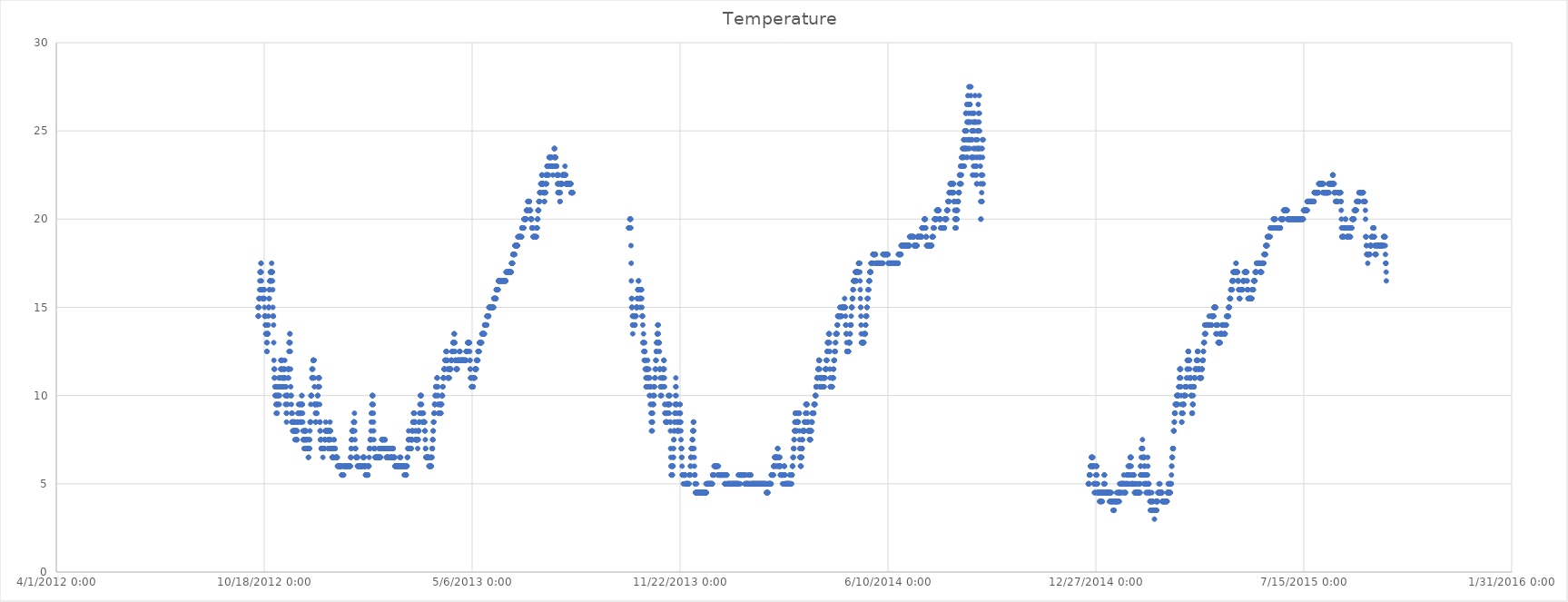
| Category | Temperature  |
|---|---|
| 41194.0 | 15 |
| 41194.166666666664 | 14.5 |
| 41194.333333333336 | 14.5 |
| 41194.5 | 14.5 |
| 41194.666666666664 | 15 |
| 41194.833333333336 | 15 |
| 41195.0 | 15.5 |
| 41195.166666666664 | 15.5 |
| 41195.333333333336 | 15.5 |
| 41195.5 | 15.5 |
| 41195.666666666664 | 16 |
| 41195.833333333336 | 16.5 |
| 41196.0 | 17 |
| 41196.166666666664 | 17 |
| 41196.333333333336 | 17 |
| 41196.5 | 17 |
| 41196.666666666664 | 17 |
| 41196.833333333336 | 17.5 |
| 41197.0 | 17.5 |
| 41197.166666666664 | 17 |
| 41197.333333333336 | 16.5 |
| 41197.5 | 16 |
| 41197.666666666664 | 16 |
| 41197.833333333336 | 16 |
| 41198.0 | 16 |
| 41198.166666666664 | 16 |
| 41198.333333333336 | 15.5 |
| 41198.5 | 15.5 |
| 41198.666666666664 | 15.5 |
| 41198.833333333336 | 16 |
| 41199.0 | 16 |
| 41199.166666666664 | 16 |
| 41199.333333333336 | 15.5 |
| 41199.5 | 15.5 |
| 41199.666666666664 | 15.5 |
| 41199.833333333336 | 16 |
| 41200.0 | 16 |
| 41200.166666666664 | 15.5 |
| 41200.333333333336 | 15 |
| 41200.5 | 14.5 |
| 41200.666666666664 | 14.5 |
| 41200.833333333336 | 14.5 |
| 41201.0 | 14.5 |
| 41201.166666666664 | 14 |
| 41201.333333333336 | 14 |
| 41201.5 | 13.5 |
| 41201.666666666664 | 13.5 |
| 41201.833333333336 | 14 |
| 41202.0 | 14 |
| 41202.166666666664 | 13.5 |
| 41202.333333333336 | 13 |
| 41202.5 | 12.5 |
| 41202.666666666664 | 12.5 |
| 41202.833333333336 | 13 |
| 41203.0 | 13.5 |
| 41203.166666666664 | 13.5 |
| 41203.333333333336 | 13.5 |
| 41203.5 | 13.5 |
| 41203.666666666664 | 13.5 |
| 41203.833333333336 | 14 |
| 41204.0 | 14.5 |
| 41204.166666666664 | 15 |
| 41204.333333333336 | 15 |
| 41204.5 | 15 |
| 41204.666666666664 | 15.5 |
| 41204.833333333336 | 15.5 |
| 41205.0 | 16 |
| 41205.166666666664 | 16 |
| 41205.333333333336 | 16.5 |
| 41205.5 | 16.5 |
| 41205.666666666664 | 16.5 |
| 41205.833333333336 | 17 |
| 41206.0 | 17 |
| 41206.166666666664 | 17 |
| 41206.333333333336 | 17 |
| 41206.5 | 16.5 |
| 41206.666666666664 | 16.5 |
| 41206.833333333336 | 17 |
| 41207.0 | 17 |
| 41207.166666666664 | 17.5 |
| 41207.333333333336 | 17 |
| 41207.5 | 17 |
| 41207.666666666664 | 17 |
| 41207.833333333336 | 17 |
| 41208.0 | 16.5 |
| 41208.166666666664 | 16 |
| 41208.333333333336 | 15 |
| 41208.5 | 14.5 |
| 41208.666666666664 | 14.5 |
| 41208.833333333336 | 14.5 |
| 41209.0 | 14 |
| 41209.166666666664 | 13 |
| 41209.333333333336 | 12 |
| 41209.5 | 11.5 |
| 41209.666666666664 | 11 |
| 41209.833333333336 | 11.5 |
| 41210.0 | 11.5 |
| 41210.166666666664 | 11 |
| 41210.333333333336 | 10.5 |
| 41210.5 | 10 |
| 41210.666666666664 | 10 |
| 41210.833333333336 | 10.5 |
| 41211.0 | 10.5 |
| 41211.166666666664 | 10 |
| 41211.333333333336 | 9.5 |
| 41211.5 | 9 |
| 41211.666666666664 | 9.5 |
| 41211.833333333336 | 10 |
| 41212.0 | 10.5 |
| 41212.166666666664 | 10 |
| 41212.333333333336 | 9.5 |
| 41212.5 | 9 |
| 41212.666666666664 | 9.5 |
| 41212.833333333336 | 10 |
| 41213.0 | 10.5 |
| 41213.166666666664 | 10.5 |
| 41213.333333333336 | 10 |
| 41213.5 | 9.5 |
| 41213.666666666664 | 10 |
| 41213.833333333336 | 10.5 |
| 41214.0 | 11 |
| 41214.166666666664 | 10.5 |
| 41214.333333333336 | 10 |
| 41214.5 | 9.5 |
| 41214.666666666664 | 10 |
| 41214.833333333336 | 10.5 |
| 41215.0 | 11 |
| 41215.166666666664 | 11 |
| 41215.333333333336 | 10.5 |
| 41215.5 | 10.5 |
| 41215.666666666664 | 10.5 |
| 41215.833333333336 | 11.5 |
| 41216.0 | 12 |
| 41216.166666666664 | 12 |
| 41216.333333333336 | 11.5 |
| 41216.5 | 11.5 |
| 41216.666666666664 | 11.5 |
| 41216.833333333336 | 12 |
| 41217.0 | 12 |
| 41217.125 | 11.5 |
| 41217.291666666664 | 11 |
| 41217.458333333336 | 10.5 |
| 41217.625 | 10.5 |
| 41217.791666666664 | 11 |
| 41217.958333333336 | 11 |
| 41218.125 | 11 |
| 41218.291666666664 | 10.5 |
| 41218.458333333336 | 10.5 |
| 41218.625 | 11 |
| 41218.791666666664 | 11.5 |
| 41218.958333333336 | 11.5 |
| 41219.125 | 11.5 |
| 41219.291666666664 | 11 |
| 41219.458333333336 | 11 |
| 41219.625 | 11 |
| 41219.791666666664 | 12 |
| 41219.958333333336 | 11.5 |
| 41220.125 | 11 |
| 41220.291666666664 | 10 |
| 41220.458333333336 | 9.5 |
| 41220.625 | 10 |
| 41220.791666666664 | 10.5 |
| 41220.958333333336 | 10.5 |
| 41221.125 | 9.5 |
| 41221.291666666664 | 9 |
| 41221.458333333336 | 8.5 |
| 41221.625 | 9 |
| 41221.791666666664 | 10 |
| 41221.958333333336 | 10 |
| 41222.125 | 10 |
| 41222.291666666664 | 10 |
| 41222.458333333336 | 9.5 |
| 41222.625 | 10 |
| 41222.791666666664 | 11 |
| 41222.958333333336 | 11.5 |
| 41223.125 | 11.5 |
| 41223.291666666664 | 11.5 |
| 41223.458333333336 | 11 |
| 41223.625 | 11.5 |
| 41223.791666666664 | 12.5 |
| 41223.958333333336 | 13 |
| 41224.125 | 13 |
| 41224.291666666664 | 13 |
| 41224.458333333336 | 13 |
| 41224.625 | 13.5 |
| 41224.791666666664 | 13.5 |
| 41224.958333333336 | 13 |
| 41225.125 | 12.5 |
| 41225.291666666664 | 11.5 |
| 41225.458333333336 | 10.5 |
| 41225.625 | 10 |
| 41225.791666666664 | 10 |
| 41225.958333333336 | 10 |
| 41226.125 | 9.5 |
| 41226.291666666664 | 9 |
| 41226.458333333336 | 8.5 |
| 41226.625 | 8.5 |
| 41226.791666666664 | 9 |
| 41226.958333333336 | 9 |
| 41227.125 | 8.5 |
| 41227.291666666664 | 8.5 |
| 41227.458333333336 | 8 |
| 41227.625 | 8 |
| 41227.791666666664 | 8.5 |
| 41227.958333333336 | 8.5 |
| 41228.125 | 8.5 |
| 41228.291666666664 | 8 |
| 41228.458333333336 | 8 |
| 41228.625 | 8 |
| 41228.791666666664 | 8.5 |
| 41228.958333333336 | 8.5 |
| 41229.125 | 8.5 |
| 41229.291666666664 | 8 |
| 41229.458333333336 | 7.5 |
| 41229.625 | 8 |
| 41229.791666666664 | 8 |
| 41229.958333333336 | 8.5 |
| 41230.125 | 8 |
| 41230.291666666664 | 8 |
| 41230.458333333336 | 7.5 |
| 41230.625 | 7.5 |
| 41230.791666666664 | 8 |
| 41230.958333333336 | 8 |
| 41231.125 | 8 |
| 41231.291666666664 | 7.5 |
| 41231.458333333336 | 7.5 |
| 41231.625 | 7.5 |
| 41231.791666666664 | 8 |
| 41231.958333333336 | 8.5 |
| 41232.125 | 8.5 |
| 41232.291666666664 | 8.5 |
| 41232.458333333336 | 9 |
| 41232.625 | 9 |
| 41232.791666666664 | 9 |
| 41232.958333333336 | 9.5 |
| 41233.125 | 9 |
| 41233.291666666664 | 9 |
| 41233.458333333336 | 9 |
| 41233.625 | 9 |
| 41233.791666666664 | 9 |
| 41233.958333333336 | 9.5 |
| 41234.125 | 9.5 |
| 41234.291666666664 | 9 |
| 41234.458333333336 | 8.5 |
| 41234.625 | 9 |
| 41234.791666666664 | 9 |
| 41234.958333333336 | 9.5 |
| 41235.125 | 9 |
| 41235.291666666664 | 9 |
| 41235.458333333336 | 8.5 |
| 41235.625 | 8.5 |
| 41235.791666666664 | 9 |
| 41235.958333333336 | 9.5 |
| 41236.125 | 10 |
| 41236.291666666664 | 10 |
| 41236.458333333336 | 9.5 |
| 41236.625 | 9.5 |
| 41236.791666666664 | 9.5 |
| 41236.958333333336 | 9 |
| 41237.125 | 8.5 |
| 41237.291666666664 | 8 |
| 41237.458333333336 | 7.5 |
| 41237.625 | 7.5 |
| 41237.791666666664 | 8 |
| 41237.958333333336 | 7.5 |
| 41238.125 | 7.5 |
| 41238.291666666664 | 7.5 |
| 41238.458333333336 | 7 |
| 41238.625 | 7 |
| 41238.791666666664 | 7.5 |
| 41238.958333333336 | 8 |
| 41239.125 | 8 |
| 41239.291666666664 | 7.5 |
| 41239.458333333336 | 7.5 |
| 41239.625 | 8 |
| 41239.791666666664 | 8 |
| 41239.958333333336 | 8 |
| 41240.125 | 7.5 |
| 41240.291666666664 | 7.5 |
| 41240.458333333336 | 7 |
| 41240.625 | 7 |
| 41240.791666666664 | 7.5 |
| 41240.958333333336 | 7.5 |
| 41241.125 | 7 |
| 41241.291666666664 | 7 |
| 41241.458333333336 | 7 |
| 41241.625 | 7 |
| 41241.791666666664 | 7 |
| 41241.958333333336 | 7 |
| 41242.125 | 7 |
| 41242.291666666664 | 7 |
| 41242.458333333336 | 6.5 |
| 41242.625 | 6.5 |
| 41242.791666666664 | 7 |
| 41242.958333333336 | 7.5 |
| 41243.125 | 7.5 |
| 41243.291666666664 | 7 |
| 41243.458333333336 | 7 |
| 41243.625 | 7 |
| 41243.791666666664 | 7.5 |
| 41243.958333333336 | 8 |
| 41244.125 | 8.5 |
| 41244.291666666664 | 8.5 |
| 41244.458333333336 | 8.5 |
| 41244.625 | 8.5 |
| 41244.791666666664 | 9.5 |
| 41244.958333333336 | 10 |
| 41245.125 | 10 |
| 41245.291666666664 | 10 |
| 41245.458333333336 | 10 |
| 41245.625 | 10 |
| 41245.791666666664 | 11 |
| 41245.958333333336 | 11.5 |
| 41246.125 | 11.5 |
| 41246.291666666664 | 11 |
| 41246.458333333336 | 11 |
| 41246.625 | 11 |
| 41246.791666666664 | 11.5 |
| 41246.958333333336 | 12 |
| 41247.125 | 12 |
| 41247.291666666664 | 12 |
| 41247.458333333336 | 12 |
| 41247.625 | 12 |
| 41247.791666666664 | 12 |
| 41247.958333333336 | 12 |
| 41248.125 | 11 |
| 41248.291666666664 | 10.5 |
| 41248.458333333336 | 9.5 |
| 41248.625 | 9.5 |
| 41248.791666666664 | 9.5 |
| 41248.958333333336 | 9.5 |
| 41249.125 | 9.5 |
| 41249.291666666664 | 9 |
| 41249.458333333336 | 8.5 |
| 41249.625 | 8.5 |
| 41249.791666666664 | 9 |
| 41249.958333333336 | 9 |
| 41250.125 | 9 |
| 41250.291666666664 | 9 |
| 41250.458333333336 | 9 |
| 41250.625 | 9 |
| 41250.791666666664 | 9.5 |
| 41250.958333333336 | 9.5 |
| 41251.125 | 9.5 |
| 41251.291666666664 | 10 |
| 41251.458333333336 | 10 |
| 41251.625 | 10 |
| 41251.791666666664 | 10.5 |
| 41251.958333333336 | 10.5 |
| 41252.125 | 11 |
| 41252.291666666664 | 11 |
| 41252.458333333336 | 11 |
| 41252.625 | 11 |
| 41252.791666666664 | 11 |
| 41252.958333333336 | 11 |
| 41253.125 | 10.5 |
| 41253.291666666664 | 9.5 |
| 41253.458333333336 | 8.5 |
| 41253.625 | 8.5 |
| 41253.791666666664 | 8 |
| 41253.958333333336 | 8 |
| 41254.125 | 7.5 |
| 41254.291666666664 | 7.5 |
| 41254.458333333336 | 7.5 |
| 41254.625 | 7.5 |
| 41254.791666666664 | 7 |
| 41254.958333333336 | 7 |
| 41255.125 | 7 |
| 41255.291666666664 | 7 |
| 41255.458333333336 | 7 |
| 41255.625 | 7 |
| 41255.791666666664 | 7 |
| 41255.958333333336 | 7 |
| 41256.125 | 7 |
| 41256.291666666664 | 7 |
| 41256.458333333336 | 6.5 |
| 41256.625 | 7 |
| 41256.791666666664 | 7 |
| 41256.958333333336 | 7 |
| 41257.125 | 7 |
| 41257.291666666664 | 7 |
| 41257.458333333336 | 7 |
| 41257.625 | 7 |
| 41257.791666666664 | 7 |
| 41257.958333333336 | 7 |
| 41258.125 | 7.5 |
| 41258.291666666664 | 7.5 |
| 41258.458333333336 | 7.5 |
| 41258.625 | 7.5 |
| 41258.791666666664 | 8 |
| 41258.958333333336 | 8 |
| 41259.125 | 8.5 |
| 41259.291666666664 | 8 |
| 41259.458333333336 | 8 |
| 41259.625 | 8 |
| 41259.791666666664 | 8 |
| 41259.958333333336 | 8 |
| 41260.125 | 8 |
| 41260.291666666664 | 8 |
| 41260.458333333336 | 8 |
| 41260.625 | 8 |
| 41260.791666666664 | 8 |
| 41260.958333333336 | 8 |
| 41261.125 | 8 |
| 41261.291666666664 | 7.5 |
| 41261.458333333336 | 7 |
| 41261.625 | 7 |
| 41261.791666666664 | 7.5 |
| 41261.958333333336 | 8 |
| 41262.125 | 8 |
| 41262.291666666664 | 7.5 |
| 41262.458333333336 | 7.5 |
| 41262.625 | 7.5 |
| 41262.791666666664 | 7.5 |
| 41262.958333333336 | 8 |
| 41263.125 | 8 |
| 41263.291666666664 | 8.5 |
| 41263.458333333336 | 8 |
| 41263.625 | 8 |
| 41263.791666666664 | 8 |
| 41263.958333333336 | 7.5 |
| 41264.125 | 7 |
| 41264.291666666664 | 7 |
| 41264.458333333336 | 7 |
| 41264.625 | 7 |
| 41264.791666666664 | 7 |
| 41264.958333333336 | 7 |
| 41265.125 | 7 |
| 41265.291666666664 | 6.5 |
| 41265.458333333336 | 6.5 |
| 41265.625 | 6.5 |
| 41265.791666666664 | 6.5 |
| 41265.958333333336 | 7 |
| 41266.125 | 7 |
| 41266.291666666664 | 6.5 |
| 41266.458333333336 | 6.5 |
| 41266.625 | 6.5 |
| 41266.791666666664 | 7 |
| 41266.958333333336 | 7 |
| 41267.125 | 7.5 |
| 41267.291666666664 | 7.5 |
| 41267.458333333336 | 7 |
| 41267.625 | 7 |
| 41267.791666666664 | 7 |
| 41267.958333333336 | 7 |
| 41268.125 | 7 |
| 41268.291666666664 | 7 |
| 41268.458333333336 | 6.5 |
| 41268.625 | 6.5 |
| 41268.791666666664 | 6.5 |
| 41268.958333333336 | 6.5 |
| 41269.125 | 6.5 |
| 41269.291666666664 | 6.5 |
| 41269.458333333336 | 6.5 |
| 41269.625 | 6.5 |
| 41269.791666666664 | 6.5 |
| 41269.958333333336 | 6.5 |
| 41270.125 | 6.5 |
| 41270.291666666664 | 6.5 |
| 41270.458333333336 | 6 |
| 41270.625 | 6 |
| 41270.791666666664 | 6 |
| 41270.958333333336 | 6 |
| 41271.125 | 6 |
| 41271.291666666664 | 6 |
| 41271.458333333336 | 6 |
| 41271.625 | 6 |
| 41271.791666666664 | 6 |
| 41271.958333333336 | 6 |
| 41272.125 | 6 |
| 41272.291666666664 | 6 |
| 41272.458333333336 | 6 |
| 41272.625 | 6 |
| 41272.791666666664 | 6 |
| 41272.958333333336 | 6 |
| 41273.125 | 6 |
| 41273.291666666664 | 6 |
| 41273.458333333336 | 6 |
| 41273.625 | 6 |
| 41273.791666666664 | 6 |
| 41273.958333333336 | 6 |
| 41274.125 | 6 |
| 41274.291666666664 | 6 |
| 41274.458333333336 | 5.5 |
| 41274.625 | 5.5 |
| 41274.791666666664 | 5.5 |
| 41274.958333333336 | 5.5 |
| 41275.125 | 5.5 |
| 41275.291666666664 | 5.5 |
| 41275.458333333336 | 5.5 |
| 41275.625 | 5.5 |
| 41275.791666666664 | 5.5 |
| 41275.958333333336 | 5.5 |
| 41276.125 | 6 |
| 41276.291666666664 | 6 |
| 41276.458333333336 | 5.5 |
| 41276.625 | 6 |
| 41276.791666666664 | 6 |
| 41276.958333333336 | 6 |
| 41277.125 | 6 |
| 41277.291666666664 | 6 |
| 41277.458333333336 | 6 |
| 41277.625 | 6 |
| 41277.791666666664 | 6 |
| 41277.958333333336 | 6 |
| 41278.125 | 6 |
| 41278.291666666664 | 6 |
| 41278.458333333336 | 6 |
| 41278.625 | 6 |
| 41278.791666666664 | 6 |
| 41278.958333333336 | 6 |
| 41279.125 | 6 |
| 41279.291666666664 | 6 |
| 41279.458333333336 | 6 |
| 41279.625 | 6 |
| 41279.791666666664 | 6 |
| 41279.958333333336 | 6 |
| 41280.125 | 6 |
| 41280.291666666664 | 6 |
| 41280.458333333336 | 6 |
| 41280.625 | 6 |
| 41280.791666666664 | 6 |
| 41280.958333333336 | 6 |
| 41281.125 | 6 |
| 41281.291666666664 | 6 |
| 41281.458333333336 | 6 |
| 41281.625 | 6 |
| 41281.791666666664 | 6 |
| 41281.958333333336 | 6 |
| 41282.125 | 6 |
| 41282.291666666664 | 6 |
| 41282.458333333336 | 6 |
| 41282.625 | 6 |
| 41282.791666666664 | 6 |
| 41282.958333333336 | 6 |
| 41283.125 | 6.5 |
| 41283.291666666664 | 6.5 |
| 41283.458333333336 | 6.5 |
| 41283.625 | 7 |
| 41283.791666666664 | 7 |
| 41283.958333333336 | 7.5 |
| 41284.125 | 7.5 |
| 41284.291666666664 | 7.5 |
| 41284.458333333336 | 8 |
| 41284.625 | 8 |
| 41284.791666666664 | 8 |
| 41284.958333333336 | 8 |
| 41285.125 | 8 |
| 41285.291666666664 | 8 |
| 41285.458333333336 | 8 |
| 41285.625 | 8 |
| 41285.791666666664 | 8 |
| 41285.958333333336 | 8.5 |
| 41286.125 | 8.5 |
| 41286.291666666664 | 8.5 |
| 41286.458333333336 | 8.5 |
| 41286.625 | 8.5 |
| 41286.791666666664 | 9 |
| 41286.958333333336 | 8.5 |
| 41287.125 | 8 |
| 41287.291666666664 | 7.5 |
| 41287.458333333336 | 7 |
| 41287.625 | 7 |
| 41287.791666666664 | 7 |
| 41287.958333333336 | 7 |
| 41288.125 | 6.5 |
| 41288.291666666664 | 6.5 |
| 41288.458333333336 | 6.5 |
| 41288.625 | 6.5 |
| 41288.791666666664 | 6.5 |
| 41288.958333333336 | 6.5 |
| 41289.125 | 6.5 |
| 41289.291666666664 | 6.5 |
| 41289.458333333336 | 6.5 |
| 41289.625 | 6 |
| 41289.791666666664 | 6 |
| 41289.958333333336 | 6.5 |
| 41290.125 | 6 |
| 41290.291666666664 | 6 |
| 41290.458333333336 | 6 |
| 41290.625 | 6 |
| 41290.791666666664 | 6 |
| 41290.958333333336 | 6 |
| 41291.125 | 6 |
| 41291.291666666664 | 6 |
| 41291.458333333336 | 6 |
| 41291.625 | 6 |
| 41291.791666666664 | 6 |
| 41291.958333333336 | 6 |
| 41292.125 | 6 |
| 41292.291666666664 | 6 |
| 41292.458333333336 | 6 |
| 41292.625 | 6 |
| 41292.791666666664 | 6 |
| 41292.958333333336 | 6 |
| 41293.125 | 6 |
| 41293.291666666664 | 6 |
| 41293.458333333336 | 6 |
| 41293.625 | 6 |
| 41293.791666666664 | 6 |
| 41293.958333333336 | 6 |
| 41294.125 | 6 |
| 41294.291666666664 | 6 |
| 41294.458333333336 | 6 |
| 41294.625 | 6 |
| 41294.791666666664 | 6 |
| 41294.958333333336 | 6.5 |
| 41295.125 | 6.5 |
| 41295.291666666664 | 6.5 |
| 41295.458333333336 | 6.5 |
| 41295.625 | 6 |
| 41295.791666666664 | 6.5 |
| 41295.958333333336 | 6.5 |
| 41296.125 | 6.5 |
| 41296.291666666664 | 6 |
| 41296.458333333336 | 6 |
| 41296.625 | 6 |
| 41296.791666666664 | 6 |
| 41296.958333333336 | 6 |
| 41297.125 | 6 |
| 41297.291666666664 | 6 |
| 41297.458333333336 | 5.5 |
| 41297.625 | 5.5 |
| 41297.791666666664 | 5.5 |
| 41297.958333333336 | 6 |
| 41298.125 | 6 |
| 41298.291666666664 | 5.5 |
| 41298.458333333336 | 5.5 |
| 41298.625 | 5.5 |
| 41298.791666666664 | 5.5 |
| 41298.958333333336 | 5.5 |
| 41299.125 | 5.5 |
| 41299.291666666664 | 5.5 |
| 41299.458333333336 | 5.5 |
| 41299.625 | 5.5 |
| 41299.791666666664 | 5.5 |
| 41299.958333333336 | 6 |
| 41300.125 | 6 |
| 41300.291666666664 | 6 |
| 41300.458333333336 | 6 |
| 41300.625 | 6 |
| 41300.791666666664 | 6 |
| 41300.958333333336 | 6.5 |
| 41301.125 | 7 |
| 41301.291666666664 | 7 |
| 41301.458333333336 | 7 |
| 41301.625 | 7 |
| 41301.791666666664 | 7 |
| 41301.958333333336 | 7.5 |
| 41302.125 | 7.5 |
| 41302.291666666664 | 7.5 |
| 41302.458333333336 | 7.5 |
| 41302.625 | 7.5 |
| 41302.791666666664 | 8 |
| 41302.958333333336 | 8.5 |
| 41303.125 | 9 |
| 41303.291666666664 | 9 |
| 41303.458333333336 | 9 |
| 41303.625 | 9.5 |
| 41303.791666666664 | 9.5 |
| 41303.958333333336 | 10 |
| 41304.125 | 10 |
| 41304.291666666664 | 10 |
| 41304.458333333336 | 10 |
| 41304.625 | 9.5 |
| 41304.791666666664 | 9.5 |
| 41304.958333333336 | 9 |
| 41305.125 | 8.5 |
| 41305.291666666664 | 8 |
| 41305.458333333336 | 7.5 |
| 41305.625 | 7 |
| 41305.791666666664 | 7 |
| 41305.958333333336 | 7 |
| 41306.125 | 7 |
| 41306.291666666664 | 7 |
| 41306.458333333336 | 7 |
| 41306.625 | 6.5 |
| 41306.791666666664 | 6.5 |
| 41306.958333333336 | 6.5 |
| 41307.125 | 6.5 |
| 41307.291666666664 | 6.5 |
| 41307.458333333336 | 6.5 |
| 41307.625 | 6.5 |
| 41307.791666666664 | 6.5 |
| 41307.958333333336 | 6.5 |
| 41308.125 | 6.5 |
| 41308.291666666664 | 6.5 |
| 41308.458333333336 | 6.5 |
| 41308.625 | 6.5 |
| 41308.791666666664 | 6.5 |
| 41308.958333333336 | 6.5 |
| 41309.125 | 6.5 |
| 41309.291666666664 | 6.5 |
| 41309.458333333336 | 6.5 |
| 41309.625 | 6.5 |
| 41309.791666666664 | 6.5 |
| 41309.958333333336 | 6.5 |
| 41310.125 | 7 |
| 41310.291666666664 | 6.5 |
| 41310.458333333336 | 6.5 |
| 41310.625 | 6.5 |
| 41310.791666666664 | 6.5 |
| 41310.958333333336 | 6.5 |
| 41311.125 | 7 |
| 41311.291666666664 | 6.5 |
| 41311.458333333336 | 6.5 |
| 41311.625 | 6.5 |
| 41311.791666666664 | 6.5 |
| 41311.958333333336 | 6.5 |
| 41312.125 | 7 |
| 41312.291666666664 | 7 |
| 41312.458333333336 | 7 |
| 41312.625 | 7 |
| 41312.791666666664 | 7 |
| 41312.958333333336 | 7 |
| 41313.125 | 7.5 |
| 41313.291666666664 | 7.5 |
| 41313.458333333336 | 7.5 |
| 41313.625 | 7.5 |
| 41313.791666666664 | 7.5 |
| 41313.958333333336 | 7.5 |
| 41314.125 | 7.5 |
| 41314.291666666664 | 7.5 |
| 41314.458333333336 | 7 |
| 41314.625 | 7 |
| 41314.791666666664 | 7 |
| 41314.958333333336 | 7.5 |
| 41315.125 | 7 |
| 41315.291666666664 | 7 |
| 41315.458333333336 | 7 |
| 41315.625 | 7 |
| 41315.791666666664 | 7.5 |
| 41315.958333333336 | 7.5 |
| 41316.125 | 7.5 |
| 41316.291666666664 | 7.5 |
| 41316.458333333336 | 7 |
| 41316.625 | 7 |
| 41316.791666666664 | 7 |
| 41316.958333333336 | 7 |
| 41317.125 | 7 |
| 41317.291666666664 | 7 |
| 41317.458333333336 | 6.5 |
| 41317.625 | 6.5 |
| 41317.791666666664 | 6.5 |
| 41317.958333333336 | 6.5 |
| 41318.125 | 6.5 |
| 41318.291666666664 | 6.5 |
| 41318.458333333336 | 6.5 |
| 41318.625 | 6.5 |
| 41318.791666666664 | 6.5 |
| 41318.958333333336 | 6.5 |
| 41319.125 | 7 |
| 41319.291666666664 | 7 |
| 41319.458333333336 | 6.5 |
| 41319.625 | 6.5 |
| 41319.791666666664 | 6.5 |
| 41319.958333333336 | 7 |
| 41320.125 | 7 |
| 41320.291666666664 | 7 |
| 41320.458333333336 | 7 |
| 41320.625 | 7 |
| 41320.791666666664 | 7 |
| 41320.958333333336 | 7 |
| 41321.125 | 7 |
| 41321.291666666664 | 6.5 |
| 41321.458333333336 | 6.5 |
| 41321.625 | 6.5 |
| 41321.791666666664 | 6.5 |
| 41321.958333333336 | 6.5 |
| 41322.125 | 6.5 |
| 41322.291666666664 | 6.5 |
| 41322.458333333336 | 6.5 |
| 41322.625 | 6.5 |
| 41322.791666666664 | 6.5 |
| 41322.958333333336 | 6.5 |
| 41323.125 | 6.5 |
| 41323.291666666664 | 7 |
| 41323.458333333336 | 7 |
| 41323.625 | 7 |
| 41323.791666666664 | 7 |
| 41323.958333333336 | 7 |
| 41324.125 | 7 |
| 41324.291666666664 | 6.5 |
| 41324.458333333336 | 6.5 |
| 41324.625 | 6.5 |
| 41324.791666666664 | 6.5 |
| 41324.958333333336 | 6.5 |
| 41325.125 | 6.5 |
| 41325.291666666664 | 6.5 |
| 41325.458333333336 | 6.5 |
| 41325.625 | 6 |
| 41325.791666666664 | 6 |
| 41325.958333333336 | 6 |
| 41326.125 | 6 |
| 41326.291666666664 | 6 |
| 41326.458333333336 | 6 |
| 41326.625 | 6 |
| 41326.791666666664 | 6 |
| 41326.958333333336 | 6 |
| 41327.125 | 6 |
| 41327.291666666664 | 6 |
| 41327.458333333336 | 6 |
| 41327.625 | 6 |
| 41327.791666666664 | 6 |
| 41327.958333333336 | 6 |
| 41328.125 | 6 |
| 41328.291666666664 | 6 |
| 41328.458333333336 | 6 |
| 41328.625 | 6 |
| 41328.791666666664 | 6 |
| 41328.958333333336 | 6 |
| 41329.125 | 6 |
| 41329.291666666664 | 6 |
| 41329.458333333336 | 6 |
| 41329.625 | 6 |
| 41329.791666666664 | 6 |
| 41329.958333333336 | 6 |
| 41330.125 | 6.5 |
| 41330.291666666664 | 6 |
| 41330.458333333336 | 6 |
| 41330.625 | 6 |
| 41330.791666666664 | 6 |
| 41330.958333333336 | 6 |
| 41331.125 | 6.5 |
| 41331.291666666664 | 6.5 |
| 41331.458333333336 | 6 |
| 41331.625 | 6 |
| 41331.791666666664 | 6 |
| 41331.958333333336 | 6 |
| 41332.125 | 6 |
| 41332.291666666664 | 6 |
| 41332.458333333336 | 6 |
| 41332.625 | 6 |
| 41332.791666666664 | 6 |
| 41332.958333333336 | 6 |
| 41333.125 | 6 |
| 41333.291666666664 | 6 |
| 41333.458333333336 | 6 |
| 41333.625 | 6 |
| 41333.791666666664 | 6 |
| 41333.958333333336 | 6 |
| 41334.125 | 6 |
| 41334.291666666664 | 6 |
| 41334.458333333336 | 6 |
| 41334.625 | 5.5 |
| 41334.791666666664 | 6 |
| 41334.958333333336 | 6 |
| 41335.125 | 6 |
| 41335.291666666664 | 6 |
| 41335.458333333336 | 5.5 |
| 41335.625 | 5.5 |
| 41335.791666666664 | 6 |
| 41335.958333333336 | 6 |
| 41336.125 | 6 |
| 41336.291666666664 | 5.5 |
| 41336.458333333336 | 5.5 |
| 41336.625 | 5.5 |
| 41336.791666666664 | 6 |
| 41336.958333333336 | 6 |
| 41337.125 | 6 |
| 41337.291666666664 | 6 |
| 41337.458333333336 | 6 |
| 41337.625 | 6.5 |
| 41337.791666666664 | 6.5 |
| 41337.958333333336 | 6.5 |
| 41338.125 | 7 |
| 41338.291666666664 | 7 |
| 41338.458333333336 | 7 |
| 41338.625 | 7.5 |
| 41338.791666666664 | 7.5 |
| 41338.958333333336 | 8 |
| 41339.125 | 7.5 |
| 41339.291666666664 | 7.5 |
| 41339.458333333336 | 7 |
| 41339.625 | 7 |
| 41339.791666666664 | 7 |
| 41339.958333333336 | 7 |
| 41340.125 | 7 |
| 41340.291666666664 | 7 |
| 41340.458333333336 | 7 |
| 41340.625 | 7 |
| 41340.791666666664 | 7 |
| 41340.958333333336 | 7 |
| 41341.125 | 7.5 |
| 41341.291666666664 | 7.5 |
| 41341.458333333336 | 7.5 |
| 41341.625 | 7 |
| 41341.791666666664 | 7.5 |
| 41341.958333333336 | 7.5 |
| 41342.125 | 7.5 |
| 41342.291666666664 | 7.5 |
| 41342.458333333336 | 8 |
| 41342.625 | 8 |
| 41342.791666666664 | 8 |
| 41342.958333333336 | 8.5 |
| 41343.166666666664 | 8.5 |
| 41343.333333333336 | 8.5 |
| 41343.5 | 8.5 |
| 41343.666666666664 | 9 |
| 41343.833333333336 | 9 |
| 41344.0 | 9 |
| 41344.166666666664 | 9 |
| 41344.333333333336 | 9 |
| 41344.5 | 8.5 |
| 41344.666666666664 | 8.5 |
| 41344.833333333336 | 8.5 |
| 41345.0 | 8.5 |
| 41345.166666666664 | 8.5 |
| 41345.333333333336 | 8 |
| 41345.5 | 7.5 |
| 41345.666666666664 | 7.5 |
| 41345.833333333336 | 7.5 |
| 41346.0 | 7.5 |
| 41346.166666666664 | 8 |
| 41346.333333333336 | 7.5 |
| 41346.5 | 7.5 |
| 41346.666666666664 | 7.5 |
| 41346.833333333336 | 7.5 |
| 41347.0 | 7.5 |
| 41347.166666666664 | 7.5 |
| 41347.333333333336 | 7.5 |
| 41347.5 | 7.5 |
| 41347.666666666664 | 7 |
| 41347.833333333336 | 7.5 |
| 41348.0 | 7.5 |
| 41348.166666666664 | 7.5 |
| 41348.333333333336 | 8 |
| 41348.5 | 8 |
| 41348.666666666664 | 8 |
| 41348.833333333336 | 8 |
| 41349.0 | 8.5 |
| 41349.166666666664 | 8.5 |
| 41349.333333333336 | 8.5 |
| 41349.5 | 9 |
| 41349.666666666664 | 9 |
| 41349.833333333336 | 9.5 |
| 41350.0 | 9.5 |
| 41350.166666666664 | 10 |
| 41350.333333333336 | 10 |
| 41350.5 | 10 |
| 41350.666666666664 | 10 |
| 41350.833333333336 | 10 |
| 41351.0 | 10 |
| 41351.166666666664 | 9.5 |
| 41351.333333333336 | 9.5 |
| 41351.5 | 9 |
| 41351.666666666664 | 9 |
| 41351.833333333336 | 9 |
| 41352.0 | 9 |
| 41352.166666666664 | 9 |
| 41352.333333333336 | 9 |
| 41352.5 | 8.5 |
| 41352.666666666664 | 8.5 |
| 41352.833333333336 | 8.5 |
| 41353.0 | 8.5 |
| 41353.166666666664 | 9 |
| 41353.333333333336 | 8.5 |
| 41353.5 | 8.5 |
| 41353.666666666664 | 8.5 |
| 41353.833333333336 | 8.5 |
| 41354.0 | 8.5 |
| 41354.166666666664 | 8.5 |
| 41354.333333333336 | 8.5 |
| 41354.5 | 8 |
| 41354.666666666664 | 8 |
| 41354.833333333336 | 8 |
| 41355.0 | 7.5 |
| 41355.166666666664 | 7 |
| 41355.333333333336 | 7 |
| 41355.5 | 6.5 |
| 41355.666666666664 | 6.5 |
| 41355.833333333336 | 6.5 |
| 41356.0 | 6.5 |
| 41356.166666666664 | 6.5 |
| 41356.333333333336 | 6.5 |
| 41356.5 | 6.5 |
| 41356.666666666664 | 6.5 |
| 41356.833333333336 | 6.5 |
| 41357.0 | 6.5 |
| 41357.166666666664 | 6.5 |
| 41357.333333333336 | 6.5 |
| 41357.5 | 6.5 |
| 41357.666666666664 | 6.5 |
| 41357.833333333336 | 6.5 |
| 41358.0 | 6.5 |
| 41358.166666666664 | 6.5 |
| 41358.333333333336 | 6.5 |
| 41358.5 | 6 |
| 41358.666666666664 | 6 |
| 41358.833333333336 | 6 |
| 41359.0 | 6 |
| 41359.166666666664 | 6 |
| 41359.333333333336 | 6 |
| 41359.5 | 6 |
| 41359.666666666664 | 6 |
| 41359.833333333336 | 6 |
| 41360.0 | 6 |
| 41360.166666666664 | 6.5 |
| 41360.333333333336 | 6.5 |
| 41360.5 | 6 |
| 41360.666666666664 | 6 |
| 41360.833333333336 | 6 |
| 41361.0 | 6.5 |
| 41361.166666666664 | 6.5 |
| 41361.333333333336 | 6.5 |
| 41361.5 | 7 |
| 41361.666666666664 | 7 |
| 41361.833333333336 | 7 |
| 41362.0 | 7.5 |
| 41362.166666666664 | 7.5 |
| 41362.333333333336 | 7.5 |
| 41362.5 | 8 |
| 41362.666666666664 | 8 |
| 41362.833333333336 | 8.5 |
| 41363.0 | 8.5 |
| 41363.166666666664 | 8.5 |
| 41363.333333333336 | 9 |
| 41363.5 | 9 |
| 41363.666666666664 | 9 |
| 41363.833333333336 | 9.5 |
| 41364.0 | 9.5 |
| 41364.166666666664 | 9.5 |
| 41364.333333333336 | 9.5 |
| 41364.5 | 10 |
| 41364.666666666664 | 10 |
| 41364.833333333336 | 10 |
| 41365.0 | 10.5 |
| 41365.166666666664 | 10.5 |
| 41365.333333333336 | 10.5 |
| 41365.5 | 10.5 |
| 41365.666666666664 | 10.5 |
| 41365.833333333336 | 10.5 |
| 41366.0 | 10.5 |
| 41366.166666666664 | 11 |
| 41366.333333333336 | 11 |
| 41366.5 | 11 |
| 41366.666666666664 | 10.5 |
| 41366.833333333336 | 10.5 |
| 41367.0 | 10 |
| 41367.166666666664 | 10 |
| 41367.333333333336 | 9.5 |
| 41367.5 | 9.5 |
| 41367.666666666664 | 9 |
| 41367.833333333336 | 9 |
| 41368.0 | 9 |
| 41368.166666666664 | 9 |
| 41368.333333333336 | 9 |
| 41368.5 | 9 |
| 41368.666666666664 | 9 |
| 41368.833333333336 | 9 |
| 41369.0 | 9.5 |
| 41369.166666666664 | 9.5 |
| 41369.333333333336 | 9.5 |
| 41369.5 | 9 |
| 41369.666666666664 | 9 |
| 41369.833333333336 | 9 |
| 41370.0 | 9 |
| 41370.166666666664 | 9.5 |
| 41370.333333333336 | 9.5 |
| 41370.5 | 9.5 |
| 41370.666666666664 | 9.5 |
| 41370.833333333336 | 10 |
| 41371.0 | 10 |
| 41371.166666666664 | 10 |
| 41371.333333333336 | 10 |
| 41371.5 | 10 |
| 41371.666666666664 | 10.5 |
| 41371.833333333336 | 10.5 |
| 41372.0 | 10.5 |
| 41372.166666666664 | 11 |
| 41372.333333333336 | 11 |
| 41372.5 | 11 |
| 41372.666666666664 | 11 |
| 41372.833333333336 | 11 |
| 41373.0 | 11.5 |
| 41373.166666666664 | 11.5 |
| 41373.333333333336 | 11.5 |
| 41373.5 | 11.5 |
| 41373.666666666664 | 11.5 |
| 41373.833333333336 | 12 |
| 41374.0 | 12 |
| 41374.166666666664 | 12 |
| 41374.333333333336 | 12 |
| 41374.5 | 12 |
| 41374.666666666664 | 12 |
| 41374.833333333336 | 12.5 |
| 41375.0 | 12.5 |
| 41375.166666666664 | 12.5 |
| 41375.333333333336 | 12.5 |
| 41375.5 | 12.5 |
| 41375.666666666664 | 12 |
| 41375.833333333336 | 12 |
| 41376.0 | 12 |
| 41376.166666666664 | 12 |
| 41376.333333333336 | 11.5 |
| 41376.5 | 11.5 |
| 41376.666666666664 | 11 |
| 41376.833333333336 | 11 |
| 41377.0 | 11 |
| 41377.166666666664 | 11 |
| 41377.333333333336 | 11.5 |
| 41377.5 | 11 |
| 41377.666666666664 | 11 |
| 41377.833333333336 | 11 |
| 41378.0 | 11 |
| 41378.166666666664 | 11.5 |
| 41378.333333333336 | 11.5 |
| 41378.5 | 11.5 |
| 41378.666666666664 | 11.5 |
| 41378.833333333336 | 11.5 |
| 41379.0 | 11.5 |
| 41379.166666666664 | 11.5 |
| 41379.333333333336 | 11.5 |
| 41379.5 | 11.5 |
| 41379.666666666664 | 12 |
| 41379.833333333336 | 12 |
| 41380.0 | 12 |
| 41380.166666666664 | 12 |
| 41380.333333333336 | 12 |
| 41380.5 | 12 |
| 41380.666666666664 | 12.5 |
| 41380.833333333336 | 12.5 |
| 41381.0 | 12.5 |
| 41381.166666666664 | 12.5 |
| 41381.333333333336 | 12.5 |
| 41381.5 | 13 |
| 41381.666666666664 | 13 |
| 41381.833333333336 | 13 |
| 41382.0 | 13 |
| 41382.166666666664 | 13 |
| 41382.333333333336 | 13 |
| 41382.5 | 13 |
| 41382.666666666664 | 13.5 |
| 41382.833333333336 | 13.5 |
| 41383.0 | 13.5 |
| 41383.166666666664 | 13 |
| 41383.333333333336 | 13 |
| 41383.5 | 12.5 |
| 41383.666666666664 | 12 |
| 41383.833333333336 | 12 |
| 41384.0 | 12 |
| 41384.166666666664 | 12 |
| 41384.333333333336 | 12 |
| 41384.5 | 12 |
| 41384.666666666664 | 11.5 |
| 41384.833333333336 | 11.5 |
| 41385.0 | 11.5 |
| 41385.166666666664 | 11.5 |
| 41385.333333333336 | 11.5 |
| 41385.5 | 11.5 |
| 41385.666666666664 | 11.5 |
| 41385.833333333336 | 12 |
| 41386.0 | 12 |
| 41386.166666666664 | 12 |
| 41386.333333333336 | 12 |
| 41386.5 | 12 |
| 41386.666666666664 | 12 |
| 41386.833333333336 | 12 |
| 41387.0 | 12 |
| 41387.166666666664 | 12 |
| 41387.333333333336 | 12 |
| 41387.5 | 12 |
| 41387.666666666664 | 12 |
| 41387.833333333336 | 12.5 |
| 41388.0 | 12.5 |
| 41388.166666666664 | 12.5 |
| 41388.333333333336 | 12.5 |
| 41388.5 | 12 |
| 41388.666666666664 | 12 |
| 41388.833333333336 | 12 |
| 41389.0 | 12 |
| 41389.166666666664 | 12 |
| 41389.333333333336 | 12 |
| 41389.5 | 12 |
| 41389.666666666664 | 12 |
| 41389.833333333336 | 12 |
| 41390.0 | 12 |
| 41390.166666666664 | 12 |
| 41390.333333333336 | 12 |
| 41390.5 | 12 |
| 41390.666666666664 | 12 |
| 41390.833333333336 | 12 |
| 41391.0 | 12 |
| 41391.166666666664 | 12 |
| 41391.333333333336 | 12 |
| 41391.5 | 12 |
| 41391.666666666664 | 12 |
| 41391.833333333336 | 12 |
| 41392.0 | 12 |
| 41392.166666666664 | 12 |
| 41392.333333333336 | 12 |
| 41392.5 | 12 |
| 41392.666666666664 | 12 |
| 41392.833333333336 | 12 |
| 41393.0 | 12 |
| 41393.166666666664 | 12 |
| 41393.333333333336 | 12 |
| 41393.5 | 12 |
| 41393.666666666664 | 12 |
| 41393.833333333336 | 12 |
| 41394.0 | 12 |
| 41394.166666666664 | 12.5 |
| 41394.333333333336 | 12.5 |
| 41394.5 | 12.5 |
| 41394.666666666664 | 12.5 |
| 41394.833333333336 | 12.5 |
| 41395.0 | 12.5 |
| 41395.166666666664 | 12.5 |
| 41395.333333333336 | 12.5 |
| 41395.5 | 12.5 |
| 41395.666666666664 | 13 |
| 41395.833333333336 | 13 |
| 41396.0 | 13 |
| 41396.166666666664 | 13 |
| 41396.333333333336 | 13 |
| 41396.5 | 13 |
| 41396.666666666664 | 13 |
| 41396.833333333336 | 13 |
| 41397.0 | 13 |
| 41397.166666666664 | 13 |
| 41397.333333333336 | 13 |
| 41397.5 | 13 |
| 41397.666666666664 | 12.5 |
| 41397.833333333336 | 12 |
| 41398.0 | 12 |
| 41398.166666666664 | 11.5 |
| 41398.333333333336 | 11.5 |
| 41398.5 | 11 |
| 41398.666666666664 | 11 |
| 41398.833333333336 | 11 |
| 41399.0 | 11 |
| 41399.166666666664 | 11 |
| 41399.333333333336 | 10.5 |
| 41399.5 | 10.5 |
| 41399.666666666664 | 10.5 |
| 41399.833333333336 | 10.5 |
| 41400.0 | 10.5 |
| 41400.166666666664 | 10.5 |
| 41400.333333333336 | 10.5 |
| 41400.5 | 10.5 |
| 41400.666666666664 | 10.5 |
| 41400.833333333336 | 10.5 |
| 41401.0 | 10.5 |
| 41401.166666666664 | 11 |
| 41401.333333333336 | 11 |
| 41401.5 | 11 |
| 41401.666666666664 | 11 |
| 41401.833333333336 | 11 |
| 41402.0 | 11 |
| 41402.166666666664 | 11 |
| 41402.333333333336 | 11 |
| 41402.5 | 11 |
| 41402.666666666664 | 11.5 |
| 41402.833333333336 | 11.5 |
| 41403.0 | 11.5 |
| 41403.166666666664 | 11.5 |
| 41403.333333333336 | 11.5 |
| 41403.5 | 11.5 |
| 41403.666666666664 | 11.5 |
| 41403.833333333336 | 11.5 |
| 41404.0 | 11.5 |
| 41404.166666666664 | 12 |
| 41404.333333333336 | 12 |
| 41404.5 | 12 |
| 41404.666666666664 | 12 |
| 41404.833333333336 | 12 |
| 41405.0 | 12 |
| 41405.166666666664 | 12 |
| 41405.333333333336 | 12 |
| 41405.5 | 12 |
| 41405.666666666664 | 12.5 |
| 41405.833333333336 | 12.5 |
| 41406.0 | 12.5 |
| 41406.166666666664 | 12.5 |
| 41406.333333333336 | 12.5 |
| 41406.5 | 12.5 |
| 41406.666666666664 | 12.5 |
| 41406.833333333336 | 12.5 |
| 41407.0 | 13 |
| 41407.166666666664 | 13 |
| 41407.333333333336 | 13 |
| 41407.5 | 13 |
| 41407.666666666664 | 13 |
| 41407.833333333336 | 13 |
| 41408.0 | 13 |
| 41408.166666666664 | 13 |
| 41408.333333333336 | 13 |
| 41408.5 | 13 |
| 41408.666666666664 | 13 |
| 41408.833333333336 | 13 |
| 41409.0 | 13 |
| 41409.166666666664 | 13 |
| 41409.333333333336 | 13.5 |
| 41409.5 | 13.5 |
| 41409.666666666664 | 13.5 |
| 41409.833333333336 | 13.5 |
| 41410.0 | 13.5 |
| 41410.166666666664 | 13.5 |
| 41410.333333333336 | 13.5 |
| 41410.5 | 13.5 |
| 41410.666666666664 | 13.5 |
| 41410.833333333336 | 13.5 |
| 41411.0 | 13.5 |
| 41411.166666666664 | 13.5 |
| 41411.333333333336 | 13.5 |
| 41411.5 | 13.5 |
| 41411.666666666664 | 13.5 |
| 41411.833333333336 | 13.5 |
| 41412.0 | 14 |
| 41412.166666666664 | 14 |
| 41412.333333333336 | 14 |
| 41412.5 | 14 |
| 41412.666666666664 | 14 |
| 41412.833333333336 | 14 |
| 41413.0 | 14 |
| 41413.166666666664 | 14 |
| 41413.333333333336 | 14 |
| 41413.5 | 14 |
| 41413.666666666664 | 14 |
| 41413.833333333336 | 14 |
| 41414.0 | 14 |
| 41414.166666666664 | 14.5 |
| 41414.333333333336 | 14.5 |
| 41414.5 | 14.5 |
| 41414.666666666664 | 14.5 |
| 41414.833333333336 | 14.5 |
| 41415.0 | 14.5 |
| 41415.166666666664 | 14.5 |
| 41415.333333333336 | 14.5 |
| 41415.5 | 14.5 |
| 41415.666666666664 | 14.5 |
| 41415.833333333336 | 14.5 |
| 41416.0 | 14.5 |
| 41416.166666666664 | 15 |
| 41416.333333333336 | 15 |
| 41416.5 | 15 |
| 41416.666666666664 | 15 |
| 41416.833333333336 | 15 |
| 41417.0 | 15 |
| 41417.166666666664 | 15 |
| 41417.333333333336 | 15 |
| 41417.5 | 15 |
| 41417.666666666664 | 15 |
| 41417.833333333336 | 15 |
| 41418.0 | 15 |
| 41418.166666666664 | 15 |
| 41418.333333333336 | 15 |
| 41418.5 | 15 |
| 41418.666666666664 | 15 |
| 41418.833333333336 | 15 |
| 41419.0 | 15 |
| 41419.166666666664 | 15 |
| 41419.333333333336 | 15 |
| 41419.5 | 15 |
| 41419.666666666664 | 15 |
| 41419.833333333336 | 15 |
| 41420.0 | 15 |
| 41420.166666666664 | 15 |
| 41420.333333333336 | 15 |
| 41420.5 | 15 |
| 41420.666666666664 | 15 |
| 41420.833333333336 | 15.5 |
| 41421.0 | 15.5 |
| 41421.166666666664 | 15.5 |
| 41421.333333333336 | 15.5 |
| 41421.5 | 15.5 |
| 41421.666666666664 | 15.5 |
| 41421.833333333336 | 15.5 |
| 41422.0 | 15.5 |
| 41422.166666666664 | 15.5 |
| 41422.333333333336 | 15.5 |
| 41422.5 | 15.5 |
| 41422.666666666664 | 15.5 |
| 41422.833333333336 | 15.5 |
| 41423.0 | 15.5 |
| 41423.166666666664 | 16 |
| 41423.333333333336 | 16 |
| 41423.5 | 16 |
| 41423.666666666664 | 16 |
| 41423.833333333336 | 16 |
| 41424.0 | 16 |
| 41424.166666666664 | 16 |
| 41424.333333333336 | 16 |
| 41424.5 | 16 |
| 41424.666666666664 | 16 |
| 41424.833333333336 | 16 |
| 41425.0 | 16 |
| 41425.166666666664 | 16.5 |
| 41425.333333333336 | 16.5 |
| 41425.5 | 16.5 |
| 41425.666666666664 | 16.5 |
| 41425.833333333336 | 16.5 |
| 41426.0 | 16.5 |
| 41426.166666666664 | 16.5 |
| 41426.333333333336 | 16.5 |
| 41426.5 | 16.5 |
| 41426.666666666664 | 16.5 |
| 41426.833333333336 | 16.5 |
| 41427.0 | 16.5 |
| 41427.166666666664 | 16.5 |
| 41427.333333333336 | 16.5 |
| 41427.5 | 16.5 |
| 41427.666666666664 | 16.5 |
| 41427.833333333336 | 16.5 |
| 41428.0 | 16.5 |
| 41428.166666666664 | 16.5 |
| 41428.333333333336 | 16.5 |
| 41428.5 | 16.5 |
| 41428.666666666664 | 16.5 |
| 41428.833333333336 | 16.5 |
| 41429.0 | 16.5 |
| 41429.166666666664 | 16.5 |
| 41429.333333333336 | 16.5 |
| 41429.5 | 16.5 |
| 41429.666666666664 | 16.5 |
| 41429.833333333336 | 16.5 |
| 41430.0 | 16.5 |
| 41430.166666666664 | 16.5 |
| 41430.333333333336 | 16.5 |
| 41430.5 | 16.5 |
| 41430.666666666664 | 16.5 |
| 41430.833333333336 | 16.5 |
| 41431.0 | 16.5 |
| 41431.166666666664 | 16.5 |
| 41431.333333333336 | 16.5 |
| 41431.5 | 16.5 |
| 41431.666666666664 | 16.5 |
| 41431.833333333336 | 16.5 |
| 41432.0 | 16.5 |
| 41432.166666666664 | 16.5 |
| 41432.333333333336 | 16.5 |
| 41432.5 | 16.5 |
| 41432.666666666664 | 17 |
| 41432.833333333336 | 17 |
| 41433.0 | 17 |
| 41433.166666666664 | 17 |
| 41433.333333333336 | 17 |
| 41433.5 | 17 |
| 41433.666666666664 | 17 |
| 41433.833333333336 | 17 |
| 41434.0 | 17 |
| 41434.166666666664 | 17 |
| 41434.333333333336 | 17 |
| 41434.5 | 17 |
| 41434.666666666664 | 17 |
| 41434.833333333336 | 17 |
| 41435.0 | 17 |
| 41435.166666666664 | 17 |
| 41435.333333333336 | 17 |
| 41435.5 | 17 |
| 41435.666666666664 | 17 |
| 41435.833333333336 | 17 |
| 41436.0 | 17 |
| 41436.166666666664 | 17 |
| 41436.333333333336 | 17 |
| 41436.5 | 17 |
| 41436.666666666664 | 17 |
| 41436.833333333336 | 17 |
| 41437.0 | 17 |
| 41437.166666666664 | 17 |
| 41437.333333333336 | 17 |
| 41437.5 | 17 |
| 41437.666666666664 | 17 |
| 41437.833333333336 | 17.5 |
| 41438.0 | 17.5 |
| 41438.166666666664 | 17.5 |
| 41438.333333333336 | 17.5 |
| 41438.5 | 17.5 |
| 41438.666666666664 | 17.5 |
| 41438.833333333336 | 17.5 |
| 41439.0 | 17.5 |
| 41439.166666666664 | 18 |
| 41439.333333333336 | 18 |
| 41439.5 | 18 |
| 41439.666666666664 | 18 |
| 41439.833333333336 | 18 |
| 41440.0 | 18 |
| 41440.166666666664 | 18 |
| 41440.333333333336 | 18 |
| 41440.5 | 18 |
| 41440.666666666664 | 18 |
| 41440.833333333336 | 18 |
| 41441.0 | 18 |
| 41441.166666666664 | 18.5 |
| 41441.333333333336 | 18.5 |
| 41441.5 | 18.5 |
| 41441.666666666664 | 18.5 |
| 41441.833333333336 | 18.5 |
| 41442.0 | 18.5 |
| 41442.166666666664 | 18.5 |
| 41442.333333333336 | 18.5 |
| 41442.5 | 18.5 |
| 41442.666666666664 | 18.5 |
| 41442.833333333336 | 18.5 |
| 41443.0 | 18.5 |
| 41443.166666666664 | 18.5 |
| 41443.333333333336 | 18.5 |
| 41443.5 | 18.5 |
| 41443.666666666664 | 18.5 |
| 41443.833333333336 | 18.5 |
| 41444.0 | 19 |
| 41444.166666666664 | 19 |
| 41444.333333333336 | 19 |
| 41444.5 | 19 |
| 41444.666666666664 | 19 |
| 41444.833333333336 | 19 |
| 41445.0 | 19 |
| 41445.166666666664 | 19 |
| 41445.333333333336 | 19 |
| 41445.5 | 19 |
| 41445.666666666664 | 19 |
| 41445.833333333336 | 19 |
| 41446.0 | 19 |
| 41446.166666666664 | 19 |
| 41446.333333333336 | 19 |
| 41446.5 | 19 |
| 41446.666666666664 | 19 |
| 41446.833333333336 | 19 |
| 41447.0 | 19 |
| 41447.166666666664 | 19 |
| 41447.333333333336 | 19 |
| 41447.5 | 19 |
| 41447.666666666664 | 19 |
| 41447.833333333336 | 19.5 |
| 41448.0 | 19.5 |
| 41448.166666666664 | 19.5 |
| 41448.333333333336 | 19.5 |
| 41448.5 | 19.5 |
| 41448.666666666664 | 19.5 |
| 41448.833333333336 | 19.5 |
| 41449.0 | 19.5 |
| 41449.166666666664 | 19.5 |
| 41449.333333333336 | 19.5 |
| 41449.5 | 19.5 |
| 41449.666666666664 | 19.5 |
| 41449.833333333336 | 20 |
| 41450.0 | 20 |
| 41450.166666666664 | 20 |
| 41450.333333333336 | 20 |
| 41450.5 | 20 |
| 41450.666666666664 | 20 |
| 41450.833333333336 | 20 |
| 41451.0 | 20 |
| 41451.166666666664 | 20 |
| 41451.333333333336 | 20 |
| 41451.5 | 20 |
| 41451.666666666664 | 20 |
| 41451.833333333336 | 20 |
| 41452.0 | 20 |
| 41452.166666666664 | 20.5 |
| 41452.333333333336 | 20.5 |
| 41452.5 | 20.5 |
| 41452.666666666664 | 20.5 |
| 41452.833333333336 | 20.5 |
| 41453.0 | 20.5 |
| 41453.166666666664 | 20.5 |
| 41453.333333333336 | 20.5 |
| 41453.5 | 21 |
| 41453.666666666664 | 21 |
| 41453.833333333336 | 21 |
| 41454.0 | 21 |
| 41454.166666666664 | 21 |
| 41454.333333333336 | 21 |
| 41454.5 | 21 |
| 41454.666666666664 | 21 |
| 41454.833333333336 | 21 |
| 41455.0 | 21 |
| 41455.166666666664 | 21 |
| 41455.333333333336 | 20.5 |
| 41455.5 | 20.5 |
| 41455.666666666664 | 20.5 |
| 41455.833333333336 | 20.5 |
| 41456.0 | 20.5 |
| 41456.166666666664 | 20.5 |
| 41456.333333333336 | 20 |
| 41456.5 | 20 |
| 41456.666666666664 | 20 |
| 41456.833333333336 | 20 |
| 41457.0 | 20 |
| 41457.166666666664 | 20 |
| 41457.333333333336 | 20 |
| 41457.5 | 19.5 |
| 41457.666666666664 | 19.5 |
| 41457.833333333336 | 19.5 |
| 41458.0 | 19.5 |
| 41458.166666666664 | 19.5 |
| 41458.333333333336 | 19.5 |
| 41458.5 | 19.5 |
| 41458.666666666664 | 19 |
| 41458.833333333336 | 19 |
| 41459.0 | 19 |
| 41459.166666666664 | 19 |
| 41459.333333333336 | 19 |
| 41459.5 | 19 |
| 41459.666666666664 | 19 |
| 41459.833333333336 | 19 |
| 41460.0 | 19 |
| 41460.166666666664 | 19 |
| 41460.333333333336 | 19 |
| 41460.5 | 19 |
| 41460.666666666664 | 19 |
| 41460.833333333336 | 19 |
| 41461.0 | 19 |
| 41461.166666666664 | 19 |
| 41461.333333333336 | 19 |
| 41461.5 | 19 |
| 41461.666666666664 | 19 |
| 41461.833333333336 | 19 |
| 41462.0 | 19.5 |
| 41462.166666666664 | 19.5 |
| 41462.333333333336 | 19.5 |
| 41462.5 | 19.5 |
| 41462.666666666664 | 19.5 |
| 41462.833333333336 | 20 |
| 41463.0 | 20 |
| 41463.166666666664 | 20 |
| 41463.333333333336 | 20.5 |
| 41463.5 | 20.5 |
| 41463.666666666664 | 20.5 |
| 41463.833333333336 | 20.5 |
| 41464.0 | 20.5 |
| 41464.166666666664 | 21 |
| 41464.333333333336 | 21 |
| 41464.5 | 21 |
| 41464.666666666664 | 21 |
| 41464.833333333336 | 21 |
| 41465.0 | 21.5 |
| 41465.166666666664 | 21.5 |
| 41465.333333333336 | 21.5 |
| 41465.5 | 21.5 |
| 41465.666666666664 | 21.5 |
| 41465.833333333336 | 21.5 |
| 41466.0 | 22 |
| 41466.166666666664 | 22 |
| 41466.333333333336 | 22 |
| 41466.5 | 22 |
| 41466.666666666664 | 22 |
| 41466.833333333336 | 22 |
| 41467.0 | 22.5 |
| 41467.166666666664 | 22.5 |
| 41467.333333333336 | 22.5 |
| 41467.5 | 22 |
| 41467.666666666664 | 22 |
| 41467.833333333336 | 22 |
| 41468.0 | 22 |
| 41468.166666666664 | 22 |
| 41468.333333333336 | 22 |
| 41468.5 | 21.5 |
| 41468.666666666664 | 21.5 |
| 41468.833333333336 | 21.5 |
| 41469.0 | 21.5 |
| 41469.166666666664 | 21.5 |
| 41469.333333333336 | 21.5 |
| 41469.5 | 21 |
| 41469.666666666664 | 21 |
| 41469.833333333336 | 21.5 |
| 41470.0 | 21.5 |
| 41470.166666666664 | 22 |
| 41470.333333333336 | 21.5 |
| 41470.5 | 21.5 |
| 41470.666666666664 | 21.5 |
| 41470.833333333336 | 22 |
| 41471.0 | 22.5 |
| 41471.166666666664 | 22.5 |
| 41471.333333333336 | 22.5 |
| 41471.5 | 22 |
| 41471.666666666664 | 22 |
| 41471.833333333336 | 22.5 |
| 41472.0 | 23 |
| 41472.166666666664 | 23 |
| 41472.333333333336 | 22.5 |
| 41472.5 | 22.5 |
| 41472.666666666664 | 22.5 |
| 41472.833333333336 | 22.5 |
| 41473.0 | 23 |
| 41473.166666666664 | 23 |
| 41473.333333333336 | 23 |
| 41473.5 | 23 |
| 41473.666666666664 | 22.5 |
| 41473.833333333336 | 23 |
| 41474.0 | 23.5 |
| 41474.166666666664 | 23.5 |
| 41474.333333333336 | 23.5 |
| 41474.5 | 23 |
| 41474.666666666664 | 23 |
| 41474.833333333336 | 23.5 |
| 41475.0 | 23.5 |
| 41475.166666666664 | 23.5 |
| 41475.333333333336 | 23 |
| 41475.5 | 23 |
| 41475.666666666664 | 23 |
| 41475.833333333336 | 23 |
| 41476.0 | 23.5 |
| 41476.166666666664 | 23.5 |
| 41476.333333333336 | 23.5 |
| 41476.5 | 23 |
| 41476.666666666664 | 23 |
| 41476.833333333336 | 23 |
| 41477.0 | 23 |
| 41477.166666666664 | 23 |
| 41477.333333333336 | 23 |
| 41477.5 | 23 |
| 41477.666666666664 | 22.5 |
| 41477.833333333336 | 23 |
| 41478.0 | 23 |
| 41478.166666666664 | 23 |
| 41478.333333333336 | 23 |
| 41478.5 | 23 |
| 41478.666666666664 | 23 |
| 41478.833333333336 | 23.5 |
| 41479.0 | 24 |
| 41479.166666666664 | 24 |
| 41479.333333333336 | 24 |
| 41479.5 | 23.5 |
| 41479.666666666664 | 23.5 |
| 41479.833333333336 | 23.5 |
| 41480.0 | 23.5 |
| 41480.166666666664 | 23.5 |
| 41480.333333333336 | 23.5 |
| 41480.5 | 23 |
| 41480.666666666664 | 23 |
| 41480.833333333336 | 23 |
| 41481.0 | 23 |
| 41481.166666666664 | 23 |
| 41481.333333333336 | 23 |
| 41481.5 | 22.5 |
| 41481.666666666664 | 22.5 |
| 41481.833333333336 | 22.5 |
| 41482.0 | 22.5 |
| 41482.166666666664 | 22 |
| 41482.333333333336 | 22 |
| 41482.5 | 21.5 |
| 41482.666666666664 | 21.5 |
| 41482.833333333336 | 22 |
| 41483.0 | 22.5 |
| 41483.166666666664 | 22.5 |
| 41483.333333333336 | 22 |
| 41483.5 | 22 |
| 41483.666666666664 | 21.5 |
| 41483.833333333336 | 21.5 |
| 41484.0 | 21.5 |
| 41484.166666666664 | 21.5 |
| 41484.333333333336 | 21.5 |
| 41484.5 | 21 |
| 41484.666666666664 | 21 |
| 41484.833333333336 | 21.5 |
| 41485.0 | 22 |
| 41485.166666666664 | 22 |
| 41485.333333333336 | 22 |
| 41485.5 | 22 |
| 41485.666666666664 | 22 |
| 41485.833333333336 | 22 |
| 41486.0 | 22 |
| 41486.166666666664 | 22 |
| 41486.333333333336 | 22 |
| 41486.5 | 22 |
| 41486.666666666664 | 22 |
| 41486.833333333336 | 22.5 |
| 41487.0 | 22.5 |
| 41487.166666666664 | 22.5 |
| 41487.333333333336 | 22.5 |
| 41487.5 | 22.5 |
| 41487.666666666664 | 22.5 |
| 41487.833333333336 | 22.5 |
| 41488.0 | 22.5 |
| 41488.166666666664 | 22.5 |
| 41488.333333333336 | 22.5 |
| 41488.5 | 22.5 |
| 41488.666666666664 | 22.5 |
| 41488.833333333336 | 22.5 |
| 41489.0 | 22.5 |
| 41489.166666666664 | 22.5 |
| 41489.333333333336 | 23 |
| 41489.5 | 22.5 |
| 41489.666666666664 | 22.5 |
| 41489.833333333336 | 22.5 |
| 41490.0 | 22.5 |
| 41490.166666666664 | 22 |
| 41490.333333333336 | 22 |
| 41490.5 | 22 |
| 41490.666666666664 | 22 |
| 41490.833333333336 | 22 |
| 41491.0 | 22 |
| 41491.166666666664 | 22 |
| 41491.333333333336 | 22 |
| 41491.5 | 22 |
| 41491.666666666664 | 22 |
| 41491.833333333336 | 22 |
| 41492.0 | 22 |
| 41492.166666666664 | 22 |
| 41492.333333333336 | 22 |
| 41492.5 | 22 |
| 41492.666666666664 | 22 |
| 41492.833333333336 | 22 |
| 41493.0 | 22 |
| 41493.166666666664 | 22 |
| 41493.333333333336 | 22 |
| 41493.5 | 22 |
| 41493.666666666664 | 22 |
| 41493.833333333336 | 22 |
| 41494.0 | 22 |
| 41494.166666666664 | 22 |
| 41494.333333333336 | 22 |
| 41494.5 | 22 |
| 41494.666666666664 | 22 |
| 41494.833333333336 | 22 |
| 41495.0 | 22 |
| 41495.166666666664 | 21.5 |
| 41495.333333333336 | 21.5 |
| 41495.5 | 21.5 |
| 41495.666666666664 | 21.5 |
| 41495.833333333336 | 21.5 |
| 41496.0 | 21.5 |
| 41496.166666666664 | 21.5 |
| 41496.333333333336 | 21.5 |
| 41496.5 | 21.5 |
| 41496.666666666664 | 21.5 |
| 41496.833333333336 | 21.5 |
| 41550.5 | 19.5 |
| 41550.666666666664 | 19.5 |
| 41550.833333333336 | 19.5 |
| 41551.0 | 19.5 |
| 41551.166666666664 | 19.5 |
| 41551.333333333336 | 19.5 |
| 41551.5 | 19.5 |
| 41551.666666666664 | 20 |
| 41551.833333333336 | 20 |
| 41552.0 | 20 |
| 41552.166666666664 | 20 |
| 41552.333333333336 | 20 |
| 41552.5 | 20 |
| 41552.666666666664 | 19.5 |
| 41552.833333333336 | 18.5 |
| 41553.0 | 17.5 |
| 41553.166666666664 | 16.5 |
| 41553.333333333336 | 15.5 |
| 41553.5 | 15 |
| 41553.666666666664 | 15 |
| 41553.833333333336 | 15.5 |
| 41554.0 | 15 |
| 41554.166666666664 | 14.5 |
| 41554.333333333336 | 14 |
| 41554.5 | 13.5 |
| 41554.666666666664 | 14 |
| 41554.833333333336 | 14.5 |
| 41555.0 | 14.5 |
| 41555.166666666664 | 14.5 |
| 41555.333333333336 | 14 |
| 41555.5 | 14 |
| 41555.666666666664 | 14.5 |
| 41555.833333333336 | 14.5 |
| 41556.0 | 14.5 |
| 41556.166666666664 | 14.5 |
| 41556.333333333336 | 14 |
| 41556.5 | 14 |
| 41556.666666666664 | 14 |
| 41556.833333333336 | 14.5 |
| 41557.0 | 14.5 |
| 41557.166666666664 | 14.5 |
| 41557.333333333336 | 14.5 |
| 41557.5 | 14.5 |
| 41557.666666666664 | 14.5 |
| 41557.833333333336 | 15 |
| 41558.0 | 15 |
| 41558.166666666664 | 15 |
| 41558.333333333336 | 15 |
| 41558.5 | 15 |
| 41558.666666666664 | 15 |
| 41558.833333333336 | 15.5 |
| 41559.0 | 15.5 |
| 41559.166666666664 | 15.5 |
| 41559.333333333336 | 16 |
| 41559.5 | 16 |
| 41559.666666666664 | 16 |
| 41559.833333333336 | 16 |
| 41560.0 | 16.5 |
| 41560.166666666664 | 16.5 |
| 41560.333333333336 | 16 |
| 41560.5 | 16 |
| 41560.666666666664 | 16 |
| 41560.833333333336 | 16 |
| 41561.0 | 16 |
| 41561.166666666664 | 15.5 |
| 41561.333333333336 | 15.5 |
| 41561.5 | 15 |
| 41561.666666666664 | 15.5 |
| 41561.833333333336 | 15.5 |
| 41562.0 | 15.5 |
| 41562.166666666664 | 15.5 |
| 41562.333333333336 | 15.5 |
| 41562.5 | 16 |
| 41562.666666666664 | 16 |
| 41562.833333333336 | 16 |
| 41563.0 | 16 |
| 41563.166666666664 | 15.5 |
| 41563.333333333336 | 15 |
| 41563.5 | 14.5 |
| 41563.666666666664 | 14.5 |
| 41563.833333333336 | 14.5 |
| 41564.0 | 14.5 |
| 41564.166666666664 | 14 |
| 41564.333333333336 | 13 |
| 41564.5 | 13 |
| 41564.666666666664 | 13 |
| 41564.833333333336 | 13.5 |
| 41565.0 | 13 |
| 41565.166666666664 | 12.5 |
| 41565.333333333336 | 12.5 |
| 41565.5 | 12 |
| 41565.666666666664 | 12.5 |
| 41565.833333333336 | 12.5 |
| 41566.0 | 13 |
| 41566.166666666664 | 12.5 |
| 41566.333333333336 | 12 |
| 41566.5 | 11.5 |
| 41566.666666666664 | 11.5 |
| 41566.833333333336 | 12 |
| 41567.0 | 11.5 |
| 41567.166666666664 | 11 |
| 41567.333333333336 | 10.5 |
| 41567.5 | 10.5 |
| 41567.666666666664 | 11 |
| 41567.833333333336 | 11 |
| 41568.0 | 11.5 |
| 41568.166666666664 | 11.5 |
| 41568.333333333336 | 11.5 |
| 41568.5 | 11.5 |
| 41568.666666666664 | 11.5 |
| 41568.833333333336 | 12 |
| 41569.0 | 11.5 |
| 41569.166666666664 | 11 |
| 41569.333333333336 | 11 |
| 41569.5 | 10.5 |
| 41569.666666666664 | 11 |
| 41569.833333333336 | 11 |
| 41570.0 | 11.5 |
| 41570.166666666664 | 11 |
| 41570.333333333336 | 10.5 |
| 41570.5 | 10 |
| 41570.666666666664 | 10.5 |
| 41570.833333333336 | 11 |
| 41571.0 | 10.5 |
| 41571.166666666664 | 10.5 |
| 41571.333333333336 | 10 |
| 41571.5 | 9.5 |
| 41571.666666666664 | 10.5 |
| 41571.833333333336 | 10.5 |
| 41572.0 | 9.5 |
| 41572.166666666664 | 9 |
| 41572.333333333336 | 8.5 |
| 41572.5 | 8 |
| 41572.666666666664 | 9 |
| 41572.833333333336 | 9 |
| 41573.0 | 9 |
| 41573.166666666664 | 8.5 |
| 41573.333333333336 | 8 |
| 41573.5 | 8.5 |
| 41573.666666666664 | 9 |
| 41573.833333333336 | 9.5 |
| 41574.0 | 9.5 |
| 41574.166666666664 | 10 |
| 41574.333333333336 | 9.5 |
| 41574.5 | 9.5 |
| 41574.666666666664 | 10 |
| 41574.833333333336 | 10.5 |
| 41575.0 | 10.5 |
| 41575.166666666664 | 10.5 |
| 41575.333333333336 | 10 |
| 41575.5 | 10.5 |
| 41575.666666666664 | 11 |
| 41575.833333333336 | 11 |
| 41576.0 | 11.5 |
| 41576.166666666664 | 11 |
| 41576.333333333336 | 11.5 |
| 41576.5 | 11.5 |
| 41576.666666666664 | 12 |
| 41576.833333333336 | 12 |
| 41577.0 | 12 |
| 41577.166666666664 | 12.5 |
| 41577.333333333336 | 12.5 |
| 41577.5 | 13 |
| 41577.666666666664 | 13 |
| 41577.833333333336 | 13 |
| 41578.0 | 13.5 |
| 41578.166666666664 | 13.5 |
| 41578.333333333336 | 13.5 |
| 41578.5 | 14 |
| 41578.666666666664 | 14 |
| 41578.833333333336 | 14 |
| 41579.0 | 14 |
| 41579.166666666664 | 13.5 |
| 41579.333333333336 | 13 |
| 41579.5 | 13 |
| 41579.666666666664 | 13 |
| 41579.833333333336 | 13 |
| 41580.0 | 13 |
| 41580.166666666664 | 12.5 |
| 41580.333333333336 | 11.5 |
| 41580.5 | 11.5 |
| 41580.666666666664 | 11.5 |
| 41580.833333333336 | 11.5 |
| 41581.0 | 11 |
| 41581.125 | 10.5 |
| 41581.291666666664 | 10 |
| 41581.458333333336 | 10 |
| 41581.625 | 10.5 |
| 41581.791666666664 | 10.5 |
| 41581.958333333336 | 10.5 |
| 41582.125 | 10.5 |
| 41582.291666666664 | 10 |
| 41582.458333333336 | 10.5 |
| 41582.625 | 10.5 |
| 41582.791666666664 | 10.5 |
| 41582.958333333336 | 11 |
| 41583.125 | 11 |
| 41583.291666666664 | 11 |
| 41583.458333333336 | 11 |
| 41583.625 | 11.5 |
| 41583.791666666664 | 11.5 |
| 41583.958333333336 | 11.5 |
| 41584.125 | 11.5 |
| 41584.291666666664 | 12 |
| 41584.458333333336 | 12 |
| 41584.625 | 12 |
| 41584.791666666664 | 11.5 |
| 41584.958333333336 | 11 |
| 41585.125 | 10.5 |
| 41585.291666666664 | 9.5 |
| 41585.458333333336 | 9 |
| 41585.625 | 9 |
| 41585.791666666664 | 9.5 |
| 41585.958333333336 | 9 |
| 41586.125 | 8.5 |
| 41586.291666666664 | 8.5 |
| 41586.458333333336 | 8.5 |
| 41586.625 | 8.5 |
| 41586.791666666664 | 9 |
| 41586.958333333336 | 9 |
| 41587.125 | 8.5 |
| 41587.291666666664 | 8.5 |
| 41587.458333333336 | 8.5 |
| 41587.625 | 8.5 |
| 41587.791666666664 | 9 |
| 41587.958333333336 | 9 |
| 41588.125 | 9.5 |
| 41588.291666666664 | 9.5 |
| 41588.458333333336 | 9.5 |
| 41588.625 | 9.5 |
| 41588.791666666664 | 10 |
| 41588.958333333336 | 10 |
| 41589.125 | 9.5 |
| 41589.291666666664 | 9 |
| 41589.458333333336 | 9 |
| 41589.625 | 9.5 |
| 41589.791666666664 | 9.5 |
| 41589.958333333336 | 10 |
| 41590.125 | 10 |
| 41590.291666666664 | 9.5 |
| 41590.458333333336 | 8.5 |
| 41590.625 | 8.5 |
| 41590.791666666664 | 8 |
| 41590.958333333336 | 7 |
| 41591.125 | 6.5 |
| 41591.291666666664 | 6 |
| 41591.458333333336 | 5.5 |
| 41591.625 | 6 |
| 41591.791666666664 | 6 |
| 41591.958333333336 | 5.5 |
| 41592.125 | 5.5 |
| 41592.291666666664 | 5.5 |
| 41592.458333333336 | 5.5 |
| 41592.625 | 5.5 |
| 41592.791666666664 | 6 |
| 41592.958333333336 | 6 |
| 41593.125 | 6 |
| 41593.291666666664 | 6 |
| 41593.458333333336 | 6.5 |
| 41593.625 | 6.5 |
| 41593.791666666664 | 7 |
| 41593.958333333336 | 7.5 |
| 41594.125 | 7.5 |
| 41594.291666666664 | 8 |
| 41594.458333333336 | 8 |
| 41594.625 | 8.5 |
| 41594.791666666664 | 8.5 |
| 41594.958333333336 | 9 |
| 41595.125 | 9 |
| 41595.291666666664 | 9.5 |
| 41595.458333333336 | 9.5 |
| 41595.625 | 10 |
| 41595.791666666664 | 10.5 |
| 41595.958333333336 | 11 |
| 41596.125 | 10.5 |
| 41596.291666666664 | 10 |
| 41596.458333333336 | 9.5 |
| 41596.625 | 9.5 |
| 41596.791666666664 | 9.5 |
| 41596.958333333336 | 9 |
| 41597.125 | 8.5 |
| 41597.291666666664 | 8 |
| 41597.458333333336 | 8 |
| 41597.625 | 8 |
| 41597.791666666664 | 8.5 |
| 41597.958333333336 | 8.5 |
| 41598.125 | 8 |
| 41598.291666666664 | 8 |
| 41598.458333333336 | 8 |
| 41598.625 | 8 |
| 41598.791666666664 | 8.5 |
| 41598.958333333336 | 8.5 |
| 41599.125 | 9 |
| 41599.291666666664 | 9 |
| 41599.458333333336 | 9 |
| 41599.625 | 9 |
| 41599.791666666664 | 9 |
| 41599.958333333336 | 9.5 |
| 41600.125 | 9.5 |
| 41600.291666666664 | 9 |
| 41600.458333333336 | 8.5 |
| 41600.625 | 8.5 |
| 41600.791666666664 | 8 |
| 41600.958333333336 | 7.5 |
| 41601.125 | 7 |
| 41601.291666666664 | 7 |
| 41601.458333333336 | 6.5 |
| 41601.625 | 7 |
| 41601.791666666664 | 6.5 |
| 41601.958333333336 | 6 |
| 41602.125 | 5.5 |
| 41602.291666666664 | 5.5 |
| 41602.458333333336 | 5.5 |
| 41602.625 | 5.5 |
| 41602.791666666664 | 5.5 |
| 41602.958333333336 | 5.5 |
| 41603.125 | 5 |
| 41603.291666666664 | 5.5 |
| 41603.458333333336 | 5.5 |
| 41603.625 | 5.5 |
| 41603.791666666664 | 5.5 |
| 41603.958333333336 | 5.5 |
| 41604.125 | 5.5 |
| 41604.291666666664 | 5.5 |
| 41604.458333333336 | 5.5 |
| 41604.625 | 5.5 |
| 41604.791666666664 | 5.5 |
| 41604.958333333336 | 5.5 |
| 41605.125 | 5 |
| 41605.291666666664 | 5 |
| 41605.458333333336 | 5 |
| 41605.625 | 5 |
| 41605.791666666664 | 5 |
| 41605.958333333336 | 5 |
| 41606.125 | 5 |
| 41606.291666666664 | 5 |
| 41606.458333333336 | 5 |
| 41606.625 | 5 |
| 41606.791666666664 | 5 |
| 41606.958333333336 | 5 |
| 41607.125 | 5 |
| 41607.291666666664 | 5 |
| 41607.458333333336 | 5 |
| 41607.625 | 5 |
| 41607.791666666664 | 5 |
| 41607.958333333336 | 5 |
| 41608.125 | 5 |
| 41608.291666666664 | 5 |
| 41608.458333333336 | 5 |
| 41608.625 | 5 |
| 41608.791666666664 | 5.5 |
| 41608.958333333336 | 5.5 |
| 41609.125 | 5.5 |
| 41609.291666666664 | 5.5 |
| 41609.458333333336 | 5.5 |
| 41609.625 | 5.5 |
| 41609.791666666664 | 5.5 |
| 41609.958333333336 | 6 |
| 41610.125 | 6 |
| 41610.291666666664 | 6.5 |
| 41610.458333333336 | 6.5 |
| 41610.625 | 6.5 |
| 41610.791666666664 | 7 |
| 41610.958333333336 | 7 |
| 41611.125 | 7 |
| 41611.291666666664 | 7 |
| 41611.458333333336 | 7 |
| 41611.625 | 7 |
| 41611.791666666664 | 7.5 |
| 41611.958333333336 | 7.5 |
| 41612.125 | 7.5 |
| 41612.291666666664 | 8 |
| 41612.458333333336 | 8 |
| 41612.625 | 8 |
| 41612.791666666664 | 8.5 |
| 41612.958333333336 | 8.5 |
| 41613.125 | 8.5 |
| 41613.291666666664 | 8 |
| 41613.458333333336 | 7 |
| 41613.625 | 6.5 |
| 41613.791666666664 | 6 |
| 41613.958333333336 | 5.5 |
| 41614.125 | 5.5 |
| 41614.291666666664 | 5.5 |
| 41614.458333333336 | 5 |
| 41614.625 | 5 |
| 41614.791666666664 | 4.5 |
| 41614.958333333336 | 4.5 |
| 41615.125 | 4.5 |
| 41615.291666666664 | 4.5 |
| 41615.458333333336 | 4.5 |
| 41615.625 | 4.5 |
| 41615.791666666664 | 4.5 |
| 41615.958333333336 | 5 |
| 41616.125 | 4.5 |
| 41616.291666666664 | 4.5 |
| 41616.458333333336 | 4.5 |
| 41616.625 | 4.5 |
| 41616.791666666664 | 4.5 |
| 41616.958333333336 | 4.5 |
| 41617.125 | 4.5 |
| 41617.291666666664 | 4.5 |
| 41617.458333333336 | 4.5 |
| 41617.625 | 4.5 |
| 41617.791666666664 | 4.5 |
| 41617.958333333336 | 4.5 |
| 41618.125 | 4.5 |
| 41618.291666666664 | 4.5 |
| 41618.458333333336 | 4.5 |
| 41618.625 | 4.5 |
| 41618.791666666664 | 4.5 |
| 41618.958333333336 | 4.5 |
| 41619.125 | 4.5 |
| 41619.291666666664 | 4.5 |
| 41619.458333333336 | 4.5 |
| 41619.625 | 4.5 |
| 41619.791666666664 | 4.5 |
| 41619.958333333336 | 4.5 |
| 41620.125 | 4.5 |
| 41620.291666666664 | 4.5 |
| 41620.458333333336 | 4.5 |
| 41620.625 | 4.5 |
| 41620.791666666664 | 4.5 |
| 41620.958333333336 | 4.5 |
| 41621.125 | 4.5 |
| 41621.291666666664 | 4.5 |
| 41621.458333333336 | 4.5 |
| 41621.625 | 4.5 |
| 41621.791666666664 | 4.5 |
| 41621.958333333336 | 4.5 |
| 41622.125 | 4.5 |
| 41622.291666666664 | 4.5 |
| 41622.458333333336 | 4.5 |
| 41622.625 | 4.5 |
| 41622.791666666664 | 4.5 |
| 41622.958333333336 | 4.5 |
| 41623.125 | 4.5 |
| 41623.291666666664 | 4.5 |
| 41623.458333333336 | 4.5 |
| 41623.625 | 4.5 |
| 41623.791666666664 | 4.5 |
| 41623.958333333336 | 4.5 |
| 41624.125 | 4.5 |
| 41624.291666666664 | 4.5 |
| 41624.458333333336 | 4.5 |
| 41624.625 | 4.5 |
| 41624.791666666664 | 4.5 |
| 41624.958333333336 | 5 |
| 41625.125 | 4.5 |
| 41625.291666666664 | 4.5 |
| 41625.458333333336 | 4.5 |
| 41625.625 | 5 |
| 41625.791666666664 | 5 |
| 41625.958333333336 | 5 |
| 41626.125 | 5 |
| 41626.291666666664 | 5 |
| 41626.458333333336 | 5 |
| 41626.625 | 5 |
| 41626.791666666664 | 5 |
| 41626.958333333336 | 5 |
| 41627.125 | 5 |
| 41627.291666666664 | 5 |
| 41627.458333333336 | 5 |
| 41627.625 | 5 |
| 41627.791666666664 | 5 |
| 41627.958333333336 | 5 |
| 41628.125 | 5 |
| 41628.291666666664 | 5 |
| 41628.458333333336 | 5 |
| 41628.625 | 5 |
| 41628.791666666664 | 5 |
| 41628.958333333336 | 5 |
| 41629.125 | 5 |
| 41629.291666666664 | 5 |
| 41629.458333333336 | 5 |
| 41629.625 | 5 |
| 41629.791666666664 | 5 |
| 41629.958333333336 | 5 |
| 41630.125 | 5 |
| 41630.291666666664 | 5 |
| 41630.458333333336 | 5 |
| 41630.625 | 5 |
| 41630.791666666664 | 5 |
| 41630.958333333336 | 5 |
| 41631.125 | 5 |
| 41631.291666666664 | 5.5 |
| 41631.458333333336 | 5.5 |
| 41631.625 | 5.5 |
| 41631.791666666664 | 5.5 |
| 41631.958333333336 | 5.5 |
| 41632.125 | 5.5 |
| 41632.291666666664 | 5.5 |
| 41632.458333333336 | 5.5 |
| 41632.625 | 5.5 |
| 41632.791666666664 | 6 |
| 41632.958333333336 | 6 |
| 41633.125 | 6 |
| 41633.291666666664 | 6 |
| 41633.458333333336 | 6 |
| 41633.625 | 6 |
| 41633.791666666664 | 6 |
| 41633.958333333336 | 6 |
| 41634.125 | 6 |
| 41634.291666666664 | 6 |
| 41634.458333333336 | 6 |
| 41634.625 | 6 |
| 41634.791666666664 | 6 |
| 41634.958333333336 | 6 |
| 41635.125 | 6 |
| 41635.291666666664 | 6 |
| 41635.458333333336 | 6 |
| 41635.625 | 6 |
| 41635.791666666664 | 6 |
| 41635.958333333336 | 6 |
| 41636.125 | 6 |
| 41636.291666666664 | 5.5 |
| 41636.458333333336 | 5.5 |
| 41636.625 | 5.5 |
| 41636.791666666664 | 5.5 |
| 41636.958333333336 | 6 |
| 41637.125 | 5.5 |
| 41637.291666666664 | 5.5 |
| 41637.458333333336 | 5.5 |
| 41637.625 | 5.5 |
| 41637.791666666664 | 5.5 |
| 41637.958333333336 | 5.5 |
| 41638.125 | 5.5 |
| 41638.291666666664 | 5.5 |
| 41638.458333333336 | 5.5 |
| 41638.625 | 5.5 |
| 41638.791666666664 | 5.5 |
| 41638.958333333336 | 5.5 |
| 41639.125 | 5.5 |
| 41639.291666666664 | 5.5 |
| 41639.458333333336 | 5.5 |
| 41639.625 | 5.5 |
| 41639.791666666664 | 5.5 |
| 41639.958333333336 | 5.5 |
| 41640.125 | 5.5 |
| 41640.291666666664 | 5.5 |
| 41640.458333333336 | 5.5 |
| 41640.625 | 5.5 |
| 41640.791666666664 | 5.5 |
| 41640.958333333336 | 5.5 |
| 41641.125 | 5.5 |
| 41641.291666666664 | 5.5 |
| 41641.458333333336 | 5.5 |
| 41641.625 | 5.5 |
| 41641.791666666664 | 5.5 |
| 41641.958333333336 | 5.5 |
| 41642.125 | 5.5 |
| 41642.291666666664 | 5.5 |
| 41642.458333333336 | 5.5 |
| 41642.625 | 5.5 |
| 41642.791666666664 | 5.5 |
| 41642.958333333336 | 5 |
| 41643.125 | 5 |
| 41643.291666666664 | 5 |
| 41643.458333333336 | 5 |
| 41643.625 | 5 |
| 41643.791666666664 | 5.5 |
| 41643.958333333336 | 5.5 |
| 41644.125 | 5.5 |
| 41644.291666666664 | 5.5 |
| 41644.458333333336 | 5.5 |
| 41644.625 | 5.5 |
| 41644.791666666664 | 5.5 |
| 41644.958333333336 | 5.5 |
| 41645.125 | 5.5 |
| 41645.291666666664 | 5 |
| 41645.458333333336 | 5 |
| 41645.625 | 5 |
| 41645.791666666664 | 5 |
| 41645.958333333336 | 5 |
| 41646.125 | 5 |
| 41646.291666666664 | 5 |
| 41646.458333333336 | 5 |
| 41646.625 | 5 |
| 41646.791666666664 | 5 |
| 41646.958333333336 | 5 |
| 41647.125 | 5 |
| 41647.291666666664 | 5 |
| 41647.458333333336 | 5 |
| 41647.625 | 5 |
| 41647.791666666664 | 5 |
| 41647.958333333336 | 5 |
| 41648.125 | 5 |
| 41648.291666666664 | 5 |
| 41648.458333333336 | 5 |
| 41648.625 | 5 |
| 41648.791666666664 | 5 |
| 41648.958333333336 | 5 |
| 41649.125 | 5 |
| 41649.291666666664 | 5 |
| 41649.458333333336 | 5 |
| 41649.625 | 5 |
| 41649.791666666664 | 5 |
| 41649.958333333336 | 5 |
| 41650.125 | 5 |
| 41650.291666666664 | 5 |
| 41650.458333333336 | 5 |
| 41650.625 | 5 |
| 41650.791666666664 | 5 |
| 41650.958333333336 | 5 |
| 41651.125 | 5 |
| 41651.291666666664 | 5 |
| 41651.458333333336 | 5 |
| 41651.625 | 5 |
| 41651.791666666664 | 5 |
| 41651.958333333336 | 5 |
| 41652.125 | 5 |
| 41652.291666666664 | 5 |
| 41652.458333333336 | 5 |
| 41652.625 | 5 |
| 41652.791666666664 | 5 |
| 41652.958333333336 | 5 |
| 41653.125 | 5 |
| 41653.291666666664 | 5 |
| 41653.458333333336 | 5 |
| 41653.625 | 5 |
| 41653.791666666664 | 5 |
| 41653.958333333336 | 5 |
| 41654.125 | 5 |
| 41654.291666666664 | 5 |
| 41654.458333333336 | 5 |
| 41654.625 | 5 |
| 41654.791666666664 | 5 |
| 41654.958333333336 | 5 |
| 41655.125 | 5 |
| 41655.291666666664 | 5 |
| 41655.458333333336 | 5 |
| 41655.625 | 5 |
| 41655.791666666664 | 5 |
| 41655.958333333336 | 5.5 |
| 41656.125 | 5 |
| 41656.291666666664 | 5 |
| 41656.458333333336 | 5 |
| 41656.625 | 5 |
| 41656.791666666664 | 5 |
| 41656.958333333336 | 5.5 |
| 41657.125 | 5.5 |
| 41657.291666666664 | 5.5 |
| 41657.458333333336 | 5.5 |
| 41657.625 | 5.5 |
| 41657.791666666664 | 5.5 |
| 41657.958333333336 | 5 |
| 41658.125 | 5.5 |
| 41658.291666666664 | 5.5 |
| 41658.458333333336 | 5.5 |
| 41658.625 | 5.5 |
| 41658.791666666664 | 5.5 |
| 41658.958333333336 | 5.5 |
| 41659.125 | 5.5 |
| 41659.291666666664 | 5.5 |
| 41659.458333333336 | 5.5 |
| 41659.625 | 5.5 |
| 41659.791666666664 | 5.5 |
| 41659.958333333336 | 5.5 |
| 41660.125 | 5.5 |
| 41660.291666666664 | 5.5 |
| 41660.458333333336 | 5.5 |
| 41660.625 | 5.5 |
| 41660.791666666664 | 5.5 |
| 41660.958333333336 | 5.5 |
| 41661.125 | 5.5 |
| 41661.291666666664 | 5.5 |
| 41661.458333333336 | 5.5 |
| 41661.625 | 5.5 |
| 41661.791666666664 | 5.5 |
| 41661.958333333336 | 5.5 |
| 41662.125 | 5.5 |
| 41662.291666666664 | 5 |
| 41662.458333333336 | 5 |
| 41662.625 | 5 |
| 41662.791666666664 | 5.5 |
| 41662.958333333336 | 5.5 |
| 41663.125 | 5 |
| 41663.291666666664 | 5 |
| 41663.458333333336 | 5 |
| 41663.625 | 5 |
| 41663.791666666664 | 5 |
| 41663.958333333336 | 5 |
| 41664.125 | 5 |
| 41664.291666666664 | 5 |
| 41664.458333333336 | 5 |
| 41664.625 | 5 |
| 41664.791666666664 | 5 |
| 41664.958333333336 | 5 |
| 41665.125 | 5 |
| 41665.291666666664 | 5 |
| 41665.458333333336 | 5 |
| 41665.625 | 5 |
| 41665.791666666664 | 5.5 |
| 41665.958333333336 | 5.5 |
| 41666.125 | 5 |
| 41666.291666666664 | 5 |
| 41666.458333333336 | 5 |
| 41666.625 | 5 |
| 41666.791666666664 | 5 |
| 41666.958333333336 | 5 |
| 41667.125 | 5.5 |
| 41667.291666666664 | 5.5 |
| 41667.458333333336 | 5.5 |
| 41667.625 | 5.5 |
| 41667.791666666664 | 5.5 |
| 41667.958333333336 | 5.5 |
| 41668.125 | 5.5 |
| 41668.291666666664 | 5 |
| 41668.458333333336 | 5 |
| 41668.625 | 5 |
| 41668.791666666664 | 5 |
| 41668.958333333336 | 5 |
| 41669.125 | 5 |
| 41669.291666666664 | 5 |
| 41669.458333333336 | 5 |
| 41669.625 | 5 |
| 41669.791666666664 | 5 |
| 41669.958333333336 | 5 |
| 41670.125 | 5 |
| 41670.291666666664 | 5 |
| 41670.458333333336 | 5 |
| 41670.625 | 5 |
| 41670.791666666664 | 5 |
| 41670.958333333336 | 5 |
| 41671.125 | 5 |
| 41671.291666666664 | 5 |
| 41671.458333333336 | 5 |
| 41671.625 | 5 |
| 41671.791666666664 | 5 |
| 41671.958333333336 | 5 |
| 41672.125 | 5 |
| 41672.291666666664 | 5 |
| 41672.458333333336 | 5 |
| 41672.625 | 5 |
| 41672.791666666664 | 5 |
| 41672.958333333336 | 5 |
| 41673.125 | 5 |
| 41673.291666666664 | 5 |
| 41673.458333333336 | 5 |
| 41673.625 | 5 |
| 41673.791666666664 | 5 |
| 41673.958333333336 | 5 |
| 41674.125 | 5 |
| 41674.291666666664 | 5 |
| 41674.458333333336 | 5 |
| 41674.625 | 5 |
| 41674.791666666664 | 5 |
| 41674.958333333336 | 5 |
| 41675.125 | 5 |
| 41675.291666666664 | 5 |
| 41675.458333333336 | 5 |
| 41675.625 | 5 |
| 41675.791666666664 | 5 |
| 41675.958333333336 | 5 |
| 41676.125 | 5 |
| 41676.291666666664 | 5 |
| 41676.458333333336 | 5 |
| 41676.625 | 5 |
| 41676.791666666664 | 5 |
| 41676.958333333336 | 5 |
| 41677.125 | 5 |
| 41677.291666666664 | 5 |
| 41677.458333333336 | 5 |
| 41677.625 | 5 |
| 41677.791666666664 | 5 |
| 41677.958333333336 | 5 |
| 41678.125 | 5 |
| 41678.291666666664 | 5 |
| 41678.458333333336 | 5 |
| 41678.625 | 5 |
| 41678.791666666664 | 5 |
| 41678.958333333336 | 5 |
| 41679.125 | 5 |
| 41679.291666666664 | 5 |
| 41679.458333333336 | 5 |
| 41679.625 | 5 |
| 41679.791666666664 | 5 |
| 41679.958333333336 | 5 |
| 41680.125 | 5 |
| 41680.291666666664 | 5 |
| 41680.458333333336 | 5 |
| 41680.625 | 5 |
| 41680.791666666664 | 5 |
| 41680.958333333336 | 5 |
| 41681.125 | 5 |
| 41681.291666666664 | 5 |
| 41681.458333333336 | 5 |
| 41681.625 | 5 |
| 41681.791666666664 | 5 |
| 41681.958333333336 | 5 |
| 41682.125 | 5 |
| 41682.291666666664 | 5 |
| 41682.458333333336 | 5 |
| 41682.625 | 5 |
| 41682.791666666664 | 5 |
| 41682.958333333336 | 5 |
| 41683.125 | 4.5 |
| 41683.291666666664 | 4.5 |
| 41683.458333333336 | 4.5 |
| 41683.625 | 4.5 |
| 41683.791666666664 | 4.5 |
| 41683.958333333336 | 4.5 |
| 41684.125 | 4.5 |
| 41684.291666666664 | 4.5 |
| 41684.458333333336 | 4.5 |
| 41684.625 | 5 |
| 41684.791666666664 | 5 |
| 41684.958333333336 | 5 |
| 41685.125 | 5 |
| 41685.291666666664 | 5 |
| 41685.458333333336 | 5 |
| 41685.625 | 5 |
| 41685.791666666664 | 5 |
| 41685.958333333336 | 5 |
| 41686.125 | 5 |
| 41686.291666666664 | 5 |
| 41686.458333333336 | 5 |
| 41686.625 | 5 |
| 41686.791666666664 | 5 |
| 41686.958333333336 | 5 |
| 41687.125 | 5 |
| 41687.291666666664 | 5 |
| 41687.458333333336 | 5 |
| 41687.625 | 5 |
| 41687.791666666664 | 5.5 |
| 41687.958333333336 | 5.5 |
| 41688.125 | 5.5 |
| 41688.291666666664 | 5.5 |
| 41688.458333333336 | 5.5 |
| 41688.625 | 5.5 |
| 41688.791666666664 | 5.5 |
| 41688.958333333336 | 5.5 |
| 41689.125 | 5.5 |
| 41689.291666666664 | 5.5 |
| 41689.458333333336 | 5.5 |
| 41689.625 | 5.5 |
| 41689.791666666664 | 5.5 |
| 41689.958333333336 | 6 |
| 41690.125 | 6 |
| 41690.291666666664 | 6 |
| 41690.458333333336 | 6 |
| 41690.625 | 6 |
| 41690.791666666664 | 6 |
| 41690.958333333336 | 6.5 |
| 41691.125 | 6.5 |
| 41691.291666666664 | 6.5 |
| 41691.458333333336 | 6.5 |
| 41691.625 | 6.5 |
| 41691.791666666664 | 6.5 |
| 41691.958333333336 | 6.5 |
| 41692.125 | 6.5 |
| 41692.291666666664 | 6.5 |
| 41692.458333333336 | 6 |
| 41692.625 | 6 |
| 41692.791666666664 | 6.5 |
| 41692.958333333336 | 6.5 |
| 41693.125 | 6.5 |
| 41693.291666666664 | 6.5 |
| 41693.458333333336 | 6.5 |
| 41693.625 | 6.5 |
| 41693.791666666664 | 7 |
| 41693.958333333336 | 7 |
| 41694.125 | 7 |
| 41694.291666666664 | 6.5 |
| 41694.458333333336 | 6 |
| 41694.625 | 6 |
| 41694.791666666664 | 6 |
| 41694.958333333336 | 6 |
| 41695.125 | 6.5 |
| 41695.291666666664 | 6.5 |
| 41695.458333333336 | 6 |
| 41695.625 | 6 |
| 41695.791666666664 | 6.5 |
| 41695.958333333336 | 6.5 |
| 41696.125 | 6 |
| 41696.291666666664 | 6 |
| 41696.458333333336 | 5.5 |
| 41696.625 | 5.5 |
| 41696.791666666664 | 6 |
| 41696.958333333336 | 5.5 |
| 41697.125 | 5.5 |
| 41697.291666666664 | 5.5 |
| 41697.458333333336 | 5.5 |
| 41697.625 | 5.5 |
| 41697.791666666664 | 5.5 |
| 41697.958333333336 | 5.5 |
| 41698.125 | 5.5 |
| 41698.291666666664 | 5.5 |
| 41698.458333333336 | 5.5 |
| 41698.625 | 5 |
| 41698.791666666664 | 5.5 |
| 41698.958333333336 | 5.5 |
| 41699.125 | 5.5 |
| 41699.291666666664 | 5.5 |
| 41699.458333333336 | 5 |
| 41699.625 | 5.5 |
| 41699.791666666664 | 5.5 |
| 41699.958333333336 | 5.5 |
| 41700.125 | 6 |
| 41700.291666666664 | 6 |
| 41700.458333333336 | 6 |
| 41700.625 | 5.5 |
| 41700.791666666664 | 5.5 |
| 41700.958333333336 | 5.5 |
| 41701.125 | 5 |
| 41701.291666666664 | 5 |
| 41701.458333333336 | 5 |
| 41701.625 | 5 |
| 41701.791666666664 | 5 |
| 41701.958333333336 | 5 |
| 41702.125 | 5 |
| 41702.291666666664 | 5 |
| 41702.458333333336 | 5 |
| 41702.625 | 5 |
| 41702.791666666664 | 5 |
| 41702.958333333336 | 5 |
| 41703.125 | 5 |
| 41703.291666666664 | 5 |
| 41703.458333333336 | 5 |
| 41703.625 | 5 |
| 41703.791666666664 | 5 |
| 41703.958333333336 | 5 |
| 41704.125 | 5 |
| 41704.291666666664 | 5 |
| 41704.458333333336 | 5 |
| 41704.625 | 5 |
| 41704.791666666664 | 5 |
| 41704.958333333336 | 5 |
| 41705.125 | 5 |
| 41705.291666666664 | 5 |
| 41705.458333333336 | 5 |
| 41705.625 | 5.5 |
| 41705.791666666664 | 5.5 |
| 41705.958333333336 | 5.5 |
| 41706.125 | 5.5 |
| 41706.291666666664 | 5 |
| 41706.458333333336 | 5 |
| 41706.625 | 5 |
| 41706.791666666664 | 5 |
| 41706.958333333336 | 5.5 |
| 41707.166666666664 | 5.5 |
| 41707.333333333336 | 5 |
| 41707.5 | 5.5 |
| 41707.666666666664 | 5.5 |
| 41707.833333333336 | 5.5 |
| 41708.0 | 6 |
| 41708.166666666664 | 6 |
| 41708.333333333336 | 6 |
| 41708.5 | 6 |
| 41708.666666666664 | 6.5 |
| 41708.833333333336 | 6.5 |
| 41709.0 | 6.5 |
| 41709.166666666664 | 7 |
| 41709.333333333336 | 7 |
| 41709.5 | 7 |
| 41709.666666666664 | 7.5 |
| 41709.833333333336 | 7.5 |
| 41710.0 | 8 |
| 41710.166666666664 | 8 |
| 41710.333333333336 | 8 |
| 41710.5 | 8.5 |
| 41710.666666666664 | 8.5 |
| 41710.833333333336 | 9 |
| 41711.0 | 9 |
| 41711.166666666664 | 9 |
| 41711.333333333336 | 9 |
| 41711.5 | 8.5 |
| 41711.666666666664 | 8 |
| 41711.833333333336 | 8 |
| 41712.0 | 8 |
| 41712.166666666664 | 8.5 |
| 41712.333333333336 | 8.5 |
| 41712.5 | 8.5 |
| 41712.666666666664 | 8.5 |
| 41712.833333333336 | 8.5 |
| 41713.0 | 8.5 |
| 41713.166666666664 | 8.5 |
| 41713.333333333336 | 8.5 |
| 41713.5 | 8.5 |
| 41713.666666666664 | 8.5 |
| 41713.833333333336 | 9 |
| 41714.0 | 9 |
| 41714.166666666664 | 9 |
| 41714.333333333336 | 9 |
| 41714.5 | 9 |
| 41714.666666666664 | 9 |
| 41714.833333333336 | 8 |
| 41715.0 | 7.5 |
| 41715.166666666664 | 7 |
| 41715.333333333336 | 6.5 |
| 41715.5 | 6.5 |
| 41715.666666666664 | 6.5 |
| 41715.833333333336 | 6 |
| 41716.0 | 6 |
| 41716.166666666664 | 6.5 |
| 41716.333333333336 | 6.5 |
| 41716.5 | 6 |
| 41716.666666666664 | 6.5 |
| 41716.833333333336 | 6.5 |
| 41717.0 | 6.5 |
| 41717.166666666664 | 7 |
| 41717.333333333336 | 7 |
| 41717.5 | 7 |
| 41717.666666666664 | 7.5 |
| 41717.833333333336 | 7.5 |
| 41718.0 | 8 |
| 41718.166666666664 | 8 |
| 41718.333333333336 | 8 |
| 41718.5 | 8 |
| 41718.666666666664 | 8 |
| 41718.833333333336 | 8 |
| 41719.0 | 8 |
| 41719.166666666664 | 8 |
| 41719.333333333336 | 8 |
| 41719.5 | 8 |
| 41719.666666666664 | 8.5 |
| 41719.833333333336 | 8.5 |
| 41720.0 | 8.5 |
| 41720.166666666664 | 8.5 |
| 41720.333333333336 | 8.5 |
| 41720.5 | 8.5 |
| 41720.666666666664 | 9 |
| 41720.833333333336 | 9 |
| 41721.0 | 9.5 |
| 41721.166666666664 | 9.5 |
| 41721.333333333336 | 9.5 |
| 41721.5 | 9.5 |
| 41721.666666666664 | 9.5 |
| 41721.833333333336 | 9.5 |
| 41722.0 | 9.5 |
| 41722.166666666664 | 9.5 |
| 41722.333333333336 | 9 |
| 41722.5 | 8.5 |
| 41722.666666666664 | 8.5 |
| 41722.833333333336 | 8.5 |
| 41723.0 | 8.5 |
| 41723.166666666664 | 8.5 |
| 41723.333333333336 | 8 |
| 41723.5 | 8 |
| 41723.666666666664 | 8 |
| 41723.833333333336 | 8 |
| 41724.0 | 8 |
| 41724.166666666664 | 8 |
| 41724.333333333336 | 8 |
| 41724.5 | 7.5 |
| 41724.666666666664 | 7.5 |
| 41724.833333333336 | 7.5 |
| 41725.0 | 7.5 |
| 41725.166666666664 | 7.5 |
| 41725.333333333336 | 7.5 |
| 41725.5 | 7.5 |
| 41725.666666666664 | 8 |
| 41725.833333333336 | 8 |
| 41726.0 | 8 |
| 41726.166666666664 | 8 |
| 41726.333333333336 | 8 |
| 41726.5 | 8.5 |
| 41726.666666666664 | 8.5 |
| 41726.833333333336 | 8.5 |
| 41727.0 | 8.5 |
| 41727.166666666664 | 9 |
| 41727.333333333336 | 9 |
| 41727.5 | 9 |
| 41727.666666666664 | 9 |
| 41727.833333333336 | 9 |
| 41728.0 | 9 |
| 41728.166666666664 | 9 |
| 41728.333333333336 | 9 |
| 41728.5 | 9 |
| 41728.666666666664 | 9 |
| 41728.833333333336 | 9.5 |
| 41729.0 | 9.5 |
| 41729.166666666664 | 9.5 |
| 41729.333333333336 | 9.5 |
| 41729.5 | 9.5 |
| 41729.666666666664 | 9.5 |
| 41729.833333333336 | 9.5 |
| 41730.0 | 10 |
| 41730.166666666664 | 10 |
| 41730.333333333336 | 10 |
| 41730.5 | 10 |
| 41730.666666666664 | 10 |
| 41730.833333333336 | 10.5 |
| 41731.0 | 10.5 |
| 41731.166666666664 | 10.5 |
| 41731.333333333336 | 10.5 |
| 41731.5 | 10.5 |
| 41731.666666666664 | 11 |
| 41731.833333333336 | 11 |
| 41732.0 | 11 |
| 41732.166666666664 | 11 |
| 41732.333333333336 | 11 |
| 41732.5 | 11 |
| 41732.666666666664 | 11.5 |
| 41732.833333333336 | 11.5 |
| 41733.0 | 11.5 |
| 41733.166666666664 | 11.5 |
| 41733.333333333336 | 11.5 |
| 41733.5 | 12 |
| 41733.666666666664 | 12 |
| 41733.833333333336 | 12 |
| 41734.0 | 12 |
| 41734.166666666664 | 12 |
| 41734.333333333336 | 11.5 |
| 41734.5 | 10.5 |
| 41734.666666666664 | 10.5 |
| 41734.833333333336 | 11 |
| 41735.0 | 11 |
| 41735.166666666664 | 11 |
| 41735.333333333336 | 11 |
| 41735.5 | 11 |
| 41735.666666666664 | 11 |
| 41735.833333333336 | 11 |
| 41736.0 | 11 |
| 41736.166666666664 | 11 |
| 41736.333333333336 | 11 |
| 41736.5 | 10.5 |
| 41736.666666666664 | 10.5 |
| 41736.833333333336 | 10.5 |
| 41737.0 | 10.5 |
| 41737.166666666664 | 10.5 |
| 41737.333333333336 | 10.5 |
| 41737.5 | 11 |
| 41737.666666666664 | 11 |
| 41737.833333333336 | 11 |
| 41738.0 | 11 |
| 41738.166666666664 | 11 |
| 41738.333333333336 | 11 |
| 41738.5 | 10.5 |
| 41738.666666666664 | 10.5 |
| 41738.833333333336 | 11 |
| 41739.0 | 11 |
| 41739.166666666664 | 11 |
| 41739.333333333336 | 11 |
| 41739.5 | 11 |
| 41739.666666666664 | 11.5 |
| 41739.833333333336 | 11.5 |
| 41740.0 | 11.5 |
| 41740.166666666664 | 11.5 |
| 41740.333333333336 | 11.5 |
| 41740.5 | 11.5 |
| 41740.666666666664 | 12 |
| 41740.833333333336 | 12 |
| 41741.0 | 12 |
| 41741.166666666664 | 12 |
| 41741.333333333336 | 12 |
| 41741.5 | 12.5 |
| 41741.666666666664 | 12.5 |
| 41741.833333333336 | 13 |
| 41742.0 | 13 |
| 41742.166666666664 | 13 |
| 41742.333333333336 | 13 |
| 41742.5 | 13 |
| 41742.666666666664 | 13 |
| 41742.833333333336 | 13 |
| 41743.0 | 13.5 |
| 41743.166666666664 | 13.5 |
| 41743.333333333336 | 13.5 |
| 41743.5 | 13.5 |
| 41743.666666666664 | 13.5 |
| 41743.833333333336 | 13 |
| 41744.0 | 12.5 |
| 41744.166666666664 | 11.5 |
| 41744.333333333336 | 11 |
| 41744.5 | 10.5 |
| 41744.666666666664 | 10.5 |
| 41744.833333333336 | 10.5 |
| 41745.0 | 10.5 |
| 41745.166666666664 | 10.5 |
| 41745.333333333336 | 10.5 |
| 41745.5 | 10.5 |
| 41745.666666666664 | 10.5 |
| 41745.833333333336 | 10.5 |
| 41746.0 | 10.5 |
| 41746.166666666664 | 10.5 |
| 41746.333333333336 | 11 |
| 41746.5 | 10.5 |
| 41746.666666666664 | 11 |
| 41746.833333333336 | 11 |
| 41747.0 | 11 |
| 41747.166666666664 | 11 |
| 41747.333333333336 | 11 |
| 41747.5 | 11 |
| 41747.666666666664 | 11.5 |
| 41747.833333333336 | 11.5 |
| 41748.0 | 12 |
| 41748.166666666664 | 12 |
| 41748.333333333336 | 12 |
| 41748.5 | 12 |
| 41748.666666666664 | 12.5 |
| 41748.833333333336 | 12.5 |
| 41749.0 | 12.5 |
| 41749.166666666664 | 12.5 |
| 41749.333333333336 | 12.5 |
| 41749.5 | 13 |
| 41749.666666666664 | 13 |
| 41749.833333333336 | 13.5 |
| 41750.0 | 13.5 |
| 41750.166666666664 | 13.5 |
| 41750.333333333336 | 13.5 |
| 41750.5 | 13.5 |
| 41750.666666666664 | 13.5 |
| 41750.833333333336 | 13.5 |
| 41751.0 | 13.5 |
| 41751.166666666664 | 14 |
| 41751.333333333336 | 14 |
| 41751.5 | 14 |
| 41751.666666666664 | 14.5 |
| 41751.833333333336 | 14.5 |
| 41752.0 | 14.5 |
| 41752.166666666664 | 14.5 |
| 41752.333333333336 | 14.5 |
| 41752.5 | 14.5 |
| 41752.666666666664 | 14.5 |
| 41752.833333333336 | 14.5 |
| 41753.0 | 14.5 |
| 41753.166666666664 | 14.5 |
| 41753.333333333336 | 14.5 |
| 41753.5 | 14.5 |
| 41753.666666666664 | 14.5 |
| 41753.833333333336 | 15 |
| 41754.0 | 15 |
| 41754.166666666664 | 14.5 |
| 41754.333333333336 | 14.5 |
| 41754.5 | 14.5 |
| 41754.666666666664 | 14.5 |
| 41754.833333333336 | 14.5 |
| 41755.0 | 14.5 |
| 41755.166666666664 | 14.5 |
| 41755.333333333336 | 14.5 |
| 41755.5 | 14.5 |
| 41755.666666666664 | 15 |
| 41755.833333333336 | 15 |
| 41756.0 | 15 |
| 41756.166666666664 | 15 |
| 41756.333333333336 | 15 |
| 41756.5 | 15 |
| 41756.666666666664 | 15 |
| 41756.833333333336 | 15 |
| 41757.0 | 15 |
| 41757.166666666664 | 15 |
| 41757.333333333336 | 15 |
| 41757.5 | 15 |
| 41757.666666666664 | 15 |
| 41757.833333333336 | 15 |
| 41758.0 | 15 |
| 41758.166666666664 | 15 |
| 41758.333333333336 | 15.5 |
| 41758.5 | 15 |
| 41758.666666666664 | 15 |
| 41758.833333333336 | 15 |
| 41759.0 | 15 |
| 41759.166666666664 | 14.5 |
| 41759.333333333336 | 14 |
| 41759.5 | 14 |
| 41759.666666666664 | 14 |
| 41759.833333333336 | 13.5 |
| 41760.0 | 13.5 |
| 41760.166666666664 | 13.5 |
| 41760.333333333336 | 13 |
| 41760.5 | 12.5 |
| 41760.666666666664 | 12.5 |
| 41760.833333333336 | 12.5 |
| 41761.0 | 12.5 |
| 41761.166666666664 | 12.5 |
| 41761.333333333336 | 12.5 |
| 41761.5 | 12.5 |
| 41761.666666666664 | 12.5 |
| 41761.833333333336 | 12.5 |
| 41762.0 | 12.5 |
| 41762.166666666664 | 12.5 |
| 41762.333333333336 | 13 |
| 41762.5 | 13 |
| 41762.666666666664 | 13 |
| 41762.833333333336 | 13 |
| 41763.0 | 13 |
| 41763.166666666664 | 13 |
| 41763.333333333336 | 13 |
| 41763.5 | 13.5 |
| 41763.666666666664 | 13.5 |
| 41763.833333333336 | 14 |
| 41764.0 | 14 |
| 41764.166666666664 | 14 |
| 41764.333333333336 | 14 |
| 41764.5 | 14 |
| 41764.666666666664 | 14.5 |
| 41764.833333333336 | 15 |
| 41765.0 | 15 |
| 41765.166666666664 | 15 |
| 41765.333333333336 | 15 |
| 41765.5 | 15 |
| 41765.666666666664 | 15.5 |
| 41765.833333333336 | 15.5 |
| 41766.0 | 15.5 |
| 41766.166666666664 | 15.5 |
| 41766.333333333336 | 16 |
| 41766.5 | 16 |
| 41766.666666666664 | 16 |
| 41766.833333333336 | 16.5 |
| 41767.0 | 16.5 |
| 41767.166666666664 | 16.5 |
| 41767.333333333336 | 16.5 |
| 41767.5 | 16.5 |
| 41767.666666666664 | 16.5 |
| 41767.833333333336 | 16.5 |
| 41768.0 | 16.5 |
| 41768.166666666664 | 16.5 |
| 41768.333333333336 | 16.5 |
| 41768.5 | 16.5 |
| 41768.666666666664 | 17 |
| 41768.833333333336 | 17 |
| 41769.0 | 17 |
| 41769.166666666664 | 17 |
| 41769.333333333336 | 16.5 |
| 41769.5 | 16.5 |
| 41769.666666666664 | 17 |
| 41769.833333333336 | 17 |
| 41770.0 | 17 |
| 41770.166666666664 | 17 |
| 41770.333333333336 | 17 |
| 41770.5 | 17 |
| 41770.666666666664 | 17 |
| 41770.833333333336 | 17 |
| 41771.0 | 17 |
| 41771.166666666664 | 17 |
| 41771.333333333336 | 17 |
| 41771.5 | 17 |
| 41771.666666666664 | 17.5 |
| 41771.833333333336 | 17.5 |
| 41772.0 | 17.5 |
| 41772.166666666664 | 17.5 |
| 41772.333333333336 | 17.5 |
| 41772.5 | 17.5 |
| 41772.666666666664 | 17.5 |
| 41772.833333333336 | 17.5 |
| 41773.0 | 17 |
| 41773.166666666664 | 16.5 |
| 41773.333333333336 | 16 |
| 41773.5 | 15.5 |
| 41773.666666666664 | 15 |
| 41773.833333333336 | 15 |
| 41774.0 | 14.5 |
| 41774.166666666664 | 14 |
| 41774.333333333336 | 13.5 |
| 41774.5 | 13 |
| 41774.666666666664 | 13 |
| 41774.833333333336 | 13 |
| 41775.0 | 13 |
| 41775.166666666664 | 13 |
| 41775.333333333336 | 13 |
| 41775.5 | 13 |
| 41775.666666666664 | 13 |
| 41775.833333333336 | 13 |
| 41776.0 | 13 |
| 41776.166666666664 | 13 |
| 41776.333333333336 | 13 |
| 41776.5 | 13 |
| 41776.666666666664 | 13 |
| 41776.833333333336 | 13 |
| 41777.0 | 13.5 |
| 41777.166666666664 | 13.5 |
| 41777.333333333336 | 13.5 |
| 41777.5 | 13.5 |
| 41777.666666666664 | 13.5 |
| 41777.833333333336 | 13.5 |
| 41778.0 | 13.5 |
| 41778.166666666664 | 13.5 |
| 41778.333333333336 | 13.5 |
| 41778.5 | 14 |
| 41778.666666666664 | 14 |
| 41778.833333333336 | 14.5 |
| 41779.0 | 14.5 |
| 41779.166666666664 | 14.5 |
| 41779.333333333336 | 14.5 |
| 41779.5 | 14.5 |
| 41779.666666666664 | 15 |
| 41779.833333333336 | 15 |
| 41780.0 | 15 |
| 41780.166666666664 | 15.5 |
| 41780.333333333336 | 15.5 |
| 41780.5 | 15.5 |
| 41780.666666666664 | 15.5 |
| 41780.833333333336 | 16 |
| 41781.0 | 16 |
| 41781.166666666664 | 16 |
| 41781.333333333336 | 16 |
| 41781.5 | 16 |
| 41781.666666666664 | 16.5 |
| 41781.833333333336 | 16.5 |
| 41782.0 | 16.5 |
| 41782.166666666664 | 16.5 |
| 41782.333333333336 | 16.5 |
| 41782.5 | 17 |
| 41782.666666666664 | 17 |
| 41782.833333333336 | 17 |
| 41783.0 | 17 |
| 41783.166666666664 | 17 |
| 41783.333333333336 | 17 |
| 41783.5 | 17 |
| 41783.666666666664 | 17.5 |
| 41783.833333333336 | 17.5 |
| 41784.0 | 17.5 |
| 41784.166666666664 | 17.5 |
| 41784.333333333336 | 17.5 |
| 41784.5 | 17.5 |
| 41784.666666666664 | 17.5 |
| 41784.833333333336 | 17.5 |
| 41785.0 | 17.5 |
| 41785.166666666664 | 17.5 |
| 41785.333333333336 | 17.5 |
| 41785.5 | 18 |
| 41785.666666666664 | 18 |
| 41785.833333333336 | 18 |
| 41786.0 | 18 |
| 41786.166666666664 | 18 |
| 41786.333333333336 | 18 |
| 41786.5 | 18 |
| 41786.666666666664 | 18 |
| 41786.833333333336 | 18 |
| 41787.0 | 18 |
| 41787.166666666664 | 18 |
| 41787.333333333336 | 18 |
| 41787.5 | 18 |
| 41787.666666666664 | 18 |
| 41787.833333333336 | 18 |
| 41788.0 | 18 |
| 41788.166666666664 | 17.5 |
| 41788.333333333336 | 17.5 |
| 41788.5 | 17.5 |
| 41788.666666666664 | 17.5 |
| 41788.833333333336 | 17.5 |
| 41789.0 | 17.5 |
| 41789.166666666664 | 17.5 |
| 41789.333333333336 | 17.5 |
| 41789.5 | 17.5 |
| 41789.666666666664 | 17.5 |
| 41789.833333333336 | 17.5 |
| 41790.0 | 17.5 |
| 41790.166666666664 | 17.5 |
| 41790.333333333336 | 17.5 |
| 41790.5 | 17.5 |
| 41790.666666666664 | 17.5 |
| 41790.833333333336 | 17.5 |
| 41791.0 | 17.5 |
| 41791.166666666664 | 17.5 |
| 41791.333333333336 | 17.5 |
| 41791.5 | 17.5 |
| 41791.666666666664 | 17.5 |
| 41791.833333333336 | 17.5 |
| 41792.0 | 17.5 |
| 41792.166666666664 | 17.5 |
| 41792.333333333336 | 17.5 |
| 41792.5 | 17.5 |
| 41792.666666666664 | 17.5 |
| 41792.833333333336 | 17.5 |
| 41793.0 | 17.5 |
| 41793.166666666664 | 17.5 |
| 41793.333333333336 | 17.5 |
| 41793.5 | 17.5 |
| 41793.666666666664 | 17.5 |
| 41793.833333333336 | 17.5 |
| 41794.0 | 17.5 |
| 41794.166666666664 | 17.5 |
| 41794.333333333336 | 17.5 |
| 41794.5 | 17.5 |
| 41794.666666666664 | 17.5 |
| 41794.833333333336 | 17.5 |
| 41795.0 | 17.5 |
| 41795.166666666664 | 18 |
| 41795.333333333336 | 18 |
| 41795.5 | 18 |
| 41795.666666666664 | 18 |
| 41795.833333333336 | 18 |
| 41796.0 | 18 |
| 41796.166666666664 | 18 |
| 41796.333333333336 | 18 |
| 41796.5 | 18 |
| 41796.666666666664 | 18 |
| 41796.833333333336 | 18 |
| 41797.0 | 18 |
| 41797.166666666664 | 18 |
| 41797.333333333336 | 18 |
| 41797.5 | 18 |
| 41797.666666666664 | 18 |
| 41797.833333333336 | 18 |
| 41798.0 | 18 |
| 41798.166666666664 | 18 |
| 41798.333333333336 | 18 |
| 41798.5 | 18 |
| 41798.666666666664 | 18 |
| 41798.833333333336 | 18 |
| 41799.0 | 18 |
| 41799.166666666664 | 18 |
| 41799.333333333336 | 18 |
| 41799.5 | 18 |
| 41799.666666666664 | 18 |
| 41799.833333333336 | 18 |
| 41800.0 | 18 |
| 41800.166666666664 | 17.5 |
| 41800.333333333336 | 17.5 |
| 41800.5 | 17.5 |
| 41800.666666666664 | 17.5 |
| 41800.833333333336 | 17.5 |
| 41801.0 | 17.5 |
| 41801.166666666664 | 17.5 |
| 41801.333333333336 | 17.5 |
| 41801.5 | 17.5 |
| 41801.666666666664 | 17.5 |
| 41801.833333333336 | 17.5 |
| 41802.0 | 17.5 |
| 41802.166666666664 | 17.5 |
| 41802.333333333336 | 17.5 |
| 41802.5 | 17.5 |
| 41802.666666666664 | 17.5 |
| 41802.833333333336 | 17.5 |
| 41803.0 | 17.5 |
| 41803.166666666664 | 17.5 |
| 41803.333333333336 | 17.5 |
| 41803.5 | 17.5 |
| 41803.666666666664 | 17.5 |
| 41803.833333333336 | 17.5 |
| 41804.0 | 17.5 |
| 41804.166666666664 | 17.5 |
| 41804.333333333336 | 17.5 |
| 41804.5 | 17.5 |
| 41804.666666666664 | 17.5 |
| 41804.833333333336 | 17.5 |
| 41805.0 | 17.5 |
| 41805.166666666664 | 17.5 |
| 41805.333333333336 | 17.5 |
| 41805.5 | 17.5 |
| 41805.666666666664 | 17.5 |
| 41805.833333333336 | 17.5 |
| 41806.0 | 17.5 |
| 41806.166666666664 | 17.5 |
| 41806.333333333336 | 17.5 |
| 41806.5 | 17.5 |
| 41806.666666666664 | 17.5 |
| 41806.833333333336 | 17.5 |
| 41807.0 | 17.5 |
| 41807.166666666664 | 17.5 |
| 41807.333333333336 | 17.5 |
| 41807.5 | 17.5 |
| 41807.666666666664 | 17.5 |
| 41807.833333333336 | 17.5 |
| 41808.0 | 17.5 |
| 41808.166666666664 | 17.5 |
| 41808.333333333336 | 17.5 |
| 41808.5 | 17.5 |
| 41808.666666666664 | 17.5 |
| 41808.833333333336 | 17.5 |
| 41809.0 | 17.5 |
| 41809.166666666664 | 17.5 |
| 41809.333333333336 | 17.5 |
| 41809.5 | 17.5 |
| 41809.666666666664 | 17.5 |
| 41809.833333333336 | 17.5 |
| 41810.0 | 18 |
| 41810.166666666664 | 18 |
| 41810.333333333336 | 18 |
| 41810.5 | 18 |
| 41810.666666666664 | 18 |
| 41810.833333333336 | 18 |
| 41811.0 | 18 |
| 41811.166666666664 | 18 |
| 41811.333333333336 | 18 |
| 41811.5 | 18 |
| 41811.666666666664 | 18 |
| 41811.833333333336 | 18 |
| 41812.0 | 18 |
| 41812.166666666664 | 18 |
| 41812.333333333336 | 18 |
| 41812.5 | 18 |
| 41812.666666666664 | 18.5 |
| 41812.833333333336 | 18.5 |
| 41813.0 | 18.5 |
| 41813.166666666664 | 18.5 |
| 41813.333333333336 | 18.5 |
| 41813.5 | 18.5 |
| 41813.666666666664 | 18.5 |
| 41813.833333333336 | 18.5 |
| 41814.0 | 18.5 |
| 41814.166666666664 | 18.5 |
| 41814.333333333336 | 18.5 |
| 41814.5 | 18.5 |
| 41814.666666666664 | 18.5 |
| 41814.833333333336 | 18.5 |
| 41815.0 | 18.5 |
| 41815.166666666664 | 18.5 |
| 41815.333333333336 | 18.5 |
| 41815.5 | 18.5 |
| 41815.666666666664 | 18.5 |
| 41815.833333333336 | 18.5 |
| 41816.0 | 18.5 |
| 41816.166666666664 | 18.5 |
| 41816.333333333336 | 18.5 |
| 41816.5 | 18.5 |
| 41816.666666666664 | 18.5 |
| 41816.833333333336 | 18.5 |
| 41817.0 | 18.5 |
| 41817.166666666664 | 18.5 |
| 41817.333333333336 | 18.5 |
| 41817.5 | 18.5 |
| 41817.666666666664 | 18.5 |
| 41817.833333333336 | 18.5 |
| 41818.0 | 18.5 |
| 41818.166666666664 | 18.5 |
| 41818.333333333336 | 18.5 |
| 41818.5 | 18.5 |
| 41818.666666666664 | 18.5 |
| 41818.833333333336 | 18.5 |
| 41819.0 | 18.5 |
| 41819.166666666664 | 18.5 |
| 41819.333333333336 | 18.5 |
| 41819.5 | 18.5 |
| 41819.666666666664 | 18.5 |
| 41819.833333333336 | 18.5 |
| 41820.0 | 18.5 |
| 41820.166666666664 | 18.5 |
| 41820.333333333336 | 18.5 |
| 41820.5 | 18.5 |
| 41820.666666666664 | 18.5 |
| 41820.833333333336 | 19 |
| 41821.0 | 19 |
| 41821.166666666664 | 19 |
| 41821.333333333336 | 19 |
| 41821.5 | 19 |
| 41821.666666666664 | 19 |
| 41821.833333333336 | 19 |
| 41822.0 | 19 |
| 41822.166666666664 | 19 |
| 41822.333333333336 | 19 |
| 41822.5 | 19 |
| 41822.666666666664 | 19 |
| 41822.833333333336 | 19 |
| 41823.0 | 19 |
| 41823.166666666664 | 19 |
| 41823.333333333336 | 19 |
| 41823.5 | 19 |
| 41823.666666666664 | 19 |
| 41823.833333333336 | 19 |
| 41824.0 | 19 |
| 41824.166666666664 | 19 |
| 41824.333333333336 | 19 |
| 41824.5 | 19 |
| 41824.666666666664 | 19 |
| 41824.833333333336 | 19 |
| 41825.0 | 18.5 |
| 41825.166666666664 | 18.5 |
| 41825.333333333336 | 18.5 |
| 41825.5 | 18.5 |
| 41825.666666666664 | 18.5 |
| 41825.833333333336 | 18.5 |
| 41826.0 | 18.5 |
| 41826.166666666664 | 18.5 |
| 41826.333333333336 | 18.5 |
| 41826.5 | 18.5 |
| 41826.666666666664 | 18.5 |
| 41826.833333333336 | 18.5 |
| 41827.0 | 18.5 |
| 41827.166666666664 | 18.5 |
| 41827.333333333336 | 18.5 |
| 41827.5 | 18.5 |
| 41827.666666666664 | 18.5 |
| 41827.833333333336 | 18.5 |
| 41828.0 | 18.5 |
| 41828.166666666664 | 19 |
| 41828.333333333336 | 19 |
| 41828.5 | 19 |
| 41828.666666666664 | 19 |
| 41828.833333333336 | 19 |
| 41829.0 | 19 |
| 41829.166666666664 | 19 |
| 41829.333333333336 | 19 |
| 41829.5 | 19 |
| 41829.666666666664 | 19 |
| 41829.833333333336 | 19 |
| 41830.0 | 19 |
| 41830.166666666664 | 19 |
| 41830.333333333336 | 19 |
| 41830.5 | 19 |
| 41830.666666666664 | 19 |
| 41830.833333333336 | 19 |
| 41831.0 | 19 |
| 41831.166666666664 | 19 |
| 41831.333333333336 | 19 |
| 41831.5 | 19 |
| 41831.666666666664 | 19 |
| 41831.833333333336 | 19 |
| 41832.0 | 19 |
| 41832.166666666664 | 19 |
| 41832.333333333336 | 19 |
| 41832.5 | 19 |
| 41832.666666666664 | 19.5 |
| 41832.833333333336 | 19.5 |
| 41833.0 | 19.5 |
| 41833.166666666664 | 19.5 |
| 41833.333333333336 | 19.5 |
| 41833.5 | 19.5 |
| 41833.666666666664 | 19.5 |
| 41833.833333333336 | 19.5 |
| 41834.0 | 19.5 |
| 41834.166666666664 | 19.5 |
| 41834.333333333336 | 19.5 |
| 41834.5 | 19.5 |
| 41834.666666666664 | 19.5 |
| 41834.833333333336 | 20 |
| 41835.0 | 20 |
| 41835.166666666664 | 20 |
| 41835.333333333336 | 20 |
| 41835.5 | 20 |
| 41835.666666666664 | 20 |
| 41835.833333333336 | 20 |
| 41836.0 | 20 |
| 41836.166666666664 | 19.5 |
| 41836.333333333336 | 19.5 |
| 41836.5 | 19 |
| 41836.666666666664 | 19 |
| 41836.833333333336 | 19 |
| 41837.0 | 19 |
| 41837.166666666664 | 18.5 |
| 41837.333333333336 | 18.5 |
| 41837.5 | 18.5 |
| 41837.666666666664 | 18.5 |
| 41837.833333333336 | 18.5 |
| 41838.0 | 18.5 |
| 41838.166666666664 | 18.5 |
| 41838.333333333336 | 18.5 |
| 41838.5 | 18.5 |
| 41838.666666666664 | 18.5 |
| 41838.833333333336 | 18.5 |
| 41839.0 | 18.5 |
| 41839.166666666664 | 18.5 |
| 41839.333333333336 | 18.5 |
| 41839.5 | 18.5 |
| 41839.666666666664 | 18.5 |
| 41839.833333333336 | 18.5 |
| 41840.0 | 18.5 |
| 41840.166666666664 | 18.5 |
| 41840.333333333336 | 18.5 |
| 41840.5 | 18.5 |
| 41840.666666666664 | 18.5 |
| 41840.833333333336 | 18.5 |
| 41841.0 | 18.5 |
| 41841.166666666664 | 18.5 |
| 41841.333333333336 | 18.5 |
| 41841.5 | 18.5 |
| 41841.666666666664 | 18.5 |
| 41841.833333333336 | 18.5 |
| 41842.0 | 18.5 |
| 41842.166666666664 | 18.5 |
| 41842.333333333336 | 19 |
| 41842.5 | 19 |
| 41842.666666666664 | 19 |
| 41842.833333333336 | 19 |
| 41843.0 | 19 |
| 41843.166666666664 | 19 |
| 41843.333333333336 | 19 |
| 41843.5 | 19 |
| 41843.666666666664 | 19.5 |
| 41843.833333333336 | 19.5 |
| 41844.0 | 19.5 |
| 41844.166666666664 | 19.5 |
| 41844.333333333336 | 19.5 |
| 41844.5 | 19.5 |
| 41844.666666666664 | 20 |
| 41844.833333333336 | 20 |
| 41845.0 | 20 |
| 41845.166666666664 | 20 |
| 41845.333333333336 | 20 |
| 41845.5 | 20 |
| 41845.666666666664 | 20 |
| 41845.833333333336 | 20 |
| 41846.0 | 20 |
| 41846.166666666664 | 20 |
| 41846.333333333336 | 20 |
| 41846.5 | 20 |
| 41846.666666666664 | 20 |
| 41846.833333333336 | 20.5 |
| 41847.0 | 20.5 |
| 41847.166666666664 | 20.5 |
| 41847.333333333336 | 20.5 |
| 41847.5 | 20.5 |
| 41847.666666666664 | 20.5 |
| 41847.833333333336 | 20.5 |
| 41848.0 | 20.5 |
| 41848.166666666664 | 20.5 |
| 41848.333333333336 | 20.5 |
| 41848.5 | 20.5 |
| 41848.666666666664 | 20.5 |
| 41848.833333333336 | 20.5 |
| 41849.0 | 20.5 |
| 41849.166666666664 | 20.5 |
| 41849.333333333336 | 20 |
| 41849.5 | 20 |
| 41849.666666666664 | 20 |
| 41849.833333333336 | 20 |
| 41850.0 | 20 |
| 41850.166666666664 | 20 |
| 41850.333333333336 | 20 |
| 41850.5 | 20 |
| 41850.666666666664 | 19.5 |
| 41850.833333333336 | 19.5 |
| 41851.0 | 19.5 |
| 41851.166666666664 | 19.5 |
| 41851.333333333336 | 19.5 |
| 41851.5 | 19.5 |
| 41851.666666666664 | 19.5 |
| 41851.833333333336 | 19.5 |
| 41852.0 | 19.5 |
| 41852.166666666664 | 19.5 |
| 41852.333333333336 | 19.5 |
| 41852.5 | 19.5 |
| 41852.666666666664 | 19.5 |
| 41852.833333333336 | 19.5 |
| 41853.0 | 19.5 |
| 41853.166666666664 | 19.5 |
| 41853.333333333336 | 19.5 |
| 41853.5 | 19.5 |
| 41853.666666666664 | 19.5 |
| 41853.833333333336 | 19.5 |
| 41854.0 | 19.5 |
| 41854.166666666664 | 19.5 |
| 41854.333333333336 | 19.5 |
| 41854.5 | 20 |
| 41854.666666666664 | 20 |
| 41854.833333333336 | 20 |
| 41855.0 | 20 |
| 41855.166666666664 | 20 |
| 41855.333333333336 | 20 |
| 41855.5 | 20 |
| 41855.666666666664 | 20 |
| 41855.833333333336 | 20 |
| 41856.0 | 20 |
| 41856.166666666664 | 20 |
| 41856.333333333336 | 20 |
| 41856.5 | 20.5 |
| 41856.666666666664 | 20.5 |
| 41856.833333333336 | 20.5 |
| 41857.0 | 20.5 |
| 41857.166666666664 | 20.5 |
| 41857.333333333336 | 20.5 |
| 41857.5 | 20.5 |
| 41857.666666666664 | 21 |
| 41857.833333333336 | 21 |
| 41858.0 | 21 |
| 41858.166666666664 | 21 |
| 41858.333333333336 | 21 |
| 41858.5 | 21 |
| 41858.666666666664 | 21 |
| 41858.833333333336 | 21.5 |
| 41859.0 | 21.5 |
| 41859.166666666664 | 21.5 |
| 41859.333333333336 | 21.5 |
| 41859.5 | 21.5 |
| 41859.666666666664 | 21.5 |
| 41859.833333333336 | 22 |
| 41860.0 | 22 |
| 41860.166666666664 | 22 |
| 41860.333333333336 | 22 |
| 41860.5 | 22 |
| 41860.666666666664 | 22 |
| 41860.833333333336 | 22 |
| 41861.0 | 22 |
| 41861.166666666664 | 22 |
| 41861.333333333336 | 21.5 |
| 41861.5 | 21.5 |
| 41861.666666666664 | 21.5 |
| 41861.833333333336 | 21.5 |
| 41862.0 | 21.5 |
| 41862.166666666664 | 21.5 |
| 41862.333333333336 | 21.5 |
| 41862.5 | 21.5 |
| 41862.666666666664 | 22 |
| 41862.833333333336 | 22 |
| 41863.0 | 22 |
| 41863.166666666664 | 22 |
| 41863.333333333336 | 21.5 |
| 41863.5 | 21 |
| 41863.666666666664 | 21 |
| 41863.833333333336 | 21 |
| 41864.0 | 21 |
| 41864.166666666664 | 20.5 |
| 41864.333333333336 | 20 |
| 41864.5 | 19.5 |
| 41864.666666666664 | 20 |
| 41864.833333333336 | 20 |
| 41865.0 | 20.5 |
| 41865.166666666664 | 20 |
| 41865.333333333336 | 19.5 |
| 41865.5 | 19.5 |
| 41865.666666666664 | 20 |
| 41865.833333333336 | 20 |
| 41866.0 | 20.5 |
| 41866.166666666664 | 20.5 |
| 41866.333333333336 | 20 |
| 41866.5 | 20 |
| 41866.666666666664 | 20.5 |
| 41866.833333333336 | 20.5 |
| 41867.0 | 21 |
| 41867.166666666664 | 21 |
| 41867.333333333336 | 21 |
| 41867.5 | 21 |
| 41867.666666666664 | 21 |
| 41867.833333333336 | 21.5 |
| 41868.0 | 21.5 |
| 41868.166666666664 | 21.5 |
| 41868.333333333336 | 21.5 |
| 41868.5 | 21.5 |
| 41868.666666666664 | 22 |
| 41868.833333333336 | 22.5 |
| 41869.0 | 22.5 |
| 41869.166666666664 | 22.5 |
| 41869.333333333336 | 22 |
| 41869.5 | 22 |
| 41869.666666666664 | 22.5 |
| 41869.833333333336 | 23 |
| 41870.0 | 23 |
| 41870.166666666664 | 23 |
| 41870.333333333336 | 22.5 |
| 41870.5 | 22 |
| 41870.666666666664 | 22.5 |
| 41870.833333333336 | 23.5 |
| 41871.0 | 23.5 |
| 41871.166666666664 | 23.5 |
| 41871.333333333336 | 23 |
| 41871.5 | 23 |
| 41871.666666666664 | 23.5 |
| 41871.833333333336 | 24 |
| 41872.0 | 24 |
| 41872.166666666664 | 23.5 |
| 41872.333333333336 | 23 |
| 41872.5 | 23 |
| 41872.666666666664 | 23.5 |
| 41872.833333333336 | 24.5 |
| 41873.0 | 24.5 |
| 41873.166666666664 | 24 |
| 41873.333333333336 | 23.5 |
| 41873.5 | 23 |
| 41873.666666666664 | 24 |
| 41873.833333333336 | 25 |
| 41874.0 | 25 |
| 41874.166666666664 | 24.5 |
| 41874.333333333336 | 24 |
| 41874.5 | 24 |
| 41874.666666666664 | 25 |
| 41874.833333333336 | 26 |
| 41875.0 | 26 |
| 41875.166666666664 | 25 |
| 41875.333333333336 | 24 |
| 41875.5 | 23.5 |
| 41875.666666666664 | 25 |
| 41875.833333333336 | 26.5 |
| 41876.0 | 25.5 |
| 41876.166666666664 | 24.5 |
| 41876.333333333336 | 24 |
| 41876.5 | 23.5 |
| 41876.666666666664 | 25.5 |
| 41876.833333333336 | 27 |
| 41877.0 | 26.5 |
| 41877.166666666664 | 25.5 |
| 41877.333333333336 | 24.5 |
| 41877.5 | 24 |
| 41877.666666666664 | 26 |
| 41877.833333333336 | 27.5 |
| 41878.0 | 26.5 |
| 41878.166666666664 | 25.5 |
| 41878.333333333336 | 24.5 |
| 41878.5 | 24 |
| 41878.666666666664 | 26.5 |
| 41878.833333333336 | 27.5 |
| 41879.0 | 26.5 |
| 41879.166666666664 | 25.5 |
| 41879.333333333336 | 24.5 |
| 41879.5 | 24.5 |
| 41879.666666666664 | 27 |
| 41879.833333333336 | 27.5 |
| 41880.0 | 26 |
| 41880.166666666664 | 24.5 |
| 41880.333333333336 | 23.5 |
| 41880.5 | 23.5 |
| 41880.666666666664 | 25 |
| 41880.833333333336 | 25 |
| 41881.0 | 24.5 |
| 41881.166666666664 | 23.5 |
| 41881.333333333336 | 22.5 |
| 41881.5 | 23.5 |
| 41881.666666666664 | 25.5 |
| 41881.833333333336 | 26 |
| 41882.0 | 25 |
| 41882.166666666664 | 24 |
| 41882.333333333336 | 23 |
| 41882.5 | 23.5 |
| 41882.666666666664 | 25.5 |
| 41882.833333333336 | 26 |
| 41883.0 | 25 |
| 41883.166666666664 | 24 |
| 41883.333333333336 | 23 |
| 41883.5 | 22.5 |
| 41883.666666666664 | 25.5 |
| 41883.833333333336 | 27 |
| 41884.0 | 25.5 |
| 41884.166666666664 | 24.5 |
| 41884.333333333336 | 24 |
| 41884.5 | 23 |
| 41884.666666666664 | 23 |
| 41884.833333333336 | 23.5 |
| 41885.0 | 23 |
| 41885.166666666664 | 22.5 |
| 41885.333333333336 | 22 |
| 41885.5 | 22 |
| 41885.666666666664 | 24 |
| 41885.833333333336 | 25.5 |
| 41886.0 | 25 |
| 41886.166666666664 | 24.5 |
| 41886.333333333336 | 24 |
| 41886.5 | 23.5 |
| 41886.666666666664 | 25 |
| 41886.833333333336 | 26.5 |
| 41887.0 | 26 |
| 41887.166666666664 | 25 |
| 41887.333333333336 | 24 |
| 41887.5 | 24 |
| 41887.666666666664 | 25.5 |
| 41887.833333333336 | 27 |
| 41888.0 | 26 |
| 41888.166666666664 | 25 |
| 41888.333333333336 | 24 |
| 41888.5 | 23.5 |
| 41888.666666666664 | 23.5 |
| 41888.833333333336 | 23 |
| 41889.0 | 22 |
| 41889.166666666664 | 21 |
| 41889.333333333336 | 20 |
| 41889.5 | 20 |
| 41889.666666666664 | 22.5 |
| 41889.833333333336 | 24 |
| 41890.0 | 22.5 |
| 41890.166666666664 | 21.5 |
| 41890.333333333336 | 21 |
| 41890.5 | 21 |
| 41890.666666666664 | 24 |
| 41890.833333333336 | 24.5 |
| 41891.0 | 23.5 |
| 41891.166666666664 | 22.5 |
| 41891.333333333336 | 22 |
| 41891.5 | 22 |
| 41891.666666666664 | 24.5 |
| 41992.666666666664 | 5 |
| 41992.833333333336 | 5 |
| 41993.0 | 5 |
| 41993.166666666664 | 5 |
| 41993.333333333336 | 5 |
| 41993.5 | 5 |
| 41993.666666666664 | 5.5 |
| 41993.833333333336 | 5.5 |
| 41994.0 | 5.5 |
| 41994.166666666664 | 5.5 |
| 41994.333333333336 | 5.5 |
| 41994.5 | 5.5 |
| 41994.666666666664 | 6 |
| 41994.833333333336 | 6 |
| 41995.0 | 6 |
| 41995.166666666664 | 6 |
| 41995.333333333336 | 6 |
| 41995.5 | 6 |
| 41995.666666666664 | 6.5 |
| 41995.833333333336 | 6.5 |
| 41996.0 | 6.5 |
| 41996.166666666664 | 6.5 |
| 41996.333333333336 | 6 |
| 41996.5 | 6 |
| 41996.666666666664 | 6.5 |
| 41996.833333333336 | 6.5 |
| 41997.0 | 6.5 |
| 41997.166666666664 | 6 |
| 41997.333333333336 | 6 |
| 41997.5 | 6 |
| 41997.666666666664 | 6 |
| 41997.833333333336 | 6 |
| 41998.0 | 6 |
| 41998.166666666664 | 5 |
| 41998.333333333336 | 5 |
| 41998.5 | 4.5 |
| 41998.666666666664 | 5 |
| 41998.833333333336 | 5 |
| 41999.0 | 5 |
| 41999.166666666664 | 5 |
| 41999.333333333336 | 4.5 |
| 41999.5 | 4.5 |
| 41999.666666666664 | 5 |
| 41999.833333333336 | 5 |
| 42000.0 | 5.5 |
| 42000.166666666664 | 5.5 |
| 42000.333333333336 | 6 |
| 42000.5 | 6 |
| 42000.666666666664 | 6 |
| 42000.833333333336 | 6 |
| 42001.0 | 5.5 |
| 42001.166666666664 | 5 |
| 42001.333333333336 | 4.5 |
| 42001.5 | 4.5 |
| 42001.666666666664 | 5 |
| 42001.833333333336 | 4.5 |
| 42002.0 | 4.5 |
| 42002.166666666664 | 4.5 |
| 42002.333333333336 | 4.5 |
| 42002.5 | 4.5 |
| 42002.666666666664 | 4.5 |
| 42002.833333333336 | 4.5 |
| 42003.0 | 4.5 |
| 42003.166666666664 | 4.5 |
| 42003.333333333336 | 4.5 |
| 42003.5 | 4 |
| 42003.666666666664 | 4.5 |
| 42003.833333333336 | 4.5 |
| 42004.0 | 4 |
| 42004.166666666664 | 4 |
| 42004.333333333336 | 4 |
| 42004.5 | 4 |
| 42004.666666666664 | 4.5 |
| 42004.833333333336 | 4.5 |
| 42005.0 | 4 |
| 42005.166666666664 | 4.5 |
| 42005.333333333336 | 4 |
| 42005.5 | 4 |
| 42005.666666666664 | 4.5 |
| 42005.833333333336 | 4.5 |
| 42006.0 | 4.5 |
| 42006.166666666664 | 4.5 |
| 42006.333333333336 | 4 |
| 42006.5 | 4.5 |
| 42006.666666666664 | 4.5 |
| 42006.833333333336 | 4.5 |
| 42007.0 | 4.5 |
| 42007.166666666664 | 4.5 |
| 42007.333333333336 | 4.5 |
| 42007.5 | 4.5 |
| 42007.666666666664 | 5 |
| 42007.833333333336 | 5 |
| 42008.0 | 5.5 |
| 42008.166666666664 | 5.5 |
| 42008.333333333336 | 5.5 |
| 42008.5 | 5 |
| 42008.666666666664 | 5 |
| 42008.833333333336 | 4.5 |
| 42009.0 | 4.5 |
| 42009.166666666664 | 4.5 |
| 42009.333333333336 | 4.5 |
| 42009.5 | 4.5 |
| 42009.666666666664 | 4.5 |
| 42009.833333333336 | 4.5 |
| 42010.0 | 4.5 |
| 42010.166666666664 | 4.5 |
| 42010.333333333336 | 4.5 |
| 42010.5 | 4.5 |
| 42010.666666666664 | 4.5 |
| 42010.833333333336 | 4.5 |
| 42011.0 | 4.5 |
| 42011.166666666664 | 4.5 |
| 42011.333333333336 | 4.5 |
| 42011.5 | 4.5 |
| 42011.666666666664 | 4.5 |
| 42011.833333333336 | 4.5 |
| 42012.0 | 4.5 |
| 42012.166666666664 | 4.5 |
| 42012.333333333336 | 4.5 |
| 42012.5 | 4.5 |
| 42012.666666666664 | 4.5 |
| 42012.833333333336 | 4.5 |
| 42013.0 | 4.5 |
| 42013.166666666664 | 4 |
| 42013.333333333336 | 4 |
| 42013.5 | 4 |
| 42013.666666666664 | 4.5 |
| 42013.833333333336 | 4.5 |
| 42014.0 | 4.5 |
| 42014.166666666664 | 4 |
| 42014.333333333336 | 4 |
| 42014.5 | 4 |
| 42014.666666666664 | 4.5 |
| 42014.833333333336 | 4.5 |
| 42015.0 | 4 |
| 42015.166666666664 | 4 |
| 42015.333333333336 | 4 |
| 42015.5 | 4 |
| 42015.666666666664 | 4 |
| 42015.833333333336 | 4 |
| 42016.0 | 4 |
| 42016.166666666664 | 4 |
| 42016.333333333336 | 4 |
| 42016.5 | 3.5 |
| 42016.666666666664 | 4 |
| 42016.833333333336 | 4 |
| 42017.0 | 3.5 |
| 42017.166666666664 | 3.5 |
| 42017.333333333336 | 3.5 |
| 42017.5 | 3.5 |
| 42017.666666666664 | 4 |
| 42017.833333333336 | 4 |
| 42018.0 | 4 |
| 42018.166666666664 | 4 |
| 42018.333333333336 | 4 |
| 42018.5 | 4 |
| 42018.666666666664 | 4 |
| 42018.833333333336 | 4 |
| 42019.0 | 4 |
| 42019.166666666664 | 4 |
| 42019.333333333336 | 4 |
| 42019.5 | 4 |
| 42019.666666666664 | 4 |
| 42019.833333333336 | 4.5 |
| 42020.0 | 4 |
| 42020.166666666664 | 4 |
| 42020.333333333336 | 4 |
| 42020.5 | 4 |
| 42020.666666666664 | 4 |
| 42020.833333333336 | 4.5 |
| 42021.0 | 4.5 |
| 42021.166666666664 | 4 |
| 42021.333333333336 | 4 |
| 42021.5 | 4 |
| 42021.666666666664 | 4 |
| 42021.833333333336 | 4.5 |
| 42022.0 | 4.5 |
| 42022.166666666664 | 4.5 |
| 42022.333333333336 | 4 |
| 42022.5 | 4 |
| 42022.666666666664 | 4.5 |
| 42022.833333333336 | 5 |
| 42023.0 | 4.5 |
| 42023.166666666664 | 4.5 |
| 42023.333333333336 | 4.5 |
| 42023.5 | 4.5 |
| 42023.666666666664 | 5 |
| 42023.833333333336 | 5 |
| 42024.0 | 5 |
| 42024.166666666664 | 5 |
| 42024.333333333336 | 5 |
| 42024.5 | 5 |
| 42024.666666666664 | 5 |
| 42024.833333333336 | 5 |
| 42025.0 | 5 |
| 42025.166666666664 | 5 |
| 42025.333333333336 | 4.5 |
| 42025.5 | 4.5 |
| 42025.666666666664 | 5 |
| 42025.833333333336 | 5 |
| 42026.0 | 5 |
| 42026.166666666664 | 5 |
| 42026.333333333336 | 5 |
| 42026.5 | 5 |
| 42026.666666666664 | 5 |
| 42026.833333333336 | 5.5 |
| 42027.0 | 5 |
| 42027.166666666664 | 5 |
| 42027.333333333336 | 4.5 |
| 42027.5 | 4.5 |
| 42027.666666666664 | 5 |
| 42027.833333333336 | 5 |
| 42028.0 | 5 |
| 42028.166666666664 | 4.5 |
| 42028.333333333336 | 4.5 |
| 42028.5 | 4.5 |
| 42028.666666666664 | 5 |
| 42028.833333333336 | 5 |
| 42029.0 | 5 |
| 42029.166666666664 | 5 |
| 42029.333333333336 | 5 |
| 42029.5 | 5 |
| 42029.666666666664 | 5.5 |
| 42029.833333333336 | 5.5 |
| 42030.0 | 5.5 |
| 42030.166666666664 | 5 |
| 42030.333333333336 | 5 |
| 42030.5 | 5 |
| 42030.666666666664 | 5.5 |
| 42030.833333333336 | 5.5 |
| 42031.0 | 6 |
| 42031.166666666664 | 5.5 |
| 42031.333333333336 | 5 |
| 42031.5 | 5 |
| 42031.666666666664 | 5.5 |
| 42031.833333333336 | 6 |
| 42032.0 | 6 |
| 42032.166666666664 | 5.5 |
| 42032.333333333336 | 5.5 |
| 42032.5 | 5 |
| 42032.666666666664 | 6 |
| 42032.833333333336 | 6 |
| 42033.0 | 6.5 |
| 42033.166666666664 | 6.5 |
| 42033.333333333336 | 6.5 |
| 42033.5 | 6.5 |
| 42033.666666666664 | 6.5 |
| 42033.833333333336 | 6.5 |
| 42034.0 | 6 |
| 42034.166666666664 | 5 |
| 42034.333333333336 | 5 |
| 42034.5 | 5 |
| 42034.666666666664 | 5.5 |
| 42034.833333333336 | 5.5 |
| 42035.0 | 5 |
| 42035.166666666664 | 5 |
| 42035.333333333336 | 5 |
| 42035.5 | 5 |
| 42035.666666666664 | 5 |
| 42035.833333333336 | 5.5 |
| 42036.0 | 5.5 |
| 42036.166666666664 | 5.5 |
| 42036.333333333336 | 5 |
| 42036.5 | 5.5 |
| 42036.666666666664 | 5.5 |
| 42036.833333333336 | 5 |
| 42037.0 | 5 |
| 42037.166666666664 | 4.5 |
| 42037.333333333336 | 4.5 |
| 42037.5 | 4.5 |
| 42037.666666666664 | 5 |
| 42037.833333333336 | 4.5 |
| 42038.0 | 4.5 |
| 42038.166666666664 | 4.5 |
| 42038.333333333336 | 4.5 |
| 42038.5 | 4.5 |
| 42038.666666666664 | 5 |
| 42038.833333333336 | 5 |
| 42039.0 | 4.5 |
| 42039.166666666664 | 4.5 |
| 42039.333333333336 | 4.5 |
| 42039.5 | 4.5 |
| 42039.666666666664 | 4.5 |
| 42039.833333333336 | 4.5 |
| 42040.0 | 4.5 |
| 42040.166666666664 | 4.5 |
| 42040.333333333336 | 4.5 |
| 42040.5 | 4.5 |
| 42040.666666666664 | 5 |
| 42040.833333333336 | 4.5 |
| 42041.0 | 4.5 |
| 42041.166666666664 | 4.5 |
| 42041.333333333336 | 4.5 |
| 42041.5 | 4.5 |
| 42041.666666666664 | 5 |
| 42041.833333333336 | 5 |
| 42042.0 | 4.5 |
| 42042.166666666664 | 4.5 |
| 42042.333333333336 | 4.5 |
| 42042.5 | 4.5 |
| 42042.666666666664 | 5 |
| 42042.833333333336 | 5.5 |
| 42043.0 | 6 |
| 42043.166666666664 | 6 |
| 42043.333333333336 | 5.5 |
| 42043.5 | 5.5 |
| 42043.666666666664 | 6.5 |
| 42043.833333333336 | 7 |
| 42044.0 | 7 |
| 42044.166666666664 | 7 |
| 42044.333333333336 | 7 |
| 42044.5 | 7 |
| 42044.666666666664 | 7 |
| 42044.833333333336 | 7.5 |
| 42045.0 | 7 |
| 42045.166666666664 | 6.5 |
| 42045.333333333336 | 5.5 |
| 42045.5 | 5.5 |
| 42045.666666666664 | 6.5 |
| 42045.833333333336 | 6.5 |
| 42046.0 | 6.5 |
| 42046.166666666664 | 5.5 |
| 42046.333333333336 | 5 |
| 42046.5 | 5 |
| 42046.666666666664 | 6 |
| 42046.833333333336 | 6.5 |
| 42047.0 | 6 |
| 42047.166666666664 | 5 |
| 42047.333333333336 | 5 |
| 42047.5 | 5 |
| 42047.666666666664 | 5.5 |
| 42047.833333333336 | 5.5 |
| 42048.0 | 5 |
| 42048.166666666664 | 5 |
| 42048.333333333336 | 4.5 |
| 42048.5 | 4.5 |
| 42048.666666666664 | 5 |
| 42048.833333333336 | 5.5 |
| 42049.0 | 5.5 |
| 42049.166666666664 | 5 |
| 42049.333333333336 | 4.5 |
| 42049.5 | 4.5 |
| 42049.666666666664 | 5.5 |
| 42049.833333333336 | 6.5 |
| 42050.0 | 6 |
| 42050.166666666664 | 5 |
| 42050.333333333336 | 5 |
| 42050.5 | 5 |
| 42050.666666666664 | 5 |
| 42050.833333333336 | 5 |
| 42051.0 | 5 |
| 42051.166666666664 | 4.5 |
| 42051.333333333336 | 4.5 |
| 42051.5 | 4.5 |
| 42051.666666666664 | 4.5 |
| 42051.833333333336 | 4.5 |
| 42052.0 | 4 |
| 42052.166666666664 | 4 |
| 42052.333333333336 | 3.5 |
| 42052.5 | 4 |
| 42052.666666666664 | 4 |
| 42052.833333333336 | 4 |
| 42053.0 | 4 |
| 42053.166666666664 | 4 |
| 42053.333333333336 | 3.5 |
| 42053.5 | 3.5 |
| 42053.666666666664 | 4 |
| 42053.833333333336 | 4.5 |
| 42054.0 | 4 |
| 42054.166666666664 | 4 |
| 42054.333333333336 | 3.5 |
| 42054.5 | 4 |
| 42054.666666666664 | 4 |
| 42054.833333333336 | 4 |
| 42055.0 | 4 |
| 42055.166666666664 | 3.5 |
| 42055.333333333336 | 3.5 |
| 42055.5 | 3.5 |
| 42055.666666666664 | 3.5 |
| 42055.833333333336 | 3.5 |
| 42056.0 | 3.5 |
| 42056.166666666664 | 3.5 |
| 42056.333333333336 | 3 |
| 42056.5 | 3.5 |
| 42056.666666666664 | 3.5 |
| 42056.833333333336 | 3.5 |
| 42057.0 | 3.5 |
| 42057.166666666664 | 3.5 |
| 42057.333333333336 | 3.5 |
| 42057.5 | 3.5 |
| 42057.666666666664 | 4 |
| 42057.833333333336 | 4 |
| 42058.0 | 4 |
| 42058.166666666664 | 3.5 |
| 42058.333333333336 | 3.5 |
| 42058.5 | 3.5 |
| 42058.666666666664 | 4 |
| 42058.833333333336 | 4 |
| 42059.0 | 4 |
| 42059.166666666664 | 4 |
| 42059.333333333336 | 4 |
| 42059.5 | 4 |
| 42059.666666666664 | 4.5 |
| 42059.833333333336 | 4.5 |
| 42060.0 | 4.5 |
| 42060.166666666664 | 4.5 |
| 42060.333333333336 | 4.5 |
| 42060.5 | 4.5 |
| 42060.666666666664 | 5 |
| 42060.833333333336 | 4.5 |
| 42061.0 | 4.5 |
| 42061.166666666664 | 4.5 |
| 42061.333333333336 | 4.5 |
| 42061.5 | 4.5 |
| 42061.666666666664 | 5 |
| 42061.833333333336 | 4.5 |
| 42062.0 | 4.5 |
| 42062.166666666664 | 4.5 |
| 42062.333333333336 | 4.5 |
| 42062.5 | 4.5 |
| 42062.666666666664 | 4.5 |
| 42062.833333333336 | 4.5 |
| 42063.0 | 4.5 |
| 42063.166666666664 | 4.5 |
| 42063.333333333336 | 4.5 |
| 42063.5 | 4.5 |
| 42063.666666666664 | 4.5 |
| 42063.833333333336 | 4 |
| 42064.0 | 4 |
| 42064.166666666664 | 4 |
| 42064.333333333336 | 4 |
| 42064.5 | 4 |
| 42064.666666666664 | 4 |
| 42064.833333333336 | 4 |
| 42065.0 | 4 |
| 42065.166666666664 | 4 |
| 42065.333333333336 | 4 |
| 42065.5 | 4 |
| 42065.666666666664 | 4 |
| 42065.833333333336 | 4 |
| 42066.0 | 4 |
| 42066.166666666664 | 4 |
| 42066.333333333336 | 4 |
| 42066.5 | 4 |
| 42066.666666666664 | 4 |
| 42066.833333333336 | 4 |
| 42067.0 | 4 |
| 42067.166666666664 | 4 |
| 42067.333333333336 | 4 |
| 42067.5 | 4 |
| 42067.666666666664 | 4 |
| 42067.833333333336 | 4 |
| 42068.0 | 4 |
| 42068.166666666664 | 4 |
| 42068.333333333336 | 4 |
| 42068.5 | 4 |
| 42068.666666666664 | 4.5 |
| 42068.833333333336 | 4.5 |
| 42069.0 | 4.5 |
| 42069.166666666664 | 4.5 |
| 42069.333333333336 | 4.5 |
| 42069.5 | 4.5 |
| 42069.666666666664 | 5 |
| 42069.833333333336 | 5 |
| 42070.0 | 4.5 |
| 42070.166666666664 | 4.5 |
| 42070.333333333336 | 4.5 |
| 42070.5 | 4.5 |
| 42070.666666666664 | 5 |
| 42070.833333333336 | 5 |
| 42071.0 | 5 |
| 42071.208333333336 | 4.5 |
| 42071.375 | 4.5 |
| 42071.541666666664 | 4.5 |
| 42071.708333333336 | 4.5 |
| 42071.875 | 5 |
| 42072.041666666664 | 5 |
| 42072.208333333336 | 5 |
| 42072.375 | 5 |
| 42072.541666666664 | 5 |
| 42072.708333333336 | 5.5 |
| 42072.875 | 6 |
| 42073.041666666664 | 6 |
| 42073.208333333336 | 6.5 |
| 42073.375 | 6.5 |
| 42073.541666666664 | 6.5 |
| 42073.708333333336 | 6.5 |
| 42073.875 | 7 |
| 42074.041666666664 | 7 |
| 42074.208333333336 | 7 |
| 42074.375 | 7 |
| 42074.541666666664 | 7 |
| 42074.708333333336 | 8 |
| 42074.875 | 8 |
| 42075.041666666664 | 8 |
| 42075.208333333336 | 8 |
| 42075.375 | 8.5 |
| 42075.541666666664 | 8.5 |
| 42075.708333333336 | 9 |
| 42075.875 | 9 |
| 42076.041666666664 | 9 |
| 42076.208333333336 | 9 |
| 42076.375 | 9.5 |
| 42076.541666666664 | 9.5 |
| 42076.708333333336 | 9.5 |
| 42076.875 | 9.5 |
| 42077.041666666664 | 9.5 |
| 42077.208333333336 | 9.5 |
| 42077.375 | 9.5 |
| 42077.541666666664 | 9.5 |
| 42077.708333333336 | 10 |
| 42077.875 | 10 |
| 42078.041666666664 | 10 |
| 42078.208333333336 | 10 |
| 42078.375 | 9.5 |
| 42078.541666666664 | 9.5 |
| 42078.708333333336 | 10 |
| 42078.875 | 10 |
| 42079.041666666664 | 10 |
| 42079.208333333336 | 10 |
| 42079.375 | 10 |
| 42079.541666666664 | 10 |
| 42079.708333333336 | 10.5 |
| 42079.875 | 10.5 |
| 42080.041666666664 | 10.5 |
| 42080.208333333336 | 10.5 |
| 42080.375 | 11 |
| 42080.541666666664 | 11 |
| 42080.708333333336 | 11.5 |
| 42080.875 | 11.5 |
| 42081.041666666664 | 11.5 |
| 42081.208333333336 | 11.5 |
| 42081.375 | 11.5 |
| 42081.541666666664 | 11.5 |
| 42081.708333333336 | 11 |
| 42081.875 | 10.5 |
| 42082.041666666664 | 10 |
| 42082.208333333336 | 9.5 |
| 42082.375 | 9 |
| 42082.541666666664 | 8.5 |
| 42082.708333333336 | 8.5 |
| 42082.875 | 9 |
| 42083.041666666664 | 9 |
| 42083.208333333336 | 9 |
| 42083.375 | 9 |
| 42083.541666666664 | 9 |
| 42083.708333333336 | 9 |
| 42083.875 | 9.5 |
| 42084.041666666664 | 9.5 |
| 42084.208333333336 | 9.5 |
| 42084.375 | 9.5 |
| 42084.541666666664 | 9.5 |
| 42084.708333333336 | 10 |
| 42084.875 | 10 |
| 42085.041666666664 | 10 |
| 42085.208333333336 | 10 |
| 42085.375 | 10 |
| 42085.541666666664 | 10 |
| 42085.708333333336 | 10.5 |
| 42085.875 | 10.5 |
| 42086.041666666664 | 10.5 |
| 42086.208333333336 | 10.5 |
| 42086.375 | 10.5 |
| 42086.541666666664 | 10 |
| 42086.708333333336 | 10.5 |
| 42086.875 | 10.5 |
| 42087.041666666664 | 10.5 |
| 42087.208333333336 | 10.5 |
| 42087.375 | 11 |
| 42087.541666666664 | 11 |
| 42087.708333333336 | 11.5 |
| 42087.875 | 12 |
| 42088.041666666664 | 12 |
| 42088.208333333336 | 11.5 |
| 42088.375 | 12 |
| 42088.541666666664 | 12 |
| 42088.708333333336 | 12.5 |
| 42088.875 | 12.5 |
| 42089.041666666664 | 12.5 |
| 42089.208333333336 | 12.5 |
| 42089.375 | 12 |
| 42089.541666666664 | 12 |
| 42089.708333333336 | 12 |
| 42089.875 | 12 |
| 42090.041666666664 | 12 |
| 42090.208333333336 | 11.5 |
| 42090.375 | 11 |
| 42090.541666666664 | 10.5 |
| 42090.708333333336 | 11 |
| 42090.875 | 11 |
| 42091.041666666664 | 11 |
| 42091.208333333336 | 11 |
| 42091.375 | 10.5 |
| 42091.541666666664 | 10 |
| 42091.708333333336 | 10 |
| 42091.875 | 10.5 |
| 42092.041666666664 | 10.5 |
| 42092.208333333336 | 10 |
| 42092.375 | 9 |
| 42092.541666666664 | 9 |
| 42092.708333333336 | 9 |
| 42092.875 | 9 |
| 42093.041666666664 | 9.5 |
| 42093.208333333336 | 9.5 |
| 42093.375 | 9.5 |
| 42093.541666666664 | 9.5 |
| 42093.708333333336 | 10 |
| 42093.875 | 10.5 |
| 42094.041666666664 | 10.5 |
| 42094.208333333336 | 10.5 |
| 42094.375 | 10.5 |
| 42094.541666666664 | 10.5 |
| 42094.708333333336 | 11 |
| 42094.875 | 11 |
| 42095.041666666664 | 11 |
| 42095.208333333336 | 11 |
| 42095.375 | 11 |
| 42095.541666666664 | 11.5 |
| 42095.708333333336 | 11.5 |
| 42095.875 | 11.5 |
| 42096.041666666664 | 11.5 |
| 42096.208333333336 | 11.5 |
| 42096.375 | 11.5 |
| 42096.541666666664 | 11.5 |
| 42096.708333333336 | 12 |
| 42096.875 | 12 |
| 42097.041666666664 | 12 |
| 42097.208333333336 | 12 |
| 42097.375 | 12 |
| 42097.541666666664 | 12 |
| 42097.708333333336 | 12.5 |
| 42097.875 | 12.5 |
| 42098.041666666664 | 12.5 |
| 42098.208333333336 | 12.5 |
| 42098.375 | 12 |
| 42098.541666666664 | 11.5 |
| 42098.708333333336 | 11.5 |
| 42098.875 | 11.5 |
| 42099.041666666664 | 11.5 |
| 42099.208333333336 | 11.5 |
| 42099.375 | 11.5 |
| 42099.541666666664 | 11 |
| 42099.708333333336 | 11 |
| 42099.875 | 11 |
| 42100.041666666664 | 11 |
| 42100.208333333336 | 11 |
| 42100.375 | 11 |
| 42100.541666666664 | 11 |
| 42100.708333333336 | 11 |
| 42100.875 | 11 |
| 42101.041666666664 | 11 |
| 42101.208333333336 | 11 |
| 42101.375 | 11 |
| 42101.541666666664 | 11 |
| 42101.708333333336 | 11.5 |
| 42101.875 | 11.5 |
| 42102.041666666664 | 11.5 |
| 42102.208333333336 | 11.5 |
| 42102.375 | 11.5 |
| 42102.541666666664 | 12 |
| 42102.708333333336 | 12 |
| 42102.875 | 12 |
| 42103.041666666664 | 12 |
| 42103.208333333336 | 12 |
| 42103.375 | 12.5 |
| 42103.541666666664 | 12.5 |
| 42103.708333333336 | 13 |
| 42103.875 | 13 |
| 42104.041666666664 | 13 |
| 42104.208333333336 | 13 |
| 42104.375 | 13 |
| 42104.541666666664 | 13.5 |
| 42104.708333333336 | 14 |
| 42104.875 | 14 |
| 42105.041666666664 | 13.5 |
| 42105.208333333336 | 13.5 |
| 42105.375 | 13.5 |
| 42105.541666666664 | 13.5 |
| 42105.708333333336 | 14 |
| 42105.875 | 14 |
| 42106.041666666664 | 14 |
| 42106.208333333336 | 14 |
| 42106.375 | 14 |
| 42106.541666666664 | 14 |
| 42106.708333333336 | 14 |
| 42106.875 | 14 |
| 42107.041666666664 | 14 |
| 42107.208333333336 | 14 |
| 42107.375 | 14 |
| 42107.541666666664 | 14 |
| 42107.708333333336 | 14 |
| 42107.875 | 14 |
| 42108.041666666664 | 14 |
| 42108.208333333336 | 14 |
| 42108.375 | 14 |
| 42108.541666666664 | 14 |
| 42108.708333333336 | 14 |
| 42108.875 | 14.5 |
| 42109.041666666664 | 14 |
| 42109.208333333336 | 14 |
| 42109.375 | 14 |
| 42109.541666666664 | 14 |
| 42109.708333333336 | 14 |
| 42109.875 | 14 |
| 42110.041666666664 | 14 |
| 42110.208333333336 | 14 |
| 42110.375 | 14 |
| 42110.541666666664 | 14 |
| 42110.708333333336 | 14 |
| 42110.875 | 14.5 |
| 42111.041666666664 | 14 |
| 42111.208333333336 | 14 |
| 42111.375 | 14 |
| 42111.541666666664 | 14.5 |
| 42111.708333333336 | 14.5 |
| 42111.875 | 14.5 |
| 42112.041666666664 | 14.5 |
| 42112.208333333336 | 14.5 |
| 42112.375 | 14.5 |
| 42112.541666666664 | 14.5 |
| 42112.708333333336 | 14.5 |
| 42112.875 | 14.5 |
| 42113.041666666664 | 14.5 |
| 42113.208333333336 | 14.5 |
| 42113.375 | 14.5 |
| 42113.541666666664 | 15 |
| 42113.708333333336 | 15 |
| 42113.875 | 15 |
| 42114.041666666664 | 15 |
| 42114.208333333336 | 15 |
| 42114.375 | 15 |
| 42114.541666666664 | 15 |
| 42114.708333333336 | 15 |
| 42114.875 | 15 |
| 42115.041666666664 | 15 |
| 42115.208333333336 | 15 |
| 42115.375 | 14 |
| 42115.541666666664 | 13.5 |
| 42115.708333333336 | 13.5 |
| 42115.875 | 14 |
| 42116.041666666664 | 14 |
| 42116.208333333336 | 14 |
| 42116.375 | 14 |
| 42116.541666666664 | 14 |
| 42116.708333333336 | 14 |
| 42116.875 | 14 |
| 42117.041666666664 | 14 |
| 42117.208333333336 | 14 |
| 42117.375 | 13.5 |
| 42117.541666666664 | 13 |
| 42117.708333333336 | 13 |
| 42117.875 | 13 |
| 42118.041666666664 | 13 |
| 42118.208333333336 | 13 |
| 42118.375 | 13 |
| 42118.541666666664 | 13 |
| 42118.708333333336 | 13 |
| 42118.875 | 13 |
| 42119.041666666664 | 13 |
| 42119.208333333336 | 13 |
| 42119.375 | 13 |
| 42119.541666666664 | 13 |
| 42119.708333333336 | 13.5 |
| 42119.875 | 13.5 |
| 42120.041666666664 | 13.5 |
| 42120.208333333336 | 13.5 |
| 42120.375 | 13.5 |
| 42120.541666666664 | 13.5 |
| 42120.708333333336 | 13.5 |
| 42120.875 | 13.5 |
| 42121.041666666664 | 13.5 |
| 42121.208333333336 | 13.5 |
| 42121.375 | 14 |
| 42121.541666666664 | 14 |
| 42121.708333333336 | 14 |
| 42121.875 | 14 |
| 42122.041666666664 | 14 |
| 42122.208333333336 | 14 |
| 42122.375 | 14 |
| 42122.541666666664 | 14 |
| 42122.708333333336 | 14 |
| 42122.875 | 14 |
| 42123.041666666664 | 14 |
| 42123.208333333336 | 14 |
| 42123.375 | 13.5 |
| 42123.541666666664 | 13.5 |
| 42123.708333333336 | 13.5 |
| 42123.875 | 13.5 |
| 42124.041666666664 | 13.5 |
| 42124.208333333336 | 13.5 |
| 42124.375 | 13.5 |
| 42124.541666666664 | 14 |
| 42124.708333333336 | 14 |
| 42124.875 | 14 |
| 42125.041666666664 | 14 |
| 42125.208333333336 | 14 |
| 42125.375 | 14 |
| 42125.541666666664 | 14 |
| 42125.708333333336 | 14.5 |
| 42125.875 | 14.5 |
| 42126.041666666664 | 14.5 |
| 42126.208333333336 | 14.5 |
| 42126.375 | 14.5 |
| 42126.541666666664 | 14.5 |
| 42126.708333333336 | 14.5 |
| 42126.875 | 14.5 |
| 42127.041666666664 | 14.5 |
| 42127.208333333336 | 14.5 |
| 42127.375 | 14.5 |
| 42127.541666666664 | 14.5 |
| 42127.708333333336 | 15 |
| 42127.875 | 15 |
| 42128.041666666664 | 15 |
| 42128.208333333336 | 15 |
| 42128.375 | 15 |
| 42128.541666666664 | 15 |
| 42128.708333333336 | 15.5 |
| 42128.875 | 15.5 |
| 42129.041666666664 | 15.5 |
| 42129.208333333336 | 15.5 |
| 42129.375 | 15.5 |
| 42129.541666666664 | 15.5 |
| 42129.708333333336 | 16 |
| 42129.875 | 16 |
| 42130.041666666664 | 16 |
| 42130.208333333336 | 16 |
| 42130.375 | 16 |
| 42130.541666666664 | 16 |
| 42130.708333333336 | 16 |
| 42130.875 | 16.5 |
| 42131.041666666664 | 16.5 |
| 42131.208333333336 | 16 |
| 42131.375 | 16.5 |
| 42131.541666666664 | 16.5 |
| 42131.708333333336 | 16.5 |
| 42131.875 | 17 |
| 42132.041666666664 | 16.5 |
| 42132.208333333336 | 16.5 |
| 42132.375 | 16.5 |
| 42132.541666666664 | 17 |
| 42132.708333333336 | 17 |
| 42132.875 | 17 |
| 42133.041666666664 | 17 |
| 42133.208333333336 | 17 |
| 42133.375 | 17 |
| 42133.541666666664 | 17 |
| 42133.708333333336 | 17 |
| 42133.875 | 17 |
| 42134.041666666664 | 17 |
| 42134.208333333336 | 17 |
| 42134.375 | 17 |
| 42134.541666666664 | 17 |
| 42134.708333333336 | 17.5 |
| 42134.875 | 17.5 |
| 42135.041666666664 | 17 |
| 42135.208333333336 | 17 |
| 42135.375 | 17 |
| 42135.541666666664 | 17 |
| 42135.708333333336 | 17 |
| 42135.875 | 17 |
| 42136.041666666664 | 17 |
| 42136.208333333336 | 17 |
| 42136.375 | 17 |
| 42136.541666666664 | 16.5 |
| 42136.708333333336 | 16.5 |
| 42136.875 | 16.5 |
| 42137.041666666664 | 16.5 |
| 42137.208333333336 | 16.5 |
| 42137.375 | 16 |
| 42137.541666666664 | 16 |
| 42137.708333333336 | 16 |
| 42137.875 | 16 |
| 42138.041666666664 | 15.5 |
| 42138.208333333336 | 15.5 |
| 42138.375 | 15.5 |
| 42138.541666666664 | 15.5 |
| 42138.708333333336 | 16 |
| 42138.875 | 16 |
| 42139.041666666664 | 16 |
| 42139.208333333336 | 16 |
| 42139.375 | 16 |
| 42139.541666666664 | 16 |
| 42139.708333333336 | 16 |
| 42139.875 | 16 |
| 42140.041666666664 | 16 |
| 42140.208333333336 | 16 |
| 42140.375 | 16 |
| 42140.541666666664 | 16 |
| 42140.708333333336 | 16 |
| 42140.875 | 16 |
| 42141.041666666664 | 16 |
| 42141.208333333336 | 16 |
| 42141.375 | 16.5 |
| 42141.541666666664 | 16.5 |
| 42141.708333333336 | 16.5 |
| 42141.875 | 16.5 |
| 42142.041666666664 | 16.5 |
| 42142.208333333336 | 16.5 |
| 42142.375 | 16.5 |
| 42142.541666666664 | 16.5 |
| 42142.708333333336 | 16.5 |
| 42142.875 | 17 |
| 42143.041666666664 | 17 |
| 42143.208333333336 | 17 |
| 42143.375 | 17 |
| 42143.541666666664 | 17 |
| 42143.708333333336 | 17 |
| 42143.875 | 17 |
| 42144.041666666664 | 17 |
| 42144.208333333336 | 17 |
| 42144.375 | 17 |
| 42144.541666666664 | 17 |
| 42144.708333333336 | 17 |
| 42144.875 | 17 |
| 42145.041666666664 | 17 |
| 42145.208333333336 | 17 |
| 42145.375 | 16.5 |
| 42145.541666666664 | 16.5 |
| 42145.708333333336 | 16 |
| 42145.875 | 16 |
| 42146.041666666664 | 16 |
| 42146.208333333336 | 16 |
| 42146.375 | 15.5 |
| 42146.541666666664 | 15.5 |
| 42146.708333333336 | 15.5 |
| 42146.875 | 15.5 |
| 42147.041666666664 | 15.5 |
| 42147.208333333336 | 15.5 |
| 42147.375 | 15.5 |
| 42147.541666666664 | 15.5 |
| 42147.708333333336 | 15.5 |
| 42147.875 | 15.5 |
| 42148.041666666664 | 15.5 |
| 42148.208333333336 | 15.5 |
| 42148.375 | 15.5 |
| 42148.541666666664 | 15.5 |
| 42148.708333333336 | 15.5 |
| 42148.875 | 15.5 |
| 42149.041666666664 | 15.5 |
| 42149.208333333336 | 15.5 |
| 42149.375 | 15.5 |
| 42149.541666666664 | 15.5 |
| 42149.708333333336 | 15.5 |
| 42149.875 | 15.5 |
| 42150.041666666664 | 15.5 |
| 42150.208333333336 | 16 |
| 42150.375 | 16 |
| 42150.541666666664 | 16 |
| 42150.708333333336 | 16 |
| 42150.875 | 16 |
| 42151.041666666664 | 16 |
| 42151.208333333336 | 16 |
| 42151.375 | 16 |
| 42151.541666666664 | 16 |
| 42151.708333333336 | 16.5 |
| 42151.875 | 16.5 |
| 42152.041666666664 | 16.5 |
| 42152.208333333336 | 16.5 |
| 42152.375 | 16.5 |
| 42152.541666666664 | 16.5 |
| 42152.708333333336 | 16.5 |
| 42152.875 | 16.5 |
| 42153.041666666664 | 16.5 |
| 42153.208333333336 | 17 |
| 42153.375 | 17 |
| 42153.541666666664 | 17 |
| 42153.708333333336 | 17 |
| 42153.875 | 17 |
| 42154.041666666664 | 17 |
| 42154.208333333336 | 17 |
| 42154.375 | 17 |
| 42154.541666666664 | 17.5 |
| 42154.708333333336 | 17.5 |
| 42154.875 | 17.5 |
| 42155.041666666664 | 17.5 |
| 42155.208333333336 | 17.5 |
| 42155.375 | 17.5 |
| 42155.541666666664 | 17.5 |
| 42155.708333333336 | 17.5 |
| 42155.875 | 17.5 |
| 42156.041666666664 | 17.5 |
| 42156.208333333336 | 17.5 |
| 42156.375 | 17.5 |
| 42156.541666666664 | 17.5 |
| 42156.708333333336 | 17.5 |
| 42156.875 | 17.5 |
| 42157.041666666664 | 17.5 |
| 42157.208333333336 | 17.5 |
| 42157.375 | 17.5 |
| 42157.541666666664 | 17.5 |
| 42157.708333333336 | 17.5 |
| 42157.875 | 17.5 |
| 42158.041666666664 | 17 |
| 42158.208333333336 | 17 |
| 42158.375 | 17 |
| 42158.541666666664 | 17 |
| 42158.708333333336 | 17 |
| 42158.875 | 17.5 |
| 42159.041666666664 | 17 |
| 42159.208333333336 | 17 |
| 42159.375 | 17 |
| 42159.541666666664 | 17.5 |
| 42159.708333333336 | 17.5 |
| 42159.875 | 17.5 |
| 42160.041666666664 | 17.5 |
| 42160.208333333336 | 17.5 |
| 42160.375 | 17.5 |
| 42160.541666666664 | 17.5 |
| 42160.708333333336 | 17.5 |
| 42160.875 | 17.5 |
| 42161.041666666664 | 17.5 |
| 42161.208333333336 | 17.5 |
| 42161.375 | 17.5 |
| 42161.541666666664 | 17.5 |
| 42161.708333333336 | 18 |
| 42161.875 | 18 |
| 42162.041666666664 | 18 |
| 42162.208333333336 | 18 |
| 42162.375 | 18 |
| 42162.541666666664 | 18 |
| 42162.708333333336 | 18 |
| 42162.875 | 18 |
| 42163.041666666664 | 18 |
| 42163.208333333336 | 18 |
| 42163.375 | 18.5 |
| 42163.541666666664 | 18.5 |
| 42163.708333333336 | 18.5 |
| 42163.875 | 18.5 |
| 42164.041666666664 | 18.5 |
| 42164.208333333336 | 18.5 |
| 42164.375 | 18.5 |
| 42164.541666666664 | 18.5 |
| 42164.708333333336 | 18.5 |
| 42164.875 | 19 |
| 42165.041666666664 | 19 |
| 42165.208333333336 | 19 |
| 42165.375 | 19 |
| 42165.541666666664 | 19 |
| 42165.708333333336 | 19 |
| 42165.875 | 19 |
| 42166.041666666664 | 19 |
| 42166.208333333336 | 19 |
| 42166.375 | 19 |
| 42166.541666666664 | 19 |
| 42166.708333333336 | 19 |
| 42166.875 | 19 |
| 42167.041666666664 | 19 |
| 42167.208333333336 | 19 |
| 42167.375 | 19 |
| 42167.541666666664 | 19 |
| 42167.708333333336 | 19.5 |
| 42167.875 | 19.5 |
| 42168.041666666664 | 19.5 |
| 42168.208333333336 | 19.5 |
| 42168.375 | 19.5 |
| 42168.541666666664 | 19.5 |
| 42168.708333333336 | 19.5 |
| 42168.875 | 19.5 |
| 42169.041666666664 | 19.5 |
| 42169.208333333336 | 19.5 |
| 42169.375 | 19.5 |
| 42169.541666666664 | 19.5 |
| 42169.708333333336 | 19.5 |
| 42169.875 | 19.5 |
| 42170.041666666664 | 19.5 |
| 42170.208333333336 | 19.5 |
| 42170.375 | 19.5 |
| 42170.541666666664 | 19.5 |
| 42170.708333333336 | 20 |
| 42170.875 | 20 |
| 42171.041666666664 | 20 |
| 42171.208333333336 | 20 |
| 42171.375 | 20 |
| 42171.541666666664 | 20 |
| 42171.708333333336 | 20 |
| 42171.875 | 20 |
| 42172.041666666664 | 20 |
| 42172.208333333336 | 19.5 |
| 42172.375 | 19.5 |
| 42172.541666666664 | 20 |
| 42172.708333333336 | 20 |
| 42172.875 | 19.5 |
| 42173.041666666664 | 19.5 |
| 42173.208333333336 | 19.5 |
| 42173.375 | 19.5 |
| 42173.541666666664 | 19.5 |
| 42173.708333333336 | 19.5 |
| 42173.875 | 19.5 |
| 42174.041666666664 | 19.5 |
| 42174.208333333336 | 19.5 |
| 42174.375 | 19.5 |
| 42174.541666666664 | 19.5 |
| 42174.708333333336 | 19.5 |
| 42174.875 | 19.5 |
| 42175.041666666664 | 19.5 |
| 42175.208333333336 | 19.5 |
| 42175.375 | 19.5 |
| 42175.541666666664 | 19.5 |
| 42175.708333333336 | 19.5 |
| 42175.875 | 19.5 |
| 42176.041666666664 | 19.5 |
| 42176.208333333336 | 19.5 |
| 42176.375 | 19.5 |
| 42176.541666666664 | 19.5 |
| 42176.708333333336 | 19.5 |
| 42176.875 | 19.5 |
| 42177.041666666664 | 19.5 |
| 42177.208333333336 | 19.5 |
| 42177.375 | 19.5 |
| 42177.541666666664 | 19.5 |
| 42177.708333333336 | 20 |
| 42177.875 | 20 |
| 42178.041666666664 | 20 |
| 42178.208333333336 | 20 |
| 42178.375 | 20 |
| 42178.541666666664 | 20 |
| 42178.708333333336 | 20 |
| 42178.875 | 20 |
| 42179.041666666664 | 20 |
| 42179.208333333336 | 20 |
| 42179.375 | 20 |
| 42179.541666666664 | 20 |
| 42179.708333333336 | 20 |
| 42179.875 | 20 |
| 42180.041666666664 | 20 |
| 42180.208333333336 | 20 |
| 42180.375 | 20 |
| 42180.541666666664 | 20.5 |
| 42180.708333333336 | 20.5 |
| 42180.875 | 20.5 |
| 42181.041666666664 | 20.5 |
| 42181.208333333336 | 20.5 |
| 42181.375 | 20.5 |
| 42181.541666666664 | 20.5 |
| 42181.708333333336 | 20.5 |
| 42181.875 | 20.5 |
| 42182.041666666664 | 20.5 |
| 42182.208333333336 | 20.5 |
| 42182.375 | 20.5 |
| 42182.541666666664 | 20.5 |
| 42182.708333333336 | 20.5 |
| 42182.875 | 20.5 |
| 42183.041666666664 | 20.5 |
| 42183.208333333336 | 20.5 |
| 42183.375 | 20.5 |
| 42183.541666666664 | 20.5 |
| 42183.708333333336 | 20.5 |
| 42183.875 | 20.5 |
| 42184.041666666664 | 20.5 |
| 42184.208333333336 | 20 |
| 42184.375 | 20 |
| 42184.541666666664 | 20 |
| 42184.708333333336 | 20 |
| 42184.875 | 20 |
| 42185.041666666664 | 20 |
| 42185.208333333336 | 20 |
| 42185.375 | 20 |
| 42185.541666666664 | 20 |
| 42185.708333333336 | 20 |
| 42185.875 | 20 |
| 42186.041666666664 | 20 |
| 42186.208333333336 | 20 |
| 42186.375 | 20 |
| 42186.541666666664 | 20 |
| 42186.708333333336 | 20 |
| 42186.875 | 20 |
| 42187.041666666664 | 20 |
| 42187.208333333336 | 20 |
| 42187.375 | 20 |
| 42187.541666666664 | 20 |
| 42187.708333333336 | 20 |
| 42187.875 | 20 |
| 42188.041666666664 | 20 |
| 42188.208333333336 | 20 |
| 42188.375 | 20 |
| 42188.541666666664 | 20 |
| 42188.708333333336 | 20 |
| 42188.875 | 20 |
| 42189.041666666664 | 20 |
| 42189.208333333336 | 20 |
| 42189.375 | 20 |
| 42189.541666666664 | 20 |
| 42189.708333333336 | 20 |
| 42189.875 | 20 |
| 42190.041666666664 | 20 |
| 42190.208333333336 | 20 |
| 42190.375 | 20 |
| 42190.541666666664 | 20 |
| 42190.708333333336 | 20 |
| 42190.875 | 20 |
| 42191.041666666664 | 20 |
| 42191.208333333336 | 20 |
| 42191.375 | 20 |
| 42191.541666666664 | 20 |
| 42191.708333333336 | 20 |
| 42191.875 | 20 |
| 42192.041666666664 | 20 |
| 42192.208333333336 | 20 |
| 42192.375 | 20 |
| 42192.541666666664 | 20 |
| 42192.708333333336 | 20 |
| 42192.875 | 20 |
| 42193.041666666664 | 20 |
| 42193.208333333336 | 20 |
| 42193.375 | 20 |
| 42193.541666666664 | 20 |
| 42193.708333333336 | 20 |
| 42193.875 | 20 |
| 42194.041666666664 | 20 |
| 42194.208333333336 | 20 |
| 42194.375 | 20 |
| 42194.541666666664 | 20 |
| 42194.708333333336 | 20 |
| 42194.875 | 20 |
| 42195.041666666664 | 20 |
| 42195.208333333336 | 20 |
| 42195.375 | 20 |
| 42195.541666666664 | 20 |
| 42195.708333333336 | 20 |
| 42195.875 | 20 |
| 42196.041666666664 | 20 |
| 42196.208333333336 | 20 |
| 42196.375 | 20 |
| 42196.541666666664 | 20 |
| 42196.708333333336 | 20 |
| 42196.875 | 20 |
| 42197.041666666664 | 20 |
| 42197.208333333336 | 20 |
| 42197.375 | 20 |
| 42197.541666666664 | 20 |
| 42197.708333333336 | 20 |
| 42197.875 | 20 |
| 42198.041666666664 | 20 |
| 42198.208333333336 | 20 |
| 42198.375 | 20 |
| 42198.541666666664 | 20 |
| 42198.708333333336 | 20 |
| 42198.875 | 20 |
| 42199.041666666664 | 20 |
| 42199.208333333336 | 20 |
| 42199.375 | 20 |
| 42199.541666666664 | 20 |
| 42199.708333333336 | 20.5 |
| 42199.875 | 20.5 |
| 42200.041666666664 | 20.5 |
| 42200.208333333336 | 20.5 |
| 42200.375 | 20.5 |
| 42200.541666666664 | 20.5 |
| 42200.708333333336 | 20.5 |
| 42200.875 | 20.5 |
| 42201.041666666664 | 20.5 |
| 42201.208333333336 | 20.5 |
| 42201.375 | 20.5 |
| 42201.541666666664 | 20.5 |
| 42201.708333333336 | 20.5 |
| 42201.875 | 20.5 |
| 42202.041666666664 | 20.5 |
| 42202.208333333336 | 20.5 |
| 42202.375 | 20.5 |
| 42202.541666666664 | 20.5 |
| 42202.708333333336 | 20.5 |
| 42202.875 | 20.5 |
| 42203.041666666664 | 20.5 |
| 42203.208333333336 | 21 |
| 42203.375 | 20.5 |
| 42203.541666666664 | 21 |
| 42203.708333333336 | 21 |
| 42203.875 | 21 |
| 42204.041666666664 | 21 |
| 42204.208333333336 | 21 |
| 42204.375 | 21 |
| 42204.541666666664 | 21 |
| 42204.708333333336 | 21 |
| 42204.875 | 21 |
| 42205.041666666664 | 21 |
| 42205.208333333336 | 21 |
| 42205.375 | 21 |
| 42205.541666666664 | 21 |
| 42205.708333333336 | 21 |
| 42205.875 | 21 |
| 42206.041666666664 | 21 |
| 42206.208333333336 | 21 |
| 42206.375 | 21 |
| 42206.541666666664 | 21 |
| 42206.708333333336 | 21 |
| 42206.875 | 21 |
| 42207.041666666664 | 21 |
| 42207.208333333336 | 21 |
| 42207.375 | 21 |
| 42207.541666666664 | 21 |
| 42207.708333333336 | 21 |
| 42207.875 | 21 |
| 42208.041666666664 | 21 |
| 42208.208333333336 | 21 |
| 42208.375 | 21 |
| 42208.541666666664 | 21 |
| 42208.708333333336 | 21 |
| 42208.875 | 21 |
| 42209.041666666664 | 21 |
| 42209.208333333336 | 21 |
| 42209.375 | 21 |
| 42209.541666666664 | 21 |
| 42209.708333333336 | 21 |
| 42209.875 | 21 |
| 42210.041666666664 | 21.5 |
| 42210.208333333336 | 21.5 |
| 42210.375 | 21.5 |
| 42210.541666666664 | 21.5 |
| 42210.708333333336 | 21.5 |
| 42210.875 | 21.5 |
| 42211.041666666664 | 21.5 |
| 42211.208333333336 | 21.5 |
| 42211.375 | 21.5 |
| 42211.541666666664 | 21.5 |
| 42211.708333333336 | 21.5 |
| 42211.875 | 21.5 |
| 42212.041666666664 | 21.5 |
| 42212.208333333336 | 21.5 |
| 42212.375 | 21.5 |
| 42212.541666666664 | 21.5 |
| 42212.708333333336 | 21.5 |
| 42212.875 | 21.5 |
| 42213.041666666664 | 21.5 |
| 42213.208333333336 | 21.5 |
| 42213.375 | 21.5 |
| 42213.541666666664 | 21.5 |
| 42213.708333333336 | 21.5 |
| 42213.875 | 21.5 |
| 42214.041666666664 | 21.5 |
| 42214.208333333336 | 21.5 |
| 42214.375 | 22 |
| 42214.541666666664 | 22 |
| 42214.708333333336 | 22 |
| 42214.875 | 22 |
| 42215.041666666664 | 22 |
| 42215.208333333336 | 22 |
| 42215.375 | 22 |
| 42215.541666666664 | 22 |
| 42215.708333333336 | 22 |
| 42215.875 | 22 |
| 42216.041666666664 | 22 |
| 42216.208333333336 | 22 |
| 42216.375 | 22 |
| 42216.541666666664 | 22 |
| 42216.708333333336 | 22 |
| 42216.875 | 22 |
| 42217.041666666664 | 22 |
| 42217.208333333336 | 22 |
| 42217.375 | 22 |
| 42217.541666666664 | 22 |
| 42217.708333333336 | 22 |
| 42217.875 | 22 |
| 42218.041666666664 | 22 |
| 42218.208333333336 | 21.5 |
| 42218.375 | 21.5 |
| 42218.541666666664 | 21.5 |
| 42218.708333333336 | 21.5 |
| 42218.875 | 22 |
| 42219.041666666664 | 22 |
| 42219.208333333336 | 21.5 |
| 42219.375 | 21.5 |
| 42219.541666666664 | 21.5 |
| 42219.708333333336 | 21.5 |
| 42219.875 | 21.5 |
| 42220.041666666664 | 21.5 |
| 42220.208333333336 | 21.5 |
| 42220.375 | 21.5 |
| 42220.541666666664 | 21.5 |
| 42220.708333333336 | 21.5 |
| 42220.875 | 21.5 |
| 42221.041666666664 | 21.5 |
| 42221.208333333336 | 21.5 |
| 42221.375 | 21.5 |
| 42221.541666666664 | 21.5 |
| 42221.708333333336 | 21.5 |
| 42221.875 | 21.5 |
| 42222.041666666664 | 21.5 |
| 42222.208333333336 | 21.5 |
| 42222.375 | 21.5 |
| 42222.541666666664 | 21.5 |
| 42222.708333333336 | 21.5 |
| 42222.875 | 21.5 |
| 42223.041666666664 | 21.5 |
| 42223.208333333336 | 21.5 |
| 42223.375 | 21.5 |
| 42223.541666666664 | 21.5 |
| 42223.708333333336 | 22 |
| 42223.875 | 22 |
| 42224.041666666664 | 22 |
| 42224.208333333336 | 21.5 |
| 42224.375 | 21.5 |
| 42224.541666666664 | 22 |
| 42224.708333333336 | 22 |
| 42224.875 | 22 |
| 42225.041666666664 | 22 |
| 42225.208333333336 | 22 |
| 42225.375 | 22 |
| 42225.541666666664 | 22 |
| 42225.708333333336 | 22 |
| 42225.875 | 22 |
| 42226.041666666664 | 22 |
| 42226.208333333336 | 22 |
| 42226.375 | 22 |
| 42226.541666666664 | 22 |
| 42226.708333333336 | 22 |
| 42226.875 | 22 |
| 42227.041666666664 | 22 |
| 42227.208333333336 | 22 |
| 42227.375 | 22 |
| 42227.541666666664 | 22 |
| 42227.708333333336 | 22.5 |
| 42227.875 | 22.5 |
| 42228.041666666664 | 22.5 |
| 42228.208333333336 | 22.5 |
| 42228.375 | 22 |
| 42228.541666666664 | 22 |
| 42228.708333333336 | 22 |
| 42228.875 | 22 |
| 42229.041666666664 | 22 |
| 42229.208333333336 | 22 |
| 42229.375 | 21.5 |
| 42229.541666666664 | 21.5 |
| 42229.708333333336 | 21.5 |
| 42229.875 | 21.5 |
| 42230.041666666664 | 21.5 |
| 42230.208333333336 | 21.5 |
| 42230.375 | 21.5 |
| 42230.541666666664 | 21 |
| 42230.708333333336 | 21 |
| 42230.875 | 21 |
| 42231.041666666664 | 21 |
| 42231.208333333336 | 21 |
| 42231.375 | 21 |
| 42231.541666666664 | 21 |
| 42231.708333333336 | 21 |
| 42231.875 | 21 |
| 42232.041666666664 | 21 |
| 42232.208333333336 | 21 |
| 42232.375 | 21 |
| 42232.541666666664 | 21 |
| 42232.708333333336 | 21.5 |
| 42232.875 | 21.5 |
| 42233.041666666664 | 21.5 |
| 42233.208333333336 | 21.5 |
| 42233.375 | 21.5 |
| 42233.541666666664 | 21.5 |
| 42233.708333333336 | 21.5 |
| 42233.875 | 21.5 |
| 42234.041666666664 | 21.5 |
| 42234.208333333336 | 21.5 |
| 42234.375 | 21.5 |
| 42234.541666666664 | 21.5 |
| 42234.708333333336 | 21.5 |
| 42234.875 | 21.5 |
| 42235.041666666664 | 21.5 |
| 42235.208333333336 | 21.5 |
| 42235.375 | 21.5 |
| 42235.541666666664 | 21.5 |
| 42235.708333333336 | 21 |
| 42235.875 | 21 |
| 42236.041666666664 | 20.5 |
| 42236.208333333336 | 20 |
| 42236.375 | 19.5 |
| 42236.541666666664 | 19 |
| 42236.708333333336 | 19 |
| 42236.875 | 19 |
| 42237.041666666664 | 19.5 |
| 42237.208333333336 | 19 |
| 42237.375 | 19 |
| 42237.541666666664 | 19 |
| 42237.708333333336 | 19 |
| 42237.875 | 19 |
| 42238.041666666664 | 19 |
| 42238.208333333336 | 19 |
| 42238.375 | 19 |
| 42238.541666666664 | 19 |
| 42238.708333333336 | 19.5 |
| 42238.875 | 19.5 |
| 42239.041666666664 | 19.5 |
| 42239.208333333336 | 19.5 |
| 42239.375 | 19.5 |
| 42239.541666666664 | 19.5 |
| 42239.708333333336 | 19.5 |
| 42239.875 | 19.5 |
| 42240.041666666664 | 20 |
| 42240.208333333336 | 20 |
| 42240.375 | 19.5 |
| 42240.541666666664 | 19.5 |
| 42240.708333333336 | 19.5 |
| 42240.875 | 19.5 |
| 42241.041666666664 | 19.5 |
| 42241.208333333336 | 19.5 |
| 42241.375 | 19 |
| 42241.541666666664 | 19 |
| 42241.708333333336 | 19 |
| 42241.875 | 19 |
| 42242.041666666664 | 19 |
| 42242.208333333336 | 19 |
| 42242.375 | 19 |
| 42242.541666666664 | 19 |
| 42242.708333333336 | 19 |
| 42242.875 | 19 |
| 42243.041666666664 | 19 |
| 42243.208333333336 | 19 |
| 42243.375 | 19 |
| 42243.541666666664 | 19 |
| 42243.708333333336 | 19.5 |
| 42243.875 | 19.5 |
| 42244.041666666664 | 19.5 |
| 42244.208333333336 | 19.5 |
| 42244.375 | 19 |
| 42244.541666666664 | 19 |
| 42244.708333333336 | 19 |
| 42244.875 | 19 |
| 42245.041666666664 | 19.5 |
| 42245.208333333336 | 19.5 |
| 42245.375 | 19.5 |
| 42245.541666666664 | 19.5 |
| 42245.708333333336 | 19.5 |
| 42245.875 | 19.5 |
| 42246.041666666664 | 19.5 |
| 42246.208333333336 | 19.5 |
| 42246.375 | 20 |
| 42246.541666666664 | 20 |
| 42246.708333333336 | 20 |
| 42246.875 | 20 |
| 42247.041666666664 | 20 |
| 42247.208333333336 | 20 |
| 42247.375 | 20 |
| 42247.541666666664 | 20 |
| 42247.708333333336 | 20 |
| 42247.875 | 20 |
| 42248.041666666664 | 20 |
| 42248.208333333336 | 20 |
| 42248.375 | 20 |
| 42248.541666666664 | 20.5 |
| 42248.708333333336 | 20.5 |
| 42248.875 | 20.5 |
| 42249.041666666664 | 20.5 |
| 42249.208333333336 | 20.5 |
| 42249.375 | 20.5 |
| 42249.541666666664 | 20.5 |
| 42249.708333333336 | 20.5 |
| 42249.875 | 20.5 |
| 42250.041666666664 | 20.5 |
| 42250.208333333336 | 20.5 |
| 42250.375 | 20.5 |
| 42250.541666666664 | 20.5 |
| 42250.708333333336 | 21 |
| 42250.875 | 21 |
| 42251.041666666664 | 21 |
| 42251.208333333336 | 21 |
| 42251.375 | 21 |
| 42251.541666666664 | 21 |
| 42251.708333333336 | 21 |
| 42251.875 | 21 |
| 42252.041666666664 | 21 |
| 42252.208333333336 | 21 |
| 42252.375 | 21 |
| 42252.541666666664 | 21 |
| 42252.708333333336 | 21 |
| 42252.875 | 21 |
| 42253.041666666664 | 21.5 |
| 42253.208333333336 | 21.5 |
| 42253.375 | 21 |
| 42253.541666666664 | 21.5 |
| 42253.708333333336 | 21.5 |
| 42253.875 | 21.5 |
| 42254.041666666664 | 21.5 |
| 42254.208333333336 | 21.5 |
| 42254.375 | 21.5 |
| 42254.541666666664 | 21.5 |
| 42254.708333333336 | 21.5 |
| 42254.875 | 21.5 |
| 42255.041666666664 | 21.5 |
| 42255.208333333336 | 21.5 |
| 42255.375 | 21.5 |
| 42255.541666666664 | 21.5 |
| 42255.708333333336 | 21.5 |
| 42255.875 | 21.5 |
| 42256.041666666664 | 21.5 |
| 42256.208333333336 | 21.5 |
| 42256.375 | 21.5 |
| 42256.541666666664 | 21.5 |
| 42256.708333333336 | 21.5 |
| 42256.875 | 21.5 |
| 42257.041666666664 | 21.5 |
| 42257.208333333336 | 21.5 |
| 42257.375 | 21 |
| 42257.541666666664 | 21 |
| 42257.708333333336 | 21 |
| 42257.875 | 21 |
| 42258.041666666664 | 21 |
| 42258.208333333336 | 21 |
| 42258.375 | 21 |
| 42258.541666666664 | 21 |
| 42258.708333333336 | 21 |
| 42258.875 | 21 |
| 42259.041666666664 | 21 |
| 42259.208333333336 | 20.5 |
| 42259.375 | 20 |
| 42259.541666666664 | 19 |
| 42259.708333333336 | 19 |
| 42259.875 | 19 |
| 42260.041666666664 | 19 |
| 42260.208333333336 | 18.5 |
| 42260.375 | 18.5 |
| 42260.541666666664 | 18 |
| 42260.708333333336 | 18 |
| 42260.875 | 18 |
| 42261.041666666664 | 18 |
| 42261.208333333336 | 18 |
| 42261.375 | 18 |
| 42261.541666666664 | 17.5 |
| 42261.708333333336 | 18 |
| 42261.875 | 18 |
| 42262.041666666664 | 18 |
| 42262.208333333336 | 18 |
| 42262.375 | 18 |
| 42262.541666666664 | 18 |
| 42262.708333333336 | 18 |
| 42262.875 | 18 |
| 42263.041666666664 | 18 |
| 42263.208333333336 | 18 |
| 42263.375 | 18 |
| 42263.541666666664 | 18 |
| 42263.708333333336 | 18.5 |
| 42263.875 | 18.5 |
| 42264.041666666664 | 18.5 |
| 42264.208333333336 | 18.5 |
| 42264.375 | 18.5 |
| 42264.541666666664 | 18.5 |
| 42264.708333333336 | 18.5 |
| 42264.875 | 18.5 |
| 42265.041666666664 | 19 |
| 42265.208333333336 | 19 |
| 42265.375 | 19 |
| 42265.541666666664 | 19 |
| 42265.708333333336 | 19 |
| 42265.875 | 19 |
| 42266.041666666664 | 19 |
| 42266.208333333336 | 19 |
| 42266.375 | 19.5 |
| 42266.541666666664 | 19.5 |
| 42266.708333333336 | 19.5 |
| 42266.875 | 19.5 |
| 42267.041666666664 | 19.5 |
| 42267.208333333336 | 19.5 |
| 42267.375 | 19.5 |
| 42267.541666666664 | 19 |
| 42267.708333333336 | 19 |
| 42267.875 | 19 |
| 42268.041666666664 | 18.5 |
| 42268.208333333336 | 18.5 |
| 42268.375 | 18.5 |
| 42268.541666666664 | 18 |
| 42268.708333333336 | 18 |
| 42268.875 | 18 |
| 42269.041666666664 | 18 |
| 42269.208333333336 | 18 |
| 42269.375 | 18 |
| 42269.541666666664 | 18 |
| 42269.708333333336 | 18.5 |
| 42269.875 | 18.5 |
| 42270.041666666664 | 18.5 |
| 42270.208333333336 | 18.5 |
| 42270.375 | 18.5 |
| 42270.541666666664 | 18.5 |
| 42270.708333333336 | 18.5 |
| 42270.875 | 18.5 |
| 42271.041666666664 | 18.5 |
| 42271.208333333336 | 18.5 |
| 42271.375 | 18.5 |
| 42271.541666666664 | 18.5 |
| 42271.708333333336 | 18.5 |
| 42271.875 | 18.5 |
| 42272.041666666664 | 18.5 |
| 42272.208333333336 | 18.5 |
| 42272.375 | 18.5 |
| 42272.541666666664 | 18.5 |
| 42272.708333333336 | 18.5 |
| 42272.875 | 18.5 |
| 42273.041666666664 | 18.5 |
| 42273.208333333336 | 18.5 |
| 42273.375 | 18.5 |
| 42273.541666666664 | 18.5 |
| 42273.708333333336 | 18.5 |
| 42273.875 | 18.5 |
| 42274.041666666664 | 18.5 |
| 42274.208333333336 | 18.5 |
| 42274.375 | 18.5 |
| 42274.541666666664 | 18.5 |
| 42274.708333333336 | 18.5 |
| 42274.875 | 18.5 |
| 42275.041666666664 | 18.5 |
| 42275.208333333336 | 18.5 |
| 42275.375 | 18.5 |
| 42275.541666666664 | 18.5 |
| 42275.708333333336 | 18.5 |
| 42275.875 | 18.5 |
| 42276.041666666664 | 18.5 |
| 42276.208333333336 | 18.5 |
| 42276.375 | 18.5 |
| 42276.541666666664 | 18.5 |
| 42276.708333333336 | 19 |
| 42276.875 | 19 |
| 42277.041666666664 | 19 |
| 42277.208333333336 | 19 |
| 42277.375 | 19 |
| 42277.541666666664 | 19 |
| 42277.708333333336 | 19 |
| 42277.875 | 19 |
| 42278.041666666664 | 19 |
| 42278.208333333336 | 19 |
| 42278.375 | 18.5 |
| 42278.541666666664 | 18 |
| 42278.708333333336 | 17.5 |
| 42278.875 | 17.5 |
| 42279.041666666664 | 17.5 |
| 42279.208333333336 | 17 |
| 42279.375 | 16.5 |